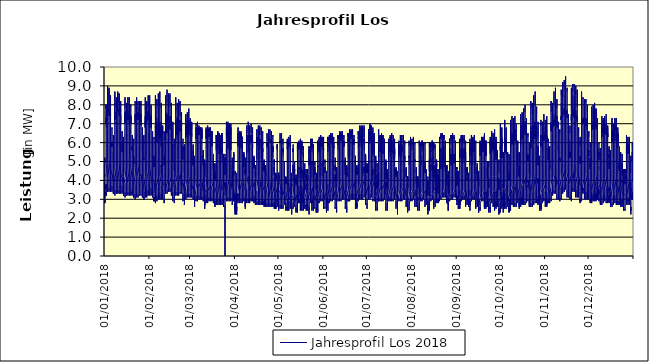
| Category | Jahresprofil Los 2018 |
|---|---|
| 01/01/2018 | 3.4 |
| 01/01/2018 | 3.2 |
| 01/01/2018 | 3.1 |
| 01/01/2018 | 2.9 |
| 01/01/2018 | 3 |
| 01/01/2018 | 2.8 |
| 01/01/2018 | 3 |
| 01/01/2018 | 2.8 |
| 01/01/2018 | 3.2 |
| 01/01/2018 | 3.1 |
| 01/01/2018 | 3.9 |
| 01/01/2018 | 4.3 |
| 01/01/2018 | 4.2 |
| 01/01/2018 | 4.4 |
| 01/01/2018 | 4.5 |
| 01/01/2018 | 4.7 |
| 01/01/2018 | 5.1 |
| 01/01/2018 | 5 |
| 01/01/2018 | 5.2 |
| 01/01/2018 | 4.9 |
| 01/01/2018 | 4.4 |
| 01/01/2018 | 4.3 |
| 01/01/2018 | 3.8 |
| 02/01/2018 | 3.5 |
| 02/01/2018 | 3.8 |
| 02/01/2018 | 3.2 |
| 02/01/2018 | 3.4 |
| 02/01/2018 | 3.2 |
| 02/01/2018 | 3.4 |
| 02/01/2018 | 3.6 |
| 02/01/2018 | 4.9 |
| 02/01/2018 | 5.7 |
| 02/01/2018 | 6.3 |
| 02/01/2018 | 6.7 |
| 02/01/2018 | 6.7 |
| 02/01/2018 | 6.9 |
| 02/01/2018 | 7.1 |
| 02/01/2018 | 7.3 |
| 02/01/2018 | 7 |
| 02/01/2018 | 7 |
| 02/01/2018 | 7.7 |
| 02/01/2018 | 8 |
| 02/01/2018 | 7.8 |
| 02/01/2018 | 8 |
| 02/01/2018 | 6.8 |
| 02/01/2018 | 6 |
| 02/01/2018 | 5.5 |
| 03/01/2018 | 4.9 |
| 03/01/2018 | 4.1 |
| 03/01/2018 | 3.9 |
| 03/01/2018 | 3.6 |
| 03/01/2018 | 3.4 |
| 03/01/2018 | 3.6 |
| 03/01/2018 | 4.1 |
| 03/01/2018 | 4.9 |
| 03/01/2018 | 6 |
| 03/01/2018 | 7 |
| 03/01/2018 | 7.3 |
| 03/01/2018 | 7.2 |
| 03/01/2018 | 7.3 |
| 03/01/2018 | 7.4 |
| 03/01/2018 | 7.7 |
| 03/01/2018 | 7.6 |
| 03/01/2018 | 7.6 |
| 03/01/2018 | 8.5 |
| 03/01/2018 | 9 |
| 03/01/2018 | 7.8 |
| 03/01/2018 | 7.6 |
| 03/01/2018 | 7.4 |
| 03/01/2018 | 6.7 |
| 03/01/2018 | 5.9 |
| 04/01/2018 | 5.1 |
| 04/01/2018 | 4.1 |
| 04/01/2018 | 3.9 |
| 04/01/2018 | 3.6 |
| 04/01/2018 | 3.4 |
| 04/01/2018 | 3.6 |
| 04/01/2018 | 4.1 |
| 04/01/2018 | 4.9 |
| 04/01/2018 | 6 |
| 04/01/2018 | 6.9 |
| 04/01/2018 | 7.1 |
| 04/01/2018 | 7.5 |
| 04/01/2018 | 7.6 |
| 04/01/2018 | 7.8 |
| 04/01/2018 | 7.6 |
| 04/01/2018 | 7.4 |
| 04/01/2018 | 7.4 |
| 04/01/2018 | 8.8 |
| 04/01/2018 | 8.9 |
| 04/01/2018 | 7.8 |
| 04/01/2018 | 7.7 |
| 04/01/2018 | 7.4 |
| 04/01/2018 | 6.7 |
| 04/01/2018 | 5.9 |
| 05/01/2018 | 5.1 |
| 05/01/2018 | 4.2 |
| 05/01/2018 | 3.5 |
| 05/01/2018 | 3.7 |
| 05/01/2018 | 3.4 |
| 05/01/2018 | 3.6 |
| 05/01/2018 | 4 |
| 05/01/2018 | 5.3 |
| 05/01/2018 | 6.3 |
| 05/01/2018 | 6.7 |
| 05/01/2018 | 7 |
| 05/01/2018 | 6.9 |
| 05/01/2018 | 7.5 |
| 05/01/2018 | 7.5 |
| 05/01/2018 | 7.4 |
| 05/01/2018 | 7.6 |
| 05/01/2018 | 7.5 |
| 05/01/2018 | 8.2 |
| 05/01/2018 | 8.5 |
| 05/01/2018 | 7.8 |
| 05/01/2018 | 7.5 |
| 05/01/2018 | 6.9 |
| 05/01/2018 | 6.4 |
| 05/01/2018 | 5.5 |
| 06/01/2018 | 4.6 |
| 06/01/2018 | 4.3 |
| 06/01/2018 | 3.8 |
| 06/01/2018 | 3.5 |
| 06/01/2018 | 3.5 |
| 06/01/2018 | 3.4 |
| 06/01/2018 | 3.4 |
| 06/01/2018 | 3.7 |
| 06/01/2018 | 4.5 |
| 06/01/2018 | 4.9 |
| 06/01/2018 | 5.3 |
| 06/01/2018 | 6 |
| 06/01/2018 | 5.8 |
| 06/01/2018 | 5.9 |
| 06/01/2018 | 5.8 |
| 06/01/2018 | 5.9 |
| 06/01/2018 | 5.9 |
| 06/01/2018 | 6.8 |
| 06/01/2018 | 6.7 |
| 06/01/2018 | 6.3 |
| 06/01/2018 | 6.3 |
| 06/01/2018 | 6.2 |
| 06/01/2018 | 5.6 |
| 06/01/2018 | 4.9 |
| 07/01/2018 | 4.4 |
| 07/01/2018 | 3.9 |
| 07/01/2018 | 3.6 |
| 07/01/2018 | 3.3 |
| 07/01/2018 | 3.4 |
| 07/01/2018 | 3.3 |
| 07/01/2018 | 3.4 |
| 07/01/2018 | 3.6 |
| 07/01/2018 | 3.6 |
| 07/01/2018 | 4.3 |
| 07/01/2018 | 4.7 |
| 07/01/2018 | 5.1 |
| 07/01/2018 | 5.3 |
| 07/01/2018 | 5.3 |
| 07/01/2018 | 5.5 |
| 07/01/2018 | 5.1 |
| 07/01/2018 | 5.2 |
| 07/01/2018 | 6.1 |
| 07/01/2018 | 6.4 |
| 07/01/2018 | 5.9 |
| 07/01/2018 | 5.9 |
| 07/01/2018 | 6 |
| 07/01/2018 | 5.7 |
| 07/01/2018 | 4.9 |
| 08/01/2018 | 4.4 |
| 08/01/2018 | 3.9 |
| 08/01/2018 | 3.5 |
| 08/01/2018 | 3.4 |
| 08/01/2018 | 3.2 |
| 08/01/2018 | 3.5 |
| 08/01/2018 | 4 |
| 08/01/2018 | 4.9 |
| 08/01/2018 | 5.8 |
| 08/01/2018 | 6.8 |
| 08/01/2018 | 7.1 |
| 08/01/2018 | 7 |
| 08/01/2018 | 7.1 |
| 08/01/2018 | 7.4 |
| 08/01/2018 | 7.2 |
| 08/01/2018 | 7.6 |
| 08/01/2018 | 7.5 |
| 08/01/2018 | 8.1 |
| 08/01/2018 | 8.7 |
| 08/01/2018 | 8 |
| 08/01/2018 | 7.9 |
| 08/01/2018 | 7.1 |
| 08/01/2018 | 6.4 |
| 08/01/2018 | 5.6 |
| 09/01/2018 | 4.7 |
| 09/01/2018 | 3.8 |
| 09/01/2018 | 3.7 |
| 09/01/2018 | 3.5 |
| 09/01/2018 | 3.3 |
| 09/01/2018 | 3.5 |
| 09/01/2018 | 3.9 |
| 09/01/2018 | 5.3 |
| 09/01/2018 | 6.2 |
| 09/01/2018 | 6.7 |
| 09/01/2018 | 7 |
| 09/01/2018 | 7.3 |
| 09/01/2018 | 7.4 |
| 09/01/2018 | 7.6 |
| 09/01/2018 | 7.3 |
| 09/01/2018 | 7.7 |
| 09/01/2018 | 7.7 |
| 09/01/2018 | 8.2 |
| 09/01/2018 | 8.4 |
| 09/01/2018 | 7.8 |
| 09/01/2018 | 7.6 |
| 09/01/2018 | 7.3 |
| 09/01/2018 | 6.5 |
| 09/01/2018 | 5.6 |
| 10/01/2018 | 4.8 |
| 10/01/2018 | 3.9 |
| 10/01/2018 | 3.8 |
| 10/01/2018 | 3.5 |
| 10/01/2018 | 3.3 |
| 10/01/2018 | 3.5 |
| 10/01/2018 | 4 |
| 10/01/2018 | 5.3 |
| 10/01/2018 | 6.3 |
| 10/01/2018 | 6.8 |
| 10/01/2018 | 7 |
| 10/01/2018 | 7.4 |
| 10/01/2018 | 7.5 |
| 10/01/2018 | 7.6 |
| 10/01/2018 | 7.8 |
| 10/01/2018 | 7.6 |
| 10/01/2018 | 7.6 |
| 10/01/2018 | 8.6 |
| 10/01/2018 | 8.7 |
| 10/01/2018 | 8.1 |
| 10/01/2018 | 7.9 |
| 10/01/2018 | 7.1 |
| 10/01/2018 | 6.4 |
| 10/01/2018 | 5.6 |
| 11/01/2018 | 4.8 |
| 11/01/2018 | 3.9 |
| 11/01/2018 | 3.8 |
| 11/01/2018 | 3.5 |
| 11/01/2018 | 3.3 |
| 11/01/2018 | 3.5 |
| 11/01/2018 | 4 |
| 11/01/2018 | 5.3 |
| 11/01/2018 | 6.3 |
| 11/01/2018 | 6.7 |
| 11/01/2018 | 6.9 |
| 11/01/2018 | 7.3 |
| 11/01/2018 | 7.3 |
| 11/01/2018 | 7.5 |
| 11/01/2018 | 7.7 |
| 11/01/2018 | 7.5 |
| 11/01/2018 | 7.4 |
| 11/01/2018 | 8.4 |
| 11/01/2018 | 8.6 |
| 11/01/2018 | 8.1 |
| 11/01/2018 | 8 |
| 11/01/2018 | 7.1 |
| 11/01/2018 | 6.4 |
| 11/01/2018 | 5.6 |
| 12/01/2018 | 4.9 |
| 12/01/2018 | 4 |
| 12/01/2018 | 3.8 |
| 12/01/2018 | 3.6 |
| 12/01/2018 | 3.3 |
| 12/01/2018 | 3.5 |
| 12/01/2018 | 3.9 |
| 12/01/2018 | 5.2 |
| 12/01/2018 | 6.1 |
| 12/01/2018 | 6.5 |
| 12/01/2018 | 6.8 |
| 12/01/2018 | 7.2 |
| 12/01/2018 | 7.2 |
| 12/01/2018 | 7.2 |
| 12/01/2018 | 7.5 |
| 12/01/2018 | 7.2 |
| 12/01/2018 | 7 |
| 12/01/2018 | 7.8 |
| 12/01/2018 | 8.2 |
| 12/01/2018 | 7.6 |
| 12/01/2018 | 7.3 |
| 12/01/2018 | 6.6 |
| 12/01/2018 | 6.1 |
| 12/01/2018 | 5.2 |
| 13/01/2018 | 4.4 |
| 13/01/2018 | 4.1 |
| 13/01/2018 | 3.6 |
| 13/01/2018 | 3.4 |
| 13/01/2018 | 3.4 |
| 13/01/2018 | 3.3 |
| 13/01/2018 | 3.3 |
| 13/01/2018 | 3.7 |
| 13/01/2018 | 4.3 |
| 13/01/2018 | 4.8 |
| 13/01/2018 | 5.6 |
| 13/01/2018 | 5.8 |
| 13/01/2018 | 6.1 |
| 13/01/2018 | 6.1 |
| 13/01/2018 | 6 |
| 13/01/2018 | 5.5 |
| 13/01/2018 | 6 |
| 13/01/2018 | 6.1 |
| 13/01/2018 | 6.5 |
| 13/01/2018 | 6.6 |
| 13/01/2018 | 6.1 |
| 13/01/2018 | 6 |
| 13/01/2018 | 5.4 |
| 13/01/2018 | 5.1 |
| 14/01/2018 | 4.2 |
| 14/01/2018 | 3.8 |
| 14/01/2018 | 3.5 |
| 14/01/2018 | 3.2 |
| 14/01/2018 | 3.3 |
| 14/01/2018 | 3.2 |
| 14/01/2018 | 3.3 |
| 14/01/2018 | 3.5 |
| 14/01/2018 | 4 |
| 14/01/2018 | 4.2 |
| 14/01/2018 | 4.6 |
| 14/01/2018 | 4.9 |
| 14/01/2018 | 5.1 |
| 14/01/2018 | 5.1 |
| 14/01/2018 | 5.2 |
| 14/01/2018 | 5.3 |
| 14/01/2018 | 5.3 |
| 14/01/2018 | 5.9 |
| 14/01/2018 | 6.3 |
| 14/01/2018 | 6.3 |
| 14/01/2018 | 5.7 |
| 14/01/2018 | 5.8 |
| 14/01/2018 | 5.4 |
| 14/01/2018 | 4.7 |
| 15/01/2018 | 4.2 |
| 15/01/2018 | 3.8 |
| 15/01/2018 | 3.4 |
| 15/01/2018 | 3.3 |
| 15/01/2018 | 3.1 |
| 15/01/2018 | 3.4 |
| 15/01/2018 | 3.9 |
| 15/01/2018 | 4.8 |
| 15/01/2018 | 6.1 |
| 15/01/2018 | 6.6 |
| 15/01/2018 | 6.9 |
| 15/01/2018 | 7.3 |
| 15/01/2018 | 7.4 |
| 15/01/2018 | 7.6 |
| 15/01/2018 | 7.3 |
| 15/01/2018 | 7.2 |
| 15/01/2018 | 7 |
| 15/01/2018 | 7.7 |
| 15/01/2018 | 8.4 |
| 15/01/2018 | 7.8 |
| 15/01/2018 | 7.7 |
| 15/01/2018 | 6.8 |
| 15/01/2018 | 6.1 |
| 15/01/2018 | 5.3 |
| 16/01/2018 | 4.5 |
| 16/01/2018 | 4.1 |
| 16/01/2018 | 3.6 |
| 16/01/2018 | 3.4 |
| 16/01/2018 | 3.2 |
| 16/01/2018 | 3.4 |
| 16/01/2018 | 3.8 |
| 16/01/2018 | 5.2 |
| 16/01/2018 | 6.1 |
| 16/01/2018 | 6.5 |
| 16/01/2018 | 7.2 |
| 16/01/2018 | 7.1 |
| 16/01/2018 | 7.6 |
| 16/01/2018 | 7.3 |
| 16/01/2018 | 7.5 |
| 16/01/2018 | 7.3 |
| 16/01/2018 | 7.2 |
| 16/01/2018 | 7.8 |
| 16/01/2018 | 8.1 |
| 16/01/2018 | 8.1 |
| 16/01/2018 | 7.9 |
| 16/01/2018 | 7 |
| 16/01/2018 | 6.2 |
| 16/01/2018 | 5.3 |
| 17/01/2018 | 4.5 |
| 17/01/2018 | 3.8 |
| 17/01/2018 | 3.7 |
| 17/01/2018 | 3.4 |
| 17/01/2018 | 3.2 |
| 17/01/2018 | 3.4 |
| 17/01/2018 | 3.9 |
| 17/01/2018 | 5.2 |
| 17/01/2018 | 6.1 |
| 17/01/2018 | 6.5 |
| 17/01/2018 | 7.3 |
| 17/01/2018 | 7.2 |
| 17/01/2018 | 7.7 |
| 17/01/2018 | 7.3 |
| 17/01/2018 | 7.4 |
| 17/01/2018 | 7.2 |
| 17/01/2018 | 7.6 |
| 17/01/2018 | 8.2 |
| 17/01/2018 | 8.4 |
| 17/01/2018 | 8.4 |
| 17/01/2018 | 7.7 |
| 17/01/2018 | 7.3 |
| 17/01/2018 | 6 |
| 17/01/2018 | 5.3 |
| 18/01/2018 | 4.6 |
| 18/01/2018 | 3.8 |
| 18/01/2018 | 3.7 |
| 18/01/2018 | 3.4 |
| 18/01/2018 | 3.2 |
| 18/01/2018 | 3.4 |
| 18/01/2018 | 3.9 |
| 18/01/2018 | 5.2 |
| 18/01/2018 | 6.1 |
| 18/01/2018 | 7 |
| 18/01/2018 | 7.2 |
| 18/01/2018 | 7 |
| 18/01/2018 | 7.5 |
| 18/01/2018 | 7.7 |
| 18/01/2018 | 7.4 |
| 18/01/2018 | 7.6 |
| 18/01/2018 | 7.5 |
| 18/01/2018 | 8 |
| 18/01/2018 | 8.3 |
| 18/01/2018 | 8.4 |
| 18/01/2018 | 7.8 |
| 18/01/2018 | 6.8 |
| 18/01/2018 | 6.1 |
| 18/01/2018 | 5.3 |
| 19/01/2018 | 4.6 |
| 19/01/2018 | 3.9 |
| 19/01/2018 | 3.7 |
| 19/01/2018 | 3.5 |
| 19/01/2018 | 3.2 |
| 19/01/2018 | 3.4 |
| 19/01/2018 | 3.8 |
| 19/01/2018 | 5.1 |
| 19/01/2018 | 5.9 |
| 19/01/2018 | 6.8 |
| 19/01/2018 | 7.1 |
| 19/01/2018 | 7 |
| 19/01/2018 | 7.4 |
| 19/01/2018 | 7.3 |
| 19/01/2018 | 7.2 |
| 19/01/2018 | 7.3 |
| 19/01/2018 | 7 |
| 19/01/2018 | 7.5 |
| 19/01/2018 | 8 |
| 19/01/2018 | 7.9 |
| 19/01/2018 | 7.6 |
| 19/01/2018 | 6.8 |
| 19/01/2018 | 5.8 |
| 19/01/2018 | 4.9 |
| 20/01/2018 | 4.7 |
| 20/01/2018 | 4 |
| 20/01/2018 | 3.5 |
| 20/01/2018 | 3.3 |
| 20/01/2018 | 3.4 |
| 20/01/2018 | 3.3 |
| 20/01/2018 | 3.2 |
| 20/01/2018 | 3.6 |
| 20/01/2018 | 4.2 |
| 20/01/2018 | 5.1 |
| 20/01/2018 | 5.5 |
| 20/01/2018 | 5.6 |
| 20/01/2018 | 5.8 |
| 20/01/2018 | 5.8 |
| 20/01/2018 | 5.6 |
| 20/01/2018 | 5.7 |
| 20/01/2018 | 5.6 |
| 20/01/2018 | 5.8 |
| 20/01/2018 | 6.4 |
| 20/01/2018 | 6.4 |
| 20/01/2018 | 6.4 |
| 20/01/2018 | 5.7 |
| 20/01/2018 | 5.1 |
| 20/01/2018 | 4.8 |
| 21/01/2018 | 4.5 |
| 21/01/2018 | 3.7 |
| 21/01/2018 | 3.3 |
| 21/01/2018 | 3.1 |
| 21/01/2018 | 3.2 |
| 21/01/2018 | 3.1 |
| 21/01/2018 | 3.2 |
| 21/01/2018 | 3.5 |
| 21/01/2018 | 3.8 |
| 21/01/2018 | 4 |
| 21/01/2018 | 4.4 |
| 21/01/2018 | 4.7 |
| 21/01/2018 | 4.9 |
| 21/01/2018 | 5.3 |
| 21/01/2018 | 4.9 |
| 21/01/2018 | 5 |
| 21/01/2018 | 4.9 |
| 21/01/2018 | 5.2 |
| 21/01/2018 | 6.2 |
| 21/01/2018 | 6.1 |
| 21/01/2018 | 6.1 |
| 21/01/2018 | 5.5 |
| 21/01/2018 | 5.1 |
| 21/01/2018 | 4.9 |
| 22/01/2018 | 4.4 |
| 22/01/2018 | 3.7 |
| 22/01/2018 | 3.3 |
| 22/01/2018 | 3.2 |
| 22/01/2018 | 3 |
| 22/01/2018 | 3.3 |
| 22/01/2018 | 3.8 |
| 22/01/2018 | 5.2 |
| 22/01/2018 | 6 |
| 22/01/2018 | 6.4 |
| 22/01/2018 | 6.7 |
| 22/01/2018 | 7.1 |
| 22/01/2018 | 7.1 |
| 22/01/2018 | 7.2 |
| 22/01/2018 | 7.5 |
| 22/01/2018 | 7.3 |
| 22/01/2018 | 7 |
| 22/01/2018 | 7.3 |
| 22/01/2018 | 8.2 |
| 22/01/2018 | 8.1 |
| 22/01/2018 | 8 |
| 22/01/2018 | 7 |
| 22/01/2018 | 5.8 |
| 22/01/2018 | 5.5 |
| 23/01/2018 | 4.7 |
| 23/01/2018 | 4 |
| 23/01/2018 | 3.4 |
| 23/01/2018 | 3.2 |
| 23/01/2018 | 3.1 |
| 23/01/2018 | 3.3 |
| 23/01/2018 | 4.2 |
| 23/01/2018 | 5.1 |
| 23/01/2018 | 5.9 |
| 23/01/2018 | 6.8 |
| 23/01/2018 | 7 |
| 23/01/2018 | 7.3 |
| 23/01/2018 | 7.3 |
| 23/01/2018 | 7.4 |
| 23/01/2018 | 7.6 |
| 23/01/2018 | 7.4 |
| 23/01/2018 | 7.2 |
| 23/01/2018 | 7.5 |
| 23/01/2018 | 8.3 |
| 23/01/2018 | 8.4 |
| 23/01/2018 | 7.7 |
| 23/01/2018 | 6.7 |
| 23/01/2018 | 5.8 |
| 23/01/2018 | 5 |
| 24/01/2018 | 4.8 |
| 24/01/2018 | 4.1 |
| 24/01/2018 | 3.5 |
| 24/01/2018 | 3.3 |
| 24/01/2018 | 3.1 |
| 24/01/2018 | 3.3 |
| 24/01/2018 | 4.3 |
| 24/01/2018 | 5.1 |
| 24/01/2018 | 5.9 |
| 24/01/2018 | 6.8 |
| 24/01/2018 | 7.1 |
| 24/01/2018 | 7.5 |
| 24/01/2018 | 7.4 |
| 24/01/2018 | 7.5 |
| 24/01/2018 | 7.6 |
| 24/01/2018 | 7.3 |
| 24/01/2018 | 7.2 |
| 24/01/2018 | 7.9 |
| 24/01/2018 | 8.2 |
| 24/01/2018 | 8.2 |
| 24/01/2018 | 8 |
| 24/01/2018 | 7 |
| 24/01/2018 | 6.2 |
| 24/01/2018 | 5.5 |
| 25/01/2018 | 4.8 |
| 25/01/2018 | 4.2 |
| 25/01/2018 | 3.6 |
| 25/01/2018 | 3.3 |
| 25/01/2018 | 3.2 |
| 25/01/2018 | 3.3 |
| 25/01/2018 | 4.3 |
| 25/01/2018 | 5.1 |
| 25/01/2018 | 5.9 |
| 25/01/2018 | 6.7 |
| 25/01/2018 | 7 |
| 25/01/2018 | 7.3 |
| 25/01/2018 | 7.3 |
| 25/01/2018 | 7.4 |
| 25/01/2018 | 7.5 |
| 25/01/2018 | 7.2 |
| 25/01/2018 | 7.5 |
| 25/01/2018 | 7.7 |
| 25/01/2018 | 8.1 |
| 25/01/2018 | 8.2 |
| 25/01/2018 | 8.1 |
| 25/01/2018 | 7 |
| 25/01/2018 | 5.7 |
| 25/01/2018 | 5 |
| 26/01/2018 | 4.4 |
| 26/01/2018 | 4.2 |
| 26/01/2018 | 3.6 |
| 26/01/2018 | 3.3 |
| 26/01/2018 | 3.2 |
| 26/01/2018 | 3.3 |
| 26/01/2018 | 4.2 |
| 26/01/2018 | 5 |
| 26/01/2018 | 6.2 |
| 26/01/2018 | 6.6 |
| 26/01/2018 | 6.9 |
| 26/01/2018 | 7.2 |
| 26/01/2018 | 7.1 |
| 26/01/2018 | 7.5 |
| 26/01/2018 | 7.3 |
| 26/01/2018 | 6.9 |
| 26/01/2018 | 7 |
| 26/01/2018 | 7.1 |
| 26/01/2018 | 7.8 |
| 26/01/2018 | 8.2 |
| 26/01/2018 | 7.4 |
| 26/01/2018 | 6.6 |
| 26/01/2018 | 5.5 |
| 26/01/2018 | 5.2 |
| 27/01/2018 | 4.4 |
| 27/01/2018 | 3.8 |
| 27/01/2018 | 3.4 |
| 27/01/2018 | 3.1 |
| 27/01/2018 | 3.3 |
| 27/01/2018 | 3.2 |
| 27/01/2018 | 3.2 |
| 27/01/2018 | 4 |
| 27/01/2018 | 4.5 |
| 27/01/2018 | 4.9 |
| 27/01/2018 | 5.3 |
| 27/01/2018 | 5.9 |
| 27/01/2018 | 6.1 |
| 27/01/2018 | 6 |
| 27/01/2018 | 5.8 |
| 27/01/2018 | 5.8 |
| 27/01/2018 | 5.7 |
| 27/01/2018 | 5.6 |
| 27/01/2018 | 6.2 |
| 27/01/2018 | 6.8 |
| 27/01/2018 | 6.2 |
| 27/01/2018 | 5.4 |
| 27/01/2018 | 5.3 |
| 27/01/2018 | 4.6 |
| 28/01/2018 | 4.3 |
| 28/01/2018 | 3.5 |
| 28/01/2018 | 3.2 |
| 28/01/2018 | 3 |
| 28/01/2018 | 3.1 |
| 28/01/2018 | 3 |
| 28/01/2018 | 3.2 |
| 28/01/2018 | 3.4 |
| 28/01/2018 | 3.7 |
| 28/01/2018 | 4.4 |
| 28/01/2018 | 4.8 |
| 28/01/2018 | 5 |
| 28/01/2018 | 5.2 |
| 28/01/2018 | 5.1 |
| 28/01/2018 | 5.1 |
| 28/01/2018 | 5.1 |
| 28/01/2018 | 5.1 |
| 28/01/2018 | 5.1 |
| 28/01/2018 | 6.1 |
| 28/01/2018 | 6.4 |
| 28/01/2018 | 5.9 |
| 28/01/2018 | 5.2 |
| 28/01/2018 | 4.8 |
| 28/01/2018 | 4.6 |
| 29/01/2018 | 4.2 |
| 29/01/2018 | 3.5 |
| 29/01/2018 | 3.1 |
| 29/01/2018 | 3.1 |
| 29/01/2018 | 3.4 |
| 29/01/2018 | 3.2 |
| 29/01/2018 | 3.7 |
| 29/01/2018 | 5.1 |
| 29/01/2018 | 5.8 |
| 29/01/2018 | 6.6 |
| 29/01/2018 | 7 |
| 29/01/2018 | 6.8 |
| 29/01/2018 | 7.3 |
| 29/01/2018 | 7.4 |
| 29/01/2018 | 7.1 |
| 29/01/2018 | 6.8 |
| 29/01/2018 | 7.1 |
| 29/01/2018 | 7 |
| 29/01/2018 | 7.9 |
| 29/01/2018 | 8.4 |
| 29/01/2018 | 7.8 |
| 29/01/2018 | 6.8 |
| 29/01/2018 | 5.9 |
| 29/01/2018 | 5.2 |
| 30/01/2018 | 4.5 |
| 30/01/2018 | 3.8 |
| 30/01/2018 | 3.3 |
| 30/01/2018 | 3.1 |
| 30/01/2018 | 3.5 |
| 30/01/2018 | 3.7 |
| 30/01/2018 | 4.1 |
| 30/01/2018 | 5 |
| 30/01/2018 | 6.2 |
| 30/01/2018 | 6.6 |
| 30/01/2018 | 6.8 |
| 30/01/2018 | 7.1 |
| 30/01/2018 | 7.6 |
| 30/01/2018 | 7.6 |
| 30/01/2018 | 7.2 |
| 30/01/2018 | 7.5 |
| 30/01/2018 | 7.2 |
| 30/01/2018 | 7.1 |
| 30/01/2018 | 8.1 |
| 30/01/2018 | 8.2 |
| 30/01/2018 | 8 |
| 30/01/2018 | 6.9 |
| 30/01/2018 | 6 |
| 30/01/2018 | 5.2 |
| 31/01/2018 | 4.5 |
| 31/01/2018 | 4 |
| 31/01/2018 | 3.4 |
| 31/01/2018 | 3.2 |
| 31/01/2018 | 3.5 |
| 31/01/2018 | 3.7 |
| 31/01/2018 | 4.2 |
| 31/01/2018 | 5 |
| 31/01/2018 | 6.2 |
| 31/01/2018 | 6.6 |
| 31/01/2018 | 6.9 |
| 31/01/2018 | 7.2 |
| 31/01/2018 | 7.6 |
| 31/01/2018 | 7.7 |
| 31/01/2018 | 7.2 |
| 31/01/2018 | 7.4 |
| 31/01/2018 | 7.2 |
| 31/01/2018 | 7.5 |
| 31/01/2018 | 7.9 |
| 31/01/2018 | 8.5 |
| 31/01/2018 | 7.8 |
| 31/01/2018 | 6.7 |
| 31/01/2018 | 5.9 |
| 31/01/2018 | 5.2 |
| 01/02/2018 | 4.6 |
| 01/02/2018 | 4 |
| 01/02/2018 | 3.4 |
| 01/02/2018 | 3.2 |
| 01/02/2018 | 3.6 |
| 01/02/2018 | 3.7 |
| 01/02/2018 | 4.2 |
| 01/02/2018 | 5 |
| 01/02/2018 | 6.2 |
| 01/02/2018 | 6.5 |
| 01/02/2018 | 6.8 |
| 01/02/2018 | 7.1 |
| 01/02/2018 | 7.5 |
| 01/02/2018 | 7.5 |
| 01/02/2018 | 7.1 |
| 01/02/2018 | 7.3 |
| 01/02/2018 | 7 |
| 01/02/2018 | 7.3 |
| 01/02/2018 | 7.8 |
| 01/02/2018 | 8.5 |
| 01/02/2018 | 7.9 |
| 01/02/2018 | 6.7 |
| 01/02/2018 | 5.9 |
| 01/02/2018 | 5.2 |
| 02/02/2018 | 4.7 |
| 02/02/2018 | 4.1 |
| 02/02/2018 | 3.5 |
| 02/02/2018 | 3.2 |
| 02/02/2018 | 3.6 |
| 02/02/2018 | 3.7 |
| 02/02/2018 | 4.1 |
| 02/02/2018 | 4.9 |
| 02/02/2018 | 6 |
| 02/02/2018 | 6.4 |
| 02/02/2018 | 6.7 |
| 02/02/2018 | 7 |
| 02/02/2018 | 7.4 |
| 02/02/2018 | 7.2 |
| 02/02/2018 | 7 |
| 02/02/2018 | 7 |
| 02/02/2018 | 7.1 |
| 02/02/2018 | 6.8 |
| 02/02/2018 | 7.5 |
| 02/02/2018 | 8 |
| 02/02/2018 | 7.2 |
| 02/02/2018 | 6.3 |
| 02/02/2018 | 5.7 |
| 02/02/2018 | 4.9 |
| 03/02/2018 | 4.2 |
| 03/02/2018 | 3.7 |
| 03/02/2018 | 3.3 |
| 03/02/2018 | 3.5 |
| 03/02/2018 | 3.2 |
| 03/02/2018 | 3.1 |
| 03/02/2018 | 3.6 |
| 03/02/2018 | 3.9 |
| 03/02/2018 | 4.4 |
| 03/02/2018 | 4.8 |
| 03/02/2018 | 5.6 |
| 03/02/2018 | 5.7 |
| 03/02/2018 | 5.9 |
| 03/02/2018 | 5.7 |
| 03/02/2018 | 5.5 |
| 03/02/2018 | 5.5 |
| 03/02/2018 | 5.3 |
| 03/02/2018 | 5.4 |
| 03/02/2018 | 6.1 |
| 03/02/2018 | 6.6 |
| 03/02/2018 | 6.6 |
| 03/02/2018 | 5.7 |
| 03/02/2018 | 5 |
| 03/02/2018 | 4.3 |
| 04/02/2018 | 4 |
| 04/02/2018 | 3.9 |
| 04/02/2018 | 3.1 |
| 04/02/2018 | 2.9 |
| 04/02/2018 | 3.1 |
| 04/02/2018 | 2.9 |
| 04/02/2018 | 3.1 |
| 04/02/2018 | 3.3 |
| 04/02/2018 | 3.6 |
| 04/02/2018 | 4.2 |
| 04/02/2018 | 4.6 |
| 04/02/2018 | 4.9 |
| 04/02/2018 | 4.9 |
| 04/02/2018 | 5.3 |
| 04/02/2018 | 4.8 |
| 04/02/2018 | 4.8 |
| 04/02/2018 | 4.7 |
| 04/02/2018 | 4.9 |
| 04/02/2018 | 6 |
| 04/02/2018 | 6.3 |
| 04/02/2018 | 6.2 |
| 04/02/2018 | 5.5 |
| 04/02/2018 | 5 |
| 04/02/2018 | 4.4 |
| 05/02/2018 | 4 |
| 05/02/2018 | 3.3 |
| 05/02/2018 | 2.9 |
| 05/02/2018 | 2.8 |
| 05/02/2018 | 3.2 |
| 05/02/2018 | 2.9 |
| 05/02/2018 | 3.6 |
| 05/02/2018 | 4.5 |
| 05/02/2018 | 5.4 |
| 05/02/2018 | 6.4 |
| 05/02/2018 | 6.4 |
| 05/02/2018 | 6.9 |
| 05/02/2018 | 6.8 |
| 05/02/2018 | 6.9 |
| 05/02/2018 | 6.4 |
| 05/02/2018 | 6.4 |
| 05/02/2018 | 6 |
| 05/02/2018 | 5.9 |
| 05/02/2018 | 7.1 |
| 05/02/2018 | 8.5 |
| 05/02/2018 | 7.8 |
| 05/02/2018 | 6.2 |
| 05/02/2018 | 4.9 |
| 05/02/2018 | 4.5 |
| 06/02/2018 | 4.1 |
| 06/02/2018 | 3.6 |
| 06/02/2018 | 3.1 |
| 06/02/2018 | 2.9 |
| 06/02/2018 | 3.2 |
| 06/02/2018 | 3.4 |
| 06/02/2018 | 3.6 |
| 06/02/2018 | 4.4 |
| 06/02/2018 | 5.8 |
| 06/02/2018 | 6.3 |
| 06/02/2018 | 6.7 |
| 06/02/2018 | 6.6 |
| 06/02/2018 | 7 |
| 06/02/2018 | 7 |
| 06/02/2018 | 6.5 |
| 06/02/2018 | 6.5 |
| 06/02/2018 | 6.2 |
| 06/02/2018 | 6 |
| 06/02/2018 | 7.3 |
| 06/02/2018 | 8.3 |
| 06/02/2018 | 8 |
| 06/02/2018 | 5.8 |
| 06/02/2018 | 5 |
| 06/02/2018 | 4.6 |
| 07/02/2018 | 4.2 |
| 07/02/2018 | 3.7 |
| 07/02/2018 | 3.2 |
| 07/02/2018 | 3 |
| 07/02/2018 | 3.3 |
| 07/02/2018 | 3.4 |
| 07/02/2018 | 3.7 |
| 07/02/2018 | 4.9 |
| 07/02/2018 | 5.9 |
| 07/02/2018 | 6.3 |
| 07/02/2018 | 6.8 |
| 07/02/2018 | 6.7 |
| 07/02/2018 | 7.1 |
| 07/02/2018 | 7.1 |
| 07/02/2018 | 6.5 |
| 07/02/2018 | 6.5 |
| 07/02/2018 | 6.6 |
| 07/02/2018 | 6.4 |
| 07/02/2018 | 7.2 |
| 07/02/2018 | 8.6 |
| 07/02/2018 | 7.8 |
| 07/02/2018 | 6.2 |
| 07/02/2018 | 5.3 |
| 07/02/2018 | 4.6 |
| 08/02/2018 | 4.2 |
| 08/02/2018 | 3.7 |
| 08/02/2018 | 3.2 |
| 08/02/2018 | 3 |
| 08/02/2018 | 3.3 |
| 08/02/2018 | 3.4 |
| 08/02/2018 | 3.6 |
| 08/02/2018 | 4.9 |
| 08/02/2018 | 5.8 |
| 08/02/2018 | 6.2 |
| 08/02/2018 | 6.6 |
| 08/02/2018 | 7.1 |
| 08/02/2018 | 7 |
| 08/02/2018 | 7 |
| 08/02/2018 | 6.9 |
| 08/02/2018 | 6.4 |
| 08/02/2018 | 6.5 |
| 08/02/2018 | 6.2 |
| 08/02/2018 | 7.1 |
| 08/02/2018 | 8.7 |
| 08/02/2018 | 7.9 |
| 08/02/2018 | 5.7 |
| 08/02/2018 | 4.9 |
| 08/02/2018 | 4.6 |
| 09/02/2018 | 4.3 |
| 09/02/2018 | 3.8 |
| 09/02/2018 | 3.2 |
| 09/02/2018 | 3 |
| 09/02/2018 | 3.3 |
| 09/02/2018 | 3.4 |
| 09/02/2018 | 3.6 |
| 09/02/2018 | 4.8 |
| 09/02/2018 | 5.6 |
| 09/02/2018 | 6.1 |
| 09/02/2018 | 6.6 |
| 09/02/2018 | 6.5 |
| 09/02/2018 | 6.9 |
| 09/02/2018 | 6.6 |
| 09/02/2018 | 6.2 |
| 09/02/2018 | 6.1 |
| 09/02/2018 | 6.1 |
| 09/02/2018 | 5.8 |
| 09/02/2018 | 6.8 |
| 09/02/2018 | 8.1 |
| 09/02/2018 | 7.8 |
| 09/02/2018 | 5.8 |
| 09/02/2018 | 4.7 |
| 09/02/2018 | 4.8 |
| 10/02/2018 | 4.3 |
| 10/02/2018 | 4 |
| 10/02/2018 | 3.7 |
| 10/02/2018 | 3.4 |
| 10/02/2018 | 3.1 |
| 10/02/2018 | 3 |
| 10/02/2018 | 3.5 |
| 10/02/2018 | 3.8 |
| 10/02/2018 | 4.2 |
| 10/02/2018 | 4.6 |
| 10/02/2018 | 5.4 |
| 10/02/2018 | 5.5 |
| 10/02/2018 | 5.6 |
| 10/02/2018 | 6 |
| 10/02/2018 | 5.7 |
| 10/02/2018 | 5.7 |
| 10/02/2018 | 5.4 |
| 10/02/2018 | 5.2 |
| 10/02/2018 | 6 |
| 10/02/2018 | 6.9 |
| 10/02/2018 | 6.4 |
| 10/02/2018 | 5.4 |
| 10/02/2018 | 4.7 |
| 10/02/2018 | 4.6 |
| 11/02/2018 | 3.8 |
| 11/02/2018 | 3.8 |
| 11/02/2018 | 3.5 |
| 11/02/2018 | 3.3 |
| 11/02/2018 | 3 |
| 11/02/2018 | 2.8 |
| 11/02/2018 | 3 |
| 11/02/2018 | 3.2 |
| 11/02/2018 | 4 |
| 11/02/2018 | 4.1 |
| 11/02/2018 | 4.4 |
| 11/02/2018 | 4.7 |
| 11/02/2018 | 5.2 |
| 11/02/2018 | 5.1 |
| 11/02/2018 | 5 |
| 11/02/2018 | 5 |
| 11/02/2018 | 4.8 |
| 11/02/2018 | 4.8 |
| 11/02/2018 | 5.4 |
| 11/02/2018 | 6.6 |
| 11/02/2018 | 6.1 |
| 11/02/2018 | 5.3 |
| 11/02/2018 | 4.7 |
| 11/02/2018 | 4.6 |
| 12/02/2018 | 3.8 |
| 12/02/2018 | 3.8 |
| 12/02/2018 | 3.4 |
| 12/02/2018 | 3.4 |
| 12/02/2018 | 3.3 |
| 12/02/2018 | 3.5 |
| 12/02/2018 | 4 |
| 12/02/2018 | 4.9 |
| 12/02/2018 | 5.9 |
| 12/02/2018 | 6.2 |
| 12/02/2018 | 6.6 |
| 12/02/2018 | 6.9 |
| 12/02/2018 | 7.3 |
| 12/02/2018 | 7.3 |
| 12/02/2018 | 6.9 |
| 12/02/2018 | 7 |
| 12/02/2018 | 6.6 |
| 12/02/2018 | 6.4 |
| 12/02/2018 | 7.5 |
| 12/02/2018 | 8.5 |
| 12/02/2018 | 7.9 |
| 12/02/2018 | 6.7 |
| 12/02/2018 | 5.3 |
| 12/02/2018 | 4.6 |
| 13/02/2018 | 4 |
| 13/02/2018 | 3.6 |
| 13/02/2018 | 3.6 |
| 13/02/2018 | 3.4 |
| 13/02/2018 | 3.3 |
| 13/02/2018 | 3.5 |
| 13/02/2018 | 3.9 |
| 13/02/2018 | 5.3 |
| 13/02/2018 | 5.8 |
| 13/02/2018 | 6.7 |
| 13/02/2018 | 6.9 |
| 13/02/2018 | 7.2 |
| 13/02/2018 | 7.5 |
| 13/02/2018 | 7.5 |
| 13/02/2018 | 7 |
| 13/02/2018 | 7.1 |
| 13/02/2018 | 6.8 |
| 13/02/2018 | 6.5 |
| 13/02/2018 | 7.6 |
| 13/02/2018 | 8.8 |
| 13/02/2018 | 8.1 |
| 13/02/2018 | 6.3 |
| 13/02/2018 | 5.4 |
| 13/02/2018 | 4.7 |
| 14/02/2018 | 4.1 |
| 14/02/2018 | 3.7 |
| 14/02/2018 | 3.7 |
| 14/02/2018 | 3.5 |
| 14/02/2018 | 3.4 |
| 14/02/2018 | 3.6 |
| 14/02/2018 | 4 |
| 14/02/2018 | 5.3 |
| 14/02/2018 | 5.9 |
| 14/02/2018 | 6.7 |
| 14/02/2018 | 7 |
| 14/02/2018 | 7.3 |
| 14/02/2018 | 7.1 |
| 14/02/2018 | 7.5 |
| 14/02/2018 | 7 |
| 14/02/2018 | 7.1 |
| 14/02/2018 | 6.8 |
| 14/02/2018 | 6.9 |
| 14/02/2018 | 7.5 |
| 14/02/2018 | 8.6 |
| 14/02/2018 | 7.9 |
| 14/02/2018 | 6.6 |
| 14/02/2018 | 5.3 |
| 14/02/2018 | 4.7 |
| 15/02/2018 | 4.1 |
| 15/02/2018 | 3.7 |
| 15/02/2018 | 3.7 |
| 15/02/2018 | 3.5 |
| 15/02/2018 | 3.4 |
| 15/02/2018 | 3.6 |
| 15/02/2018 | 4 |
| 15/02/2018 | 5.3 |
| 15/02/2018 | 5.8 |
| 15/02/2018 | 6.6 |
| 15/02/2018 | 6.8 |
| 15/02/2018 | 7.1 |
| 15/02/2018 | 7.4 |
| 15/02/2018 | 7.4 |
| 15/02/2018 | 6.9 |
| 15/02/2018 | 7 |
| 15/02/2018 | 7.1 |
| 15/02/2018 | 6.7 |
| 15/02/2018 | 7.4 |
| 15/02/2018 | 8.6 |
| 15/02/2018 | 7.9 |
| 15/02/2018 | 6.7 |
| 15/02/2018 | 5.3 |
| 15/02/2018 | 4.7 |
| 16/02/2018 | 4.2 |
| 16/02/2018 | 3.8 |
| 16/02/2018 | 3.2 |
| 16/02/2018 | 3.5 |
| 16/02/2018 | 3.4 |
| 16/02/2018 | 3.6 |
| 16/02/2018 | 3.9 |
| 16/02/2018 | 5.2 |
| 16/02/2018 | 6.1 |
| 16/02/2018 | 6.5 |
| 16/02/2018 | 6.8 |
| 16/02/2018 | 7.1 |
| 16/02/2018 | 7.3 |
| 16/02/2018 | 7.1 |
| 16/02/2018 | 6.7 |
| 16/02/2018 | 6.7 |
| 16/02/2018 | 6.7 |
| 16/02/2018 | 6.3 |
| 16/02/2018 | 7.1 |
| 16/02/2018 | 8.1 |
| 16/02/2018 | 7.3 |
| 16/02/2018 | 6.2 |
| 16/02/2018 | 5.1 |
| 16/02/2018 | 4.8 |
| 17/02/2018 | 4.2 |
| 17/02/2018 | 3.9 |
| 17/02/2018 | 3.5 |
| 17/02/2018 | 3.3 |
| 17/02/2018 | 3 |
| 17/02/2018 | 2.9 |
| 17/02/2018 | 3.4 |
| 17/02/2018 | 3.7 |
| 17/02/2018 | 4.1 |
| 17/02/2018 | 4.9 |
| 17/02/2018 | 5.2 |
| 17/02/2018 | 5.8 |
| 17/02/2018 | 5.9 |
| 17/02/2018 | 5.7 |
| 17/02/2018 | 5.4 |
| 17/02/2018 | 5.3 |
| 17/02/2018 | 5 |
| 17/02/2018 | 5.1 |
| 17/02/2018 | 5.8 |
| 17/02/2018 | 7.1 |
| 17/02/2018 | 6.1 |
| 17/02/2018 | 5.2 |
| 17/02/2018 | 4.5 |
| 17/02/2018 | 4.3 |
| 18/02/2018 | 4.1 |
| 18/02/2018 | 3.6 |
| 18/02/2018 | 3.4 |
| 18/02/2018 | 3.2 |
| 18/02/2018 | 2.9 |
| 18/02/2018 | 2.8 |
| 18/02/2018 | 2.9 |
| 18/02/2018 | 3.1 |
| 18/02/2018 | 3.8 |
| 18/02/2018 | 3.9 |
| 18/02/2018 | 4.8 |
| 18/02/2018 | 5 |
| 18/02/2018 | 5 |
| 18/02/2018 | 4.8 |
| 18/02/2018 | 4.7 |
| 18/02/2018 | 4.7 |
| 18/02/2018 | 4.5 |
| 18/02/2018 | 4.7 |
| 18/02/2018 | 5.3 |
| 18/02/2018 | 6.2 |
| 18/02/2018 | 5.8 |
| 18/02/2018 | 5 |
| 18/02/2018 | 4.5 |
| 18/02/2018 | 4.4 |
| 19/02/2018 | 4.1 |
| 19/02/2018 | 3.6 |
| 19/02/2018 | 3.3 |
| 19/02/2018 | 3.3 |
| 19/02/2018 | 3.2 |
| 19/02/2018 | 3.4 |
| 19/02/2018 | 3.9 |
| 19/02/2018 | 4.7 |
| 19/02/2018 | 5.6 |
| 19/02/2018 | 6.5 |
| 19/02/2018 | 6.8 |
| 19/02/2018 | 7.1 |
| 19/02/2018 | 6.9 |
| 19/02/2018 | 6.9 |
| 19/02/2018 | 7 |
| 19/02/2018 | 6.6 |
| 19/02/2018 | 6.7 |
| 19/02/2018 | 6.2 |
| 19/02/2018 | 7.2 |
| 19/02/2018 | 8.4 |
| 19/02/2018 | 7.5 |
| 19/02/2018 | 6.4 |
| 19/02/2018 | 5.6 |
| 19/02/2018 | 4.9 |
| 20/02/2018 | 4.3 |
| 20/02/2018 | 3.9 |
| 20/02/2018 | 3.4 |
| 20/02/2018 | 3.3 |
| 20/02/2018 | 3.2 |
| 20/02/2018 | 3.4 |
| 20/02/2018 | 3.8 |
| 20/02/2018 | 5.1 |
| 20/02/2018 | 6 |
| 20/02/2018 | 6.4 |
| 20/02/2018 | 6.6 |
| 20/02/2018 | 7.3 |
| 20/02/2018 | 7.1 |
| 20/02/2018 | 7.1 |
| 20/02/2018 | 7.1 |
| 20/02/2018 | 6.7 |
| 20/02/2018 | 6.8 |
| 20/02/2018 | 6.4 |
| 20/02/2018 | 7.4 |
| 20/02/2018 | 8.1 |
| 20/02/2018 | 7.7 |
| 20/02/2018 | 6.6 |
| 20/02/2018 | 5.2 |
| 20/02/2018 | 4.9 |
| 21/02/2018 | 4.3 |
| 21/02/2018 | 4 |
| 21/02/2018 | 3.5 |
| 21/02/2018 | 3.4 |
| 21/02/2018 | 3.2 |
| 21/02/2018 | 3.4 |
| 21/02/2018 | 3.9 |
| 21/02/2018 | 5.1 |
| 21/02/2018 | 6 |
| 21/02/2018 | 6.4 |
| 21/02/2018 | 6.6 |
| 21/02/2018 | 6.9 |
| 21/02/2018 | 7.2 |
| 21/02/2018 | 7.1 |
| 21/02/2018 | 7.1 |
| 21/02/2018 | 7.2 |
| 21/02/2018 | 6.8 |
| 21/02/2018 | 6.4 |
| 21/02/2018 | 7.2 |
| 21/02/2018 | 8.3 |
| 21/02/2018 | 7.4 |
| 21/02/2018 | 6.4 |
| 21/02/2018 | 5.6 |
| 21/02/2018 | 4.9 |
| 22/02/2018 | 4.4 |
| 22/02/2018 | 4 |
| 22/02/2018 | 3.5 |
| 22/02/2018 | 3.4 |
| 22/02/2018 | 3.3 |
| 22/02/2018 | 3.4 |
| 22/02/2018 | 3.9 |
| 22/02/2018 | 5.1 |
| 22/02/2018 | 6 |
| 22/02/2018 | 6.3 |
| 22/02/2018 | 7 |
| 22/02/2018 | 7.2 |
| 22/02/2018 | 7 |
| 22/02/2018 | 7 |
| 22/02/2018 | 7 |
| 22/02/2018 | 7.1 |
| 22/02/2018 | 6.6 |
| 22/02/2018 | 6.7 |
| 22/02/2018 | 7.1 |
| 22/02/2018 | 8.2 |
| 22/02/2018 | 7.4 |
| 22/02/2018 | 6.5 |
| 22/02/2018 | 5.1 |
| 22/02/2018 | 5 |
| 23/02/2018 | 4.5 |
| 23/02/2018 | 3.6 |
| 23/02/2018 | 3.6 |
| 23/02/2018 | 3.4 |
| 23/02/2018 | 3.3 |
| 23/02/2018 | 3.4 |
| 23/02/2018 | 3.8 |
| 23/02/2018 | 4.9 |
| 23/02/2018 | 5.8 |
| 23/02/2018 | 6.2 |
| 23/02/2018 | 6.9 |
| 23/02/2018 | 7.1 |
| 23/02/2018 | 6.9 |
| 23/02/2018 | 7.1 |
| 23/02/2018 | 6.8 |
| 23/02/2018 | 6.8 |
| 23/02/2018 | 6.7 |
| 23/02/2018 | 6.3 |
| 23/02/2018 | 6.8 |
| 23/02/2018 | 7.6 |
| 23/02/2018 | 7.2 |
| 23/02/2018 | 6 |
| 23/02/2018 | 5 |
| 23/02/2018 | 4.6 |
| 24/02/2018 | 4 |
| 24/02/2018 | 3.7 |
| 24/02/2018 | 3.4 |
| 24/02/2018 | 3.2 |
| 24/02/2018 | 2.9 |
| 24/02/2018 | 3.3 |
| 24/02/2018 | 3.3 |
| 24/02/2018 | 3.6 |
| 24/02/2018 | 4.3 |
| 24/02/2018 | 4.7 |
| 24/02/2018 | 4.9 |
| 24/02/2018 | 5.4 |
| 24/02/2018 | 5.5 |
| 24/02/2018 | 5.8 |
| 24/02/2018 | 5.5 |
| 24/02/2018 | 5.4 |
| 24/02/2018 | 5.1 |
| 24/02/2018 | 5.2 |
| 24/02/2018 | 5.6 |
| 24/02/2018 | 6.2 |
| 24/02/2018 | 6.1 |
| 24/02/2018 | 5.5 |
| 24/02/2018 | 4.3 |
| 24/02/2018 | 4.1 |
| 25/02/2018 | 3.9 |
| 25/02/2018 | 3.4 |
| 25/02/2018 | 3.2 |
| 25/02/2018 | 3.1 |
| 25/02/2018 | 2.8 |
| 25/02/2018 | 2.7 |
| 25/02/2018 | 2.8 |
| 25/02/2018 | 3 |
| 25/02/2018 | 3.6 |
| 25/02/2018 | 3.7 |
| 25/02/2018 | 4.5 |
| 25/02/2018 | 4.7 |
| 25/02/2018 | 4.6 |
| 25/02/2018 | 5 |
| 25/02/2018 | 4.9 |
| 25/02/2018 | 4.9 |
| 25/02/2018 | 4.6 |
| 25/02/2018 | 4.4 |
| 25/02/2018 | 5.1 |
| 25/02/2018 | 5.9 |
| 25/02/2018 | 5.8 |
| 25/02/2018 | 4.9 |
| 25/02/2018 | 4.4 |
| 25/02/2018 | 4.2 |
| 26/02/2018 | 3.8 |
| 26/02/2018 | 3.4 |
| 26/02/2018 | 3.1 |
| 26/02/2018 | 3.1 |
| 26/02/2018 | 3 |
| 26/02/2018 | 3.3 |
| 26/02/2018 | 3.8 |
| 26/02/2018 | 4.5 |
| 26/02/2018 | 5.8 |
| 26/02/2018 | 6.2 |
| 26/02/2018 | 6.4 |
| 26/02/2018 | 6.7 |
| 26/02/2018 | 7 |
| 26/02/2018 | 7 |
| 26/02/2018 | 6.6 |
| 26/02/2018 | 6.7 |
| 26/02/2018 | 6.7 |
| 26/02/2018 | 6.3 |
| 26/02/2018 | 6.9 |
| 26/02/2018 | 7.4 |
| 26/02/2018 | 7.5 |
| 26/02/2018 | 6.2 |
| 26/02/2018 | 5.4 |
| 26/02/2018 | 4.7 |
| 27/02/2018 | 4.1 |
| 27/02/2018 | 3.7 |
| 27/02/2018 | 3.3 |
| 27/02/2018 | 3.2 |
| 27/02/2018 | 3.1 |
| 27/02/2018 | 3.3 |
| 27/02/2018 | 3.7 |
| 27/02/2018 | 4.8 |
| 27/02/2018 | 5.6 |
| 27/02/2018 | 6.1 |
| 27/02/2018 | 6.7 |
| 27/02/2018 | 6.9 |
| 27/02/2018 | 7.2 |
| 27/02/2018 | 7.2 |
| 27/02/2018 | 6.7 |
| 27/02/2018 | 6.8 |
| 27/02/2018 | 6.8 |
| 27/02/2018 | 6.4 |
| 27/02/2018 | 7.1 |
| 27/02/2018 | 7.6 |
| 27/02/2018 | 7.1 |
| 27/02/2018 | 6.4 |
| 27/02/2018 | 5.5 |
| 27/02/2018 | 4.7 |
| 28/02/2018 | 4.1 |
| 28/02/2018 | 3.8 |
| 28/02/2018 | 3.3 |
| 28/02/2018 | 3.2 |
| 28/02/2018 | 3.1 |
| 28/02/2018 | 3.3 |
| 28/02/2018 | 3.8 |
| 28/02/2018 | 4.9 |
| 28/02/2018 | 5.7 |
| 28/02/2018 | 6.1 |
| 28/02/2018 | 6.8 |
| 28/02/2018 | 7 |
| 28/02/2018 | 6.8 |
| 28/02/2018 | 7.2 |
| 28/02/2018 | 6.6 |
| 28/02/2018 | 6.7 |
| 28/02/2018 | 6.8 |
| 28/02/2018 | 6.4 |
| 28/02/2018 | 6.9 |
| 28/02/2018 | 7.8 |
| 28/02/2018 | 7.3 |
| 28/02/2018 | 6.2 |
| 28/02/2018 | 5.4 |
| 28/02/2018 | 4.7 |
| 01/03/2018 | 4.2 |
| 01/03/2018 | 3.8 |
| 01/03/2018 | 3.4 |
| 01/03/2018 | 3.2 |
| 01/03/2018 | 3.1 |
| 01/03/2018 | 3.3 |
| 01/03/2018 | 3.8 |
| 01/03/2018 | 4.8 |
| 01/03/2018 | 5.6 |
| 01/03/2018 | 6 |
| 01/03/2018 | 6.6 |
| 01/03/2018 | 6.8 |
| 01/03/2018 | 7.1 |
| 01/03/2018 | 7.1 |
| 01/03/2018 | 7.1 |
| 01/03/2018 | 6.6 |
| 01/03/2018 | 6.6 |
| 01/03/2018 | 6.7 |
| 01/03/2018 | 6.8 |
| 01/03/2018 | 7.2 |
| 01/03/2018 | 7.3 |
| 01/03/2018 | 6.3 |
| 01/03/2018 | 5.5 |
| 01/03/2018 | 4.8 |
| 02/03/2018 | 4.2 |
| 02/03/2018 | 3.9 |
| 02/03/2018 | 3.4 |
| 02/03/2018 | 3.2 |
| 02/03/2018 | 3.1 |
| 02/03/2018 | 3.3 |
| 02/03/2018 | 3.7 |
| 02/03/2018 | 4.7 |
| 02/03/2018 | 5.4 |
| 02/03/2018 | 6.3 |
| 02/03/2018 | 6.5 |
| 02/03/2018 | 6.7 |
| 02/03/2018 | 7 |
| 02/03/2018 | 6.7 |
| 02/03/2018 | 6.4 |
| 02/03/2018 | 6.3 |
| 02/03/2018 | 6.3 |
| 02/03/2018 | 6.3 |
| 02/03/2018 | 6.5 |
| 02/03/2018 | 7.1 |
| 02/03/2018 | 6.7 |
| 02/03/2018 | 5.9 |
| 02/03/2018 | 5.3 |
| 02/03/2018 | 4.4 |
| 03/03/2018 | 3.8 |
| 03/03/2018 | 3.5 |
| 03/03/2018 | 3.2 |
| 03/03/2018 | 3 |
| 03/03/2018 | 3.2 |
| 03/03/2018 | 3.2 |
| 03/03/2018 | 3.2 |
| 03/03/2018 | 3.4 |
| 03/03/2018 | 4 |
| 03/03/2018 | 4.4 |
| 03/03/2018 | 5.1 |
| 03/03/2018 | 5.6 |
| 03/03/2018 | 5.6 |
| 03/03/2018 | 5.4 |
| 03/03/2018 | 5.2 |
| 03/03/2018 | 5.1 |
| 03/03/2018 | 5.2 |
| 03/03/2018 | 4.8 |
| 03/03/2018 | 5.5 |
| 03/03/2018 | 5.9 |
| 03/03/2018 | 5.6 |
| 03/03/2018 | 5.4 |
| 03/03/2018 | 4.7 |
| 03/03/2018 | 3.9 |
| 04/03/2018 | 3.7 |
| 04/03/2018 | 3.2 |
| 04/03/2018 | 3.1 |
| 04/03/2018 | 2.9 |
| 04/03/2018 | 2.6 |
| 04/03/2018 | 2.6 |
| 04/03/2018 | 2.8 |
| 04/03/2018 | 3.3 |
| 04/03/2018 | 3.3 |
| 04/03/2018 | 4 |
| 04/03/2018 | 4.2 |
| 04/03/2018 | 4.4 |
| 04/03/2018 | 4.8 |
| 04/03/2018 | 4.6 |
| 04/03/2018 | 4.6 |
| 04/03/2018 | 4.5 |
| 04/03/2018 | 4.3 |
| 04/03/2018 | 4.5 |
| 04/03/2018 | 5 |
| 04/03/2018 | 5.1 |
| 04/03/2018 | 5.3 |
| 04/03/2018 | 5.2 |
| 04/03/2018 | 4.3 |
| 04/03/2018 | 4 |
| 05/03/2018 | 3.6 |
| 05/03/2018 | 3.2 |
| 05/03/2018 | 3 |
| 05/03/2018 | 3 |
| 05/03/2018 | 2.9 |
| 05/03/2018 | 3.2 |
| 05/03/2018 | 3.7 |
| 05/03/2018 | 4.8 |
| 05/03/2018 | 5.4 |
| 05/03/2018 | 5.8 |
| 05/03/2018 | 6.6 |
| 05/03/2018 | 6.8 |
| 05/03/2018 | 6.6 |
| 05/03/2018 | 6.6 |
| 05/03/2018 | 6.6 |
| 05/03/2018 | 6.2 |
| 05/03/2018 | 6.2 |
| 05/03/2018 | 6.3 |
| 05/03/2018 | 6.6 |
| 05/03/2018 | 7 |
| 05/03/2018 | 6.9 |
| 05/03/2018 | 6.6 |
| 05/03/2018 | 5.3 |
| 05/03/2018 | 4.5 |
| 06/03/2018 | 3.9 |
| 06/03/2018 | 3.5 |
| 06/03/2018 | 3.1 |
| 06/03/2018 | 3 |
| 06/03/2018 | 2.9 |
| 06/03/2018 | 3.2 |
| 06/03/2018 | 3.6 |
| 06/03/2018 | 4.6 |
| 06/03/2018 | 5.3 |
| 06/03/2018 | 6.2 |
| 06/03/2018 | 6.4 |
| 06/03/2018 | 6.5 |
| 06/03/2018 | 6.8 |
| 06/03/2018 | 6.7 |
| 06/03/2018 | 6.7 |
| 06/03/2018 | 6.8 |
| 06/03/2018 | 6.4 |
| 06/03/2018 | 6.5 |
| 06/03/2018 | 6.8 |
| 06/03/2018 | 7.1 |
| 06/03/2018 | 7 |
| 06/03/2018 | 6.2 |
| 06/03/2018 | 5.4 |
| 06/03/2018 | 4.5 |
| 07/03/2018 | 3.9 |
| 07/03/2018 | 3.6 |
| 07/03/2018 | 3.2 |
| 07/03/2018 | 3.1 |
| 07/03/2018 | 3 |
| 07/03/2018 | 3.2 |
| 07/03/2018 | 3.7 |
| 07/03/2018 | 4.6 |
| 07/03/2018 | 5.3 |
| 07/03/2018 | 6.3 |
| 07/03/2018 | 6.4 |
| 07/03/2018 | 6.6 |
| 07/03/2018 | 6.9 |
| 07/03/2018 | 6.8 |
| 07/03/2018 | 6.7 |
| 07/03/2018 | 6.8 |
| 07/03/2018 | 6.4 |
| 07/03/2018 | 6.4 |
| 07/03/2018 | 6.6 |
| 07/03/2018 | 6.8 |
| 07/03/2018 | 6.8 |
| 07/03/2018 | 6.6 |
| 07/03/2018 | 5.3 |
| 07/03/2018 | 4.5 |
| 08/03/2018 | 3.9 |
| 08/03/2018 | 3.6 |
| 08/03/2018 | 3.2 |
| 08/03/2018 | 3.1 |
| 08/03/2018 | 3 |
| 08/03/2018 | 3.2 |
| 08/03/2018 | 3.7 |
| 08/03/2018 | 4.6 |
| 08/03/2018 | 5.3 |
| 08/03/2018 | 6.2 |
| 08/03/2018 | 6.3 |
| 08/03/2018 | 6.4 |
| 08/03/2018 | 6.7 |
| 08/03/2018 | 6.6 |
| 08/03/2018 | 6.6 |
| 08/03/2018 | 6.7 |
| 08/03/2018 | 6.7 |
| 08/03/2018 | 6.8 |
| 08/03/2018 | 6.5 |
| 08/03/2018 | 6.7 |
| 08/03/2018 | 6.8 |
| 08/03/2018 | 6.6 |
| 08/03/2018 | 5.3 |
| 08/03/2018 | 4.6 |
| 09/03/2018 | 4 |
| 09/03/2018 | 3.7 |
| 09/03/2018 | 3.2 |
| 09/03/2018 | 3.1 |
| 09/03/2018 | 3 |
| 09/03/2018 | 3.2 |
| 09/03/2018 | 3.6 |
| 09/03/2018 | 4.5 |
| 09/03/2018 | 5.5 |
| 09/03/2018 | 6 |
| 09/03/2018 | 6.2 |
| 09/03/2018 | 6.3 |
| 09/03/2018 | 6.5 |
| 09/03/2018 | 6.8 |
| 09/03/2018 | 6.5 |
| 09/03/2018 | 6.4 |
| 09/03/2018 | 6.3 |
| 09/03/2018 | 6.4 |
| 09/03/2018 | 6.3 |
| 09/03/2018 | 6.2 |
| 09/03/2018 | 6.7 |
| 09/03/2018 | 6.2 |
| 09/03/2018 | 5.2 |
| 09/03/2018 | 4.3 |
| 10/03/2018 | 4.1 |
| 10/03/2018 | 3.3 |
| 10/03/2018 | 3 |
| 10/03/2018 | 2.9 |
| 10/03/2018 | 3.1 |
| 10/03/2018 | 3.1 |
| 10/03/2018 | 3.1 |
| 10/03/2018 | 3.2 |
| 10/03/2018 | 3.8 |
| 10/03/2018 | 4.2 |
| 10/03/2018 | 4.8 |
| 10/03/2018 | 5.2 |
| 10/03/2018 | 5.3 |
| 10/03/2018 | 5.1 |
| 10/03/2018 | 5.3 |
| 10/03/2018 | 5.2 |
| 10/03/2018 | 4.8 |
| 10/03/2018 | 4.9 |
| 10/03/2018 | 5.3 |
| 10/03/2018 | 5 |
| 10/03/2018 | 5.6 |
| 10/03/2018 | 5.2 |
| 10/03/2018 | 4.6 |
| 10/03/2018 | 4.3 |
| 11/03/2018 | 3.5 |
| 11/03/2018 | 3.5 |
| 11/03/2018 | 2.9 |
| 11/03/2018 | 2.8 |
| 11/03/2018 | 2.5 |
| 11/03/2018 | 3 |
| 11/03/2018 | 2.7 |
| 11/03/2018 | 3.2 |
| 11/03/2018 | 3.1 |
| 11/03/2018 | 3.8 |
| 11/03/2018 | 4 |
| 11/03/2018 | 4.6 |
| 11/03/2018 | 4.5 |
| 11/03/2018 | 4.8 |
| 11/03/2018 | 4.7 |
| 11/03/2018 | 4.2 |
| 11/03/2018 | 4.4 |
| 11/03/2018 | 4.7 |
| 11/03/2018 | 4.9 |
| 11/03/2018 | 4.8 |
| 11/03/2018 | 4.9 |
| 11/03/2018 | 5.1 |
| 11/03/2018 | 4.6 |
| 11/03/2018 | 4.3 |
| 12/03/2018 | 3.4 |
| 12/03/2018 | 3.5 |
| 12/03/2018 | 2.8 |
| 12/03/2018 | 2.8 |
| 12/03/2018 | 2.8 |
| 12/03/2018 | 3.1 |
| 12/03/2018 | 3.6 |
| 12/03/2018 | 4.5 |
| 12/03/2018 | 5.1 |
| 12/03/2018 | 6 |
| 12/03/2018 | 6.2 |
| 12/03/2018 | 6.4 |
| 12/03/2018 | 6.7 |
| 12/03/2018 | 6.7 |
| 12/03/2018 | 6.2 |
| 12/03/2018 | 6.3 |
| 12/03/2018 | 6.3 |
| 12/03/2018 | 6.3 |
| 12/03/2018 | 6.3 |
| 12/03/2018 | 6.5 |
| 12/03/2018 | 6.8 |
| 12/03/2018 | 6.4 |
| 12/03/2018 | 5.2 |
| 12/03/2018 | 4.8 |
| 13/03/2018 | 4.1 |
| 13/03/2018 | 3.3 |
| 13/03/2018 | 3 |
| 13/03/2018 | 2.9 |
| 13/03/2018 | 2.8 |
| 13/03/2018 | 3.1 |
| 13/03/2018 | 3.5 |
| 13/03/2018 | 4.4 |
| 13/03/2018 | 5.4 |
| 13/03/2018 | 5.9 |
| 13/03/2018 | 6 |
| 13/03/2018 | 6.6 |
| 13/03/2018 | 6.9 |
| 13/03/2018 | 6.8 |
| 13/03/2018 | 6.3 |
| 13/03/2018 | 6.4 |
| 13/03/2018 | 6.4 |
| 13/03/2018 | 6.5 |
| 13/03/2018 | 6.5 |
| 13/03/2018 | 6.2 |
| 13/03/2018 | 6.5 |
| 13/03/2018 | 6.5 |
| 13/03/2018 | 5.3 |
| 13/03/2018 | 4.3 |
| 14/03/2018 | 3.7 |
| 14/03/2018 | 3.4 |
| 14/03/2018 | 3 |
| 14/03/2018 | 2.9 |
| 14/03/2018 | 2.9 |
| 14/03/2018 | 3.1 |
| 14/03/2018 | 3.6 |
| 14/03/2018 | 4.4 |
| 14/03/2018 | 5.5 |
| 14/03/2018 | 6 |
| 14/03/2018 | 6.1 |
| 14/03/2018 | 6.7 |
| 14/03/2018 | 6.4 |
| 14/03/2018 | 6.8 |
| 14/03/2018 | 6.8 |
| 14/03/2018 | 6.4 |
| 14/03/2018 | 6.4 |
| 14/03/2018 | 6.5 |
| 14/03/2018 | 6.3 |
| 14/03/2018 | 6.3 |
| 14/03/2018 | 6.7 |
| 14/03/2018 | 6.4 |
| 14/03/2018 | 5.2 |
| 14/03/2018 | 4.3 |
| 15/03/2018 | 3.7 |
| 15/03/2018 | 3.4 |
| 15/03/2018 | 3 |
| 15/03/2018 | 2.9 |
| 15/03/2018 | 2.9 |
| 15/03/2018 | 3.1 |
| 15/03/2018 | 3.6 |
| 15/03/2018 | 4.4 |
| 15/03/2018 | 5.4 |
| 15/03/2018 | 5.9 |
| 15/03/2018 | 6.4 |
| 15/03/2018 | 6.5 |
| 15/03/2018 | 6.8 |
| 15/03/2018 | 6.7 |
| 15/03/2018 | 6.7 |
| 15/03/2018 | 6.2 |
| 15/03/2018 | 6.2 |
| 15/03/2018 | 6.3 |
| 15/03/2018 | 6.2 |
| 15/03/2018 | 6.3 |
| 15/03/2018 | 6.7 |
| 15/03/2018 | 6.4 |
| 15/03/2018 | 5.2 |
| 15/03/2018 | 4.4 |
| 16/03/2018 | 3.8 |
| 16/03/2018 | 3.5 |
| 16/03/2018 | 3.1 |
| 16/03/2018 | 3 |
| 16/03/2018 | 2.9 |
| 16/03/2018 | 3.1 |
| 16/03/2018 | 3.5 |
| 16/03/2018 | 4.2 |
| 16/03/2018 | 5.2 |
| 16/03/2018 | 5.7 |
| 16/03/2018 | 6.3 |
| 16/03/2018 | 6.4 |
| 16/03/2018 | 6.6 |
| 16/03/2018 | 6.4 |
| 16/03/2018 | 6.6 |
| 16/03/2018 | 6.5 |
| 16/03/2018 | 5.9 |
| 16/03/2018 | 6.4 |
| 16/03/2018 | 6 |
| 16/03/2018 | 5.8 |
| 16/03/2018 | 6.1 |
| 16/03/2018 | 6 |
| 16/03/2018 | 5 |
| 16/03/2018 | 4.6 |
| 17/03/2018 | 3.9 |
| 17/03/2018 | 3.6 |
| 17/03/2018 | 2.9 |
| 17/03/2018 | 2.8 |
| 17/03/2018 | 3 |
| 17/03/2018 | 3 |
| 17/03/2018 | 3.1 |
| 17/03/2018 | 3.5 |
| 17/03/2018 | 3.5 |
| 17/03/2018 | 4.4 |
| 17/03/2018 | 4.6 |
| 17/03/2018 | 4.9 |
| 17/03/2018 | 5.4 |
| 17/03/2018 | 5.2 |
| 17/03/2018 | 4.9 |
| 17/03/2018 | 4.8 |
| 17/03/2018 | 4.9 |
| 17/03/2018 | 5 |
| 17/03/2018 | 4.6 |
| 17/03/2018 | 4.7 |
| 17/03/2018 | 5.2 |
| 17/03/2018 | 5 |
| 17/03/2018 | 4.4 |
| 17/03/2018 | 4.1 |
| 18/03/2018 | 3.8 |
| 18/03/2018 | 3.3 |
| 18/03/2018 | 2.8 |
| 18/03/2018 | 2.7 |
| 18/03/2018 | 2.9 |
| 18/03/2018 | 2.9 |
| 18/03/2018 | 2.6 |
| 18/03/2018 | 3 |
| 18/03/2018 | 3.4 |
| 18/03/2018 | 3.6 |
| 18/03/2018 | 4.2 |
| 18/03/2018 | 4.3 |
| 18/03/2018 | 4.2 |
| 18/03/2018 | 4.5 |
| 18/03/2018 | 4.4 |
| 18/03/2018 | 4.4 |
| 18/03/2018 | 4.1 |
| 18/03/2018 | 4.3 |
| 18/03/2018 | 4.3 |
| 18/03/2018 | 4 |
| 18/03/2018 | 4.9 |
| 18/03/2018 | 4.9 |
| 18/03/2018 | 4.5 |
| 18/03/2018 | 4.1 |
| 19/03/2018 | 3.7 |
| 19/03/2018 | 3.3 |
| 19/03/2018 | 2.7 |
| 19/03/2018 | 2.7 |
| 19/03/2018 | 2.7 |
| 19/03/2018 | 3 |
| 19/03/2018 | 3.5 |
| 19/03/2018 | 4.3 |
| 19/03/2018 | 5.2 |
| 19/03/2018 | 5.7 |
| 19/03/2018 | 5.9 |
| 19/03/2018 | 6 |
| 19/03/2018 | 6.2 |
| 19/03/2018 | 6.3 |
| 19/03/2018 | 6.3 |
| 19/03/2018 | 6.4 |
| 19/03/2018 | 6.3 |
| 19/03/2018 | 6.4 |
| 19/03/2018 | 6.1 |
| 19/03/2018 | 5.6 |
| 19/03/2018 | 6.3 |
| 19/03/2018 | 6.2 |
| 19/03/2018 | 5.5 |
| 19/03/2018 | 4.6 |
| 20/03/2018 | 3.9 |
| 20/03/2018 | 3.1 |
| 20/03/2018 | 2.8 |
| 20/03/2018 | 2.7 |
| 20/03/2018 | 2.7 |
| 20/03/2018 | 3 |
| 20/03/2018 | 3.4 |
| 20/03/2018 | 4.1 |
| 20/03/2018 | 5.1 |
| 20/03/2018 | 5.6 |
| 20/03/2018 | 6.2 |
| 20/03/2018 | 6.2 |
| 20/03/2018 | 6.5 |
| 20/03/2018 | 6.4 |
| 20/03/2018 | 6.4 |
| 20/03/2018 | 6.5 |
| 20/03/2018 | 6 |
| 20/03/2018 | 6.6 |
| 20/03/2018 | 6.2 |
| 20/03/2018 | 5.7 |
| 20/03/2018 | 6.4 |
| 20/03/2018 | 6.3 |
| 20/03/2018 | 5.1 |
| 20/03/2018 | 4.6 |
| 21/03/2018 | 4 |
| 21/03/2018 | 3.2 |
| 21/03/2018 | 2.9 |
| 21/03/2018 | 2.8 |
| 21/03/2018 | 2.7 |
| 21/03/2018 | 3 |
| 21/03/2018 | 3.5 |
| 21/03/2018 | 4.2 |
| 21/03/2018 | 5.1 |
| 21/03/2018 | 5.6 |
| 21/03/2018 | 6.2 |
| 21/03/2018 | 6.3 |
| 21/03/2018 | 6.5 |
| 21/03/2018 | 6.4 |
| 21/03/2018 | 6.4 |
| 21/03/2018 | 6.4 |
| 21/03/2018 | 6.5 |
| 21/03/2018 | 6.5 |
| 21/03/2018 | 6.1 |
| 21/03/2018 | 5.4 |
| 21/03/2018 | 6.2 |
| 21/03/2018 | 6.2 |
| 21/03/2018 | 5.5 |
| 21/03/2018 | 4.7 |
| 22/03/2018 | 4 |
| 22/03/2018 | 3.2 |
| 22/03/2018 | 2.9 |
| 22/03/2018 | 2.8 |
| 22/03/2018 | 2.7 |
| 22/03/2018 | 3 |
| 22/03/2018 | 3.5 |
| 22/03/2018 | 4.1 |
| 22/03/2018 | 5.1 |
| 22/03/2018 | 5.5 |
| 22/03/2018 | 6.1 |
| 22/03/2018 | 6.1 |
| 22/03/2018 | 6.3 |
| 22/03/2018 | 6.3 |
| 22/03/2018 | 6.3 |
| 22/03/2018 | 6.3 |
| 22/03/2018 | 6.3 |
| 22/03/2018 | 6.4 |
| 22/03/2018 | 6 |
| 22/03/2018 | 5.4 |
| 22/03/2018 | 6.2 |
| 22/03/2018 | 6.2 |
| 22/03/2018 | 5.6 |
| 22/03/2018 | 4.7 |
| 23/03/2018 | 4.1 |
| 23/03/2018 | 3.3 |
| 23/03/2018 | 2.9 |
| 23/03/2018 | 2.8 |
| 23/03/2018 | 2.7 |
| 23/03/2018 | 3 |
| 23/03/2018 | 3.4 |
| 23/03/2018 | 4.5 |
| 23/03/2018 | 4.8 |
| 23/03/2018 | 5.9 |
| 23/03/2018 | 6 |
| 23/03/2018 | 6 |
| 23/03/2018 | 6.2 |
| 23/03/2018 | 6.5 |
| 23/03/2018 | 6.2 |
| 23/03/2018 | 6 |
| 23/03/2018 | 5.9 |
| 23/03/2018 | 6.5 |
| 23/03/2018 | 5.8 |
| 23/03/2018 | 5.4 |
| 23/03/2018 | 5.6 |
| 23/03/2018 | 5.8 |
| 23/03/2018 | 4.9 |
| 23/03/2018 | 4.4 |
| 24/03/2018 | 3.6 |
| 24/03/2018 | 3.4 |
| 24/03/2018 | 3.2 |
| 24/03/2018 | 2.6 |
| 24/03/2018 | 2.9 |
| 24/03/2018 | 2.9 |
| 24/03/2018 | 3 |
| 24/03/2018 | 3.4 |
| 24/03/2018 | 3.7 |
| 24/03/2018 | 4.2 |
| 24/03/2018 | 4.8 |
| 24/03/2018 | 5.1 |
| 24/03/2018 | 5.1 |
| 24/03/2018 | 4.9 |
| 24/03/2018 | 5.1 |
| 24/03/2018 | 5 |
| 24/03/2018 | 4.6 |
| 24/03/2018 | 5.2 |
| 24/03/2018 | 4.5 |
| 24/03/2018 | 3.9 |
| 24/03/2018 | 4.7 |
| 24/03/2018 | 5.4 |
| 24/03/2018 | 4.3 |
| 24/03/2018 | 3.9 |
| 25/03/2018 | 3.6 |
| 25/03/2018 | 3.9 |
| 25/03/2018 | 3.2 |
| 25/03/2018 | 0 |
| 25/03/2018 | 2.7 |
| 25/03/2018 | 2.7 |
| 25/03/2018 | 2.9 |
| 25/03/2018 | 3.2 |
| 25/03/2018 | 3.7 |
| 25/03/2018 | 3.9 |
| 25/03/2018 | 4.2 |
| 25/03/2018 | 4.9 |
| 25/03/2018 | 4.8 |
| 25/03/2018 | 5.2 |
| 25/03/2018 | 5.1 |
| 25/03/2018 | 4.9 |
| 25/03/2018 | 4.6 |
| 25/03/2018 | 4.3 |
| 25/03/2018 | 4.7 |
| 25/03/2018 | 5.4 |
| 25/03/2018 | 5.3 |
| 25/03/2018 | 5.3 |
| 25/03/2018 | 4.7 |
| 25/03/2018 | 4.1 |
| 26/03/2018 | 3.9 |
| 26/03/2018 | 3.2 |
| 26/03/2018 | 3 |
| 26/03/2018 | 3 |
| 26/03/2018 | 2.9 |
| 26/03/2018 | 3.1 |
| 26/03/2018 | 3.3 |
| 26/03/2018 | 4.4 |
| 26/03/2018 | 5.4 |
| 26/03/2018 | 5.9 |
| 26/03/2018 | 6.5 |
| 26/03/2018 | 6.4 |
| 26/03/2018 | 6.7 |
| 26/03/2018 | 6.8 |
| 26/03/2018 | 6.2 |
| 26/03/2018 | 6 |
| 26/03/2018 | 5.8 |
| 26/03/2018 | 5.5 |
| 26/03/2018 | 5.7 |
| 26/03/2018 | 6.9 |
| 26/03/2018 | 7.1 |
| 26/03/2018 | 6.4 |
| 26/03/2018 | 5 |
| 26/03/2018 | 4.6 |
| 27/03/2018 | 4 |
| 27/03/2018 | 3.5 |
| 27/03/2018 | 3.1 |
| 27/03/2018 | 3 |
| 27/03/2018 | 2.9 |
| 27/03/2018 | 3.1 |
| 27/03/2018 | 3.7 |
| 27/03/2018 | 4.3 |
| 27/03/2018 | 5.2 |
| 27/03/2018 | 5.8 |
| 27/03/2018 | 6.3 |
| 27/03/2018 | 6.6 |
| 27/03/2018 | 6.9 |
| 27/03/2018 | 6.9 |
| 27/03/2018 | 6.3 |
| 27/03/2018 | 6.6 |
| 27/03/2018 | 6 |
| 27/03/2018 | 5.7 |
| 27/03/2018 | 5.9 |
| 27/03/2018 | 7.1 |
| 27/03/2018 | 6.8 |
| 27/03/2018 | 6 |
| 27/03/2018 | 5.1 |
| 27/03/2018 | 4.7 |
| 28/03/2018 | 4.1 |
| 28/03/2018 | 3.6 |
| 28/03/2018 | 3.2 |
| 28/03/2018 | 3 |
| 28/03/2018 | 2.9 |
| 28/03/2018 | 3.1 |
| 28/03/2018 | 3.8 |
| 28/03/2018 | 4.3 |
| 28/03/2018 | 5.2 |
| 28/03/2018 | 5.8 |
| 28/03/2018 | 6.3 |
| 28/03/2018 | 6.7 |
| 28/03/2018 | 6.9 |
| 28/03/2018 | 6.9 |
| 28/03/2018 | 6.8 |
| 28/03/2018 | 6.5 |
| 28/03/2018 | 5.9 |
| 28/03/2018 | 5.6 |
| 28/03/2018 | 5.7 |
| 28/03/2018 | 6.8 |
| 28/03/2018 | 7 |
| 28/03/2018 | 6.4 |
| 28/03/2018 | 5.1 |
| 28/03/2018 | 4.7 |
| 29/03/2018 | 4.1 |
| 29/03/2018 | 3.6 |
| 29/03/2018 | 3.2 |
| 29/03/2018 | 3 |
| 29/03/2018 | 2.9 |
| 29/03/2018 | 3.1 |
| 29/03/2018 | 3.2 |
| 29/03/2018 | 4.3 |
| 29/03/2018 | 5.2 |
| 29/03/2018 | 5.7 |
| 29/03/2018 | 6.2 |
| 29/03/2018 | 6.5 |
| 29/03/2018 | 6.8 |
| 29/03/2018 | 6.8 |
| 29/03/2018 | 6.7 |
| 29/03/2018 | 6.4 |
| 29/03/2018 | 6.3 |
| 29/03/2018 | 6 |
| 29/03/2018 | 5.6 |
| 29/03/2018 | 6.7 |
| 29/03/2018 | 7 |
| 29/03/2018 | 6.4 |
| 29/03/2018 | 5.1 |
| 29/03/2018 | 4.7 |
| 30/03/2018 | 4.1 |
| 30/03/2018 | 3.4 |
| 30/03/2018 | 2.8 |
| 30/03/2018 | 2.7 |
| 30/03/2018 | 2.8 |
| 30/03/2018 | 2.8 |
| 30/03/2018 | 2.8 |
| 30/03/2018 | 2.8 |
| 30/03/2018 | 2.9 |
| 30/03/2018 | 3.9 |
| 30/03/2018 | 4.3 |
| 30/03/2018 | 4.5 |
| 30/03/2018 | 4.7 |
| 30/03/2018 | 4.8 |
| 30/03/2018 | 4.5 |
| 30/03/2018 | 4.1 |
| 30/03/2018 | 4.1 |
| 30/03/2018 | 4.1 |
| 30/03/2018 | 3.7 |
| 30/03/2018 | 4.6 |
| 30/03/2018 | 5.2 |
| 30/03/2018 | 4.8 |
| 30/03/2018 | 4.5 |
| 30/03/2018 | 4.1 |
| 31/03/2018 | 3.9 |
| 31/03/2018 | 3.3 |
| 31/03/2018 | 3 |
| 31/03/2018 | 2.9 |
| 31/03/2018 | 3.1 |
| 31/03/2018 | 3 |
| 31/03/2018 | 2.9 |
| 31/03/2018 | 3.3 |
| 31/03/2018 | 3.8 |
| 31/03/2018 | 4.2 |
| 31/03/2018 | 5 |
| 31/03/2018 | 5.1 |
| 31/03/2018 | 5 |
| 31/03/2018 | 5.5 |
| 31/03/2018 | 5.1 |
| 31/03/2018 | 4.7 |
| 31/03/2018 | 4.7 |
| 31/03/2018 | 4.6 |
| 31/03/2018 | 4.2 |
| 31/03/2018 | 5.2 |
| 31/03/2018 | 5.4 |
| 31/03/2018 | 5.2 |
| 31/03/2018 | 4.4 |
| 31/03/2018 | 4 |
| 01/04/2018 | 3.6 |
| 01/04/2018 | 2.5 |
| 01/04/2018 | 2.7 |
| 01/04/2018 | 2.6 |
| 01/04/2018 | 2.5 |
| 01/04/2018 | 2.4 |
| 01/04/2018 | 2.6 |
| 01/04/2018 | 2.8 |
| 01/04/2018 | 2.2 |
| 01/04/2018 | 2.7 |
| 01/04/2018 | 3.2 |
| 01/04/2018 | 3.3 |
| 01/04/2018 | 3.3 |
| 01/04/2018 | 3.3 |
| 01/04/2018 | 3.1 |
| 01/04/2018 | 3 |
| 01/04/2018 | 3.3 |
| 01/04/2018 | 3.6 |
| 01/04/2018 | 3.7 |
| 01/04/2018 | 4.4 |
| 01/04/2018 | 4.5 |
| 01/04/2018 | 4.3 |
| 01/04/2018 | 3.9 |
| 01/04/2018 | 3.1 |
| 02/04/2018 | 2.8 |
| 02/04/2018 | 2.5 |
| 02/04/2018 | 2.6 |
| 02/04/2018 | 2.6 |
| 02/04/2018 | 2.5 |
| 02/04/2018 | 2.4 |
| 02/04/2018 | 2.6 |
| 02/04/2018 | 2.8 |
| 02/04/2018 | 2.2 |
| 02/04/2018 | 2.6 |
| 02/04/2018 | 3.2 |
| 02/04/2018 | 3.2 |
| 02/04/2018 | 3.3 |
| 02/04/2018 | 3.3 |
| 02/04/2018 | 3.1 |
| 02/04/2018 | 2.9 |
| 02/04/2018 | 3.3 |
| 02/04/2018 | 3.5 |
| 02/04/2018 | 3.6 |
| 02/04/2018 | 4.3 |
| 02/04/2018 | 4.4 |
| 02/04/2018 | 4.3 |
| 02/04/2018 | 3.9 |
| 02/04/2018 | 3.1 |
| 03/04/2018 | 2.8 |
| 03/04/2018 | 3.3 |
| 03/04/2018 | 2.9 |
| 03/04/2018 | 2.8 |
| 03/04/2018 | 2.8 |
| 03/04/2018 | 2.9 |
| 03/04/2018 | 3.6 |
| 03/04/2018 | 4.1 |
| 03/04/2018 | 4.9 |
| 03/04/2018 | 6 |
| 03/04/2018 | 5.9 |
| 03/04/2018 | 6.3 |
| 03/04/2018 | 6.5 |
| 03/04/2018 | 6.5 |
| 03/04/2018 | 6.4 |
| 03/04/2018 | 6.2 |
| 03/04/2018 | 6.1 |
| 03/04/2018 | 5.8 |
| 03/04/2018 | 5.8 |
| 03/04/2018 | 6.3 |
| 03/04/2018 | 6.8 |
| 03/04/2018 | 6.3 |
| 03/04/2018 | 5 |
| 03/04/2018 | 4.5 |
| 04/04/2018 | 3.8 |
| 04/04/2018 | 3.4 |
| 04/04/2018 | 3 |
| 04/04/2018 | 2.9 |
| 04/04/2018 | 2.8 |
| 04/04/2018 | 3 |
| 04/04/2018 | 3.6 |
| 04/04/2018 | 4.1 |
| 04/04/2018 | 4.9 |
| 04/04/2018 | 6.1 |
| 04/04/2018 | 6 |
| 04/04/2018 | 6.4 |
| 04/04/2018 | 6.6 |
| 04/04/2018 | 6.6 |
| 04/04/2018 | 6.4 |
| 04/04/2018 | 6.2 |
| 04/04/2018 | 6.1 |
| 04/04/2018 | 5.8 |
| 04/04/2018 | 5.7 |
| 04/04/2018 | 6.1 |
| 04/04/2018 | 6.6 |
| 04/04/2018 | 6.1 |
| 04/04/2018 | 5.4 |
| 04/04/2018 | 4.5 |
| 05/04/2018 | 3.9 |
| 05/04/2018 | 3.5 |
| 05/04/2018 | 3 |
| 05/04/2018 | 2.9 |
| 05/04/2018 | 2.8 |
| 05/04/2018 | 3 |
| 05/04/2018 | 3.6 |
| 05/04/2018 | 4 |
| 05/04/2018 | 4.9 |
| 05/04/2018 | 6 |
| 05/04/2018 | 6.4 |
| 05/04/2018 | 6.2 |
| 05/04/2018 | 6.4 |
| 05/04/2018 | 6.5 |
| 05/04/2018 | 6.4 |
| 05/04/2018 | 6.1 |
| 05/04/2018 | 6 |
| 05/04/2018 | 5.7 |
| 05/04/2018 | 5.7 |
| 05/04/2018 | 6.1 |
| 05/04/2018 | 6.6 |
| 05/04/2018 | 6.1 |
| 05/04/2018 | 4.9 |
| 05/04/2018 | 4.5 |
| 06/04/2018 | 4 |
| 06/04/2018 | 3.5 |
| 06/04/2018 | 3.1 |
| 06/04/2018 | 2.9 |
| 06/04/2018 | 2.8 |
| 06/04/2018 | 3 |
| 06/04/2018 | 3.6 |
| 06/04/2018 | 3.9 |
| 06/04/2018 | 5.2 |
| 06/04/2018 | 5.9 |
| 06/04/2018 | 6.3 |
| 06/04/2018 | 6.2 |
| 06/04/2018 | 6.3 |
| 06/04/2018 | 6.2 |
| 06/04/2018 | 6.3 |
| 06/04/2018 | 5.9 |
| 06/04/2018 | 5.7 |
| 06/04/2018 | 5.4 |
| 06/04/2018 | 5.2 |
| 06/04/2018 | 5.8 |
| 06/04/2018 | 6.1 |
| 06/04/2018 | 5.7 |
| 06/04/2018 | 4.8 |
| 06/04/2018 | 4.3 |
| 07/04/2018 | 4 |
| 07/04/2018 | 3.8 |
| 07/04/2018 | 3 |
| 07/04/2018 | 2.9 |
| 07/04/2018 | 3.1 |
| 07/04/2018 | 3.1 |
| 07/04/2018 | 3.1 |
| 07/04/2018 | 3.3 |
| 07/04/2018 | 3.9 |
| 07/04/2018 | 4.3 |
| 07/04/2018 | 5 |
| 07/04/2018 | 5.5 |
| 07/04/2018 | 5.4 |
| 07/04/2018 | 5.3 |
| 07/04/2018 | 5.1 |
| 07/04/2018 | 5.3 |
| 07/04/2018 | 4.9 |
| 07/04/2018 | 4.9 |
| 07/04/2018 | 4.7 |
| 07/04/2018 | 4.9 |
| 07/04/2018 | 5.2 |
| 07/04/2018 | 5.4 |
| 07/04/2018 | 4.8 |
| 07/04/2018 | 4.2 |
| 08/04/2018 | 3.6 |
| 08/04/2018 | 3.5 |
| 08/04/2018 | 2.9 |
| 08/04/2018 | 2.8 |
| 08/04/2018 | 2.5 |
| 08/04/2018 | 3 |
| 08/04/2018 | 2.6 |
| 08/04/2018 | 2.9 |
| 08/04/2018 | 3.3 |
| 08/04/2018 | 3.5 |
| 08/04/2018 | 4.3 |
| 08/04/2018 | 4.4 |
| 08/04/2018 | 4.8 |
| 08/04/2018 | 4.7 |
| 08/04/2018 | 4.6 |
| 08/04/2018 | 4.4 |
| 08/04/2018 | 4.6 |
| 08/04/2018 | 4.3 |
| 08/04/2018 | 4.6 |
| 08/04/2018 | 4.4 |
| 08/04/2018 | 4.6 |
| 08/04/2018 | 5.2 |
| 08/04/2018 | 4.9 |
| 08/04/2018 | 4.2 |
| 09/04/2018 | 3.6 |
| 09/04/2018 | 3.5 |
| 09/04/2018 | 2.8 |
| 09/04/2018 | 2.8 |
| 09/04/2018 | 2.8 |
| 09/04/2018 | 3 |
| 09/04/2018 | 3.4 |
| 09/04/2018 | 4.4 |
| 09/04/2018 | 5.4 |
| 09/04/2018 | 5.9 |
| 09/04/2018 | 6.3 |
| 09/04/2018 | 6.5 |
| 09/04/2018 | 6.7 |
| 09/04/2018 | 6.9 |
| 09/04/2018 | 6.5 |
| 09/04/2018 | 6.3 |
| 09/04/2018 | 6.2 |
| 09/04/2018 | 6.1 |
| 09/04/2018 | 5.9 |
| 09/04/2018 | 5.9 |
| 09/04/2018 | 6.4 |
| 09/04/2018 | 6.4 |
| 09/04/2018 | 5.4 |
| 09/04/2018 | 4.7 |
| 10/04/2018 | 4.3 |
| 10/04/2018 | 3.8 |
| 10/04/2018 | 2.9 |
| 10/04/2018 | 2.9 |
| 10/04/2018 | 2.8 |
| 10/04/2018 | 3 |
| 10/04/2018 | 3.8 |
| 10/04/2018 | 4.3 |
| 10/04/2018 | 5.3 |
| 10/04/2018 | 5.8 |
| 10/04/2018 | 6.6 |
| 10/04/2018 | 6.8 |
| 10/04/2018 | 7 |
| 10/04/2018 | 7.1 |
| 10/04/2018 | 6.6 |
| 10/04/2018 | 6.5 |
| 10/04/2018 | 6.4 |
| 10/04/2018 | 6.3 |
| 10/04/2018 | 6.1 |
| 10/04/2018 | 6.1 |
| 10/04/2018 | 6.1 |
| 10/04/2018 | 6.4 |
| 10/04/2018 | 5.5 |
| 10/04/2018 | 4.7 |
| 10/04/2018 | 4.3 |
| 11/04/2018 | 3.4 |
| 11/04/2018 | 3 |
| 11/04/2018 | 2.9 |
| 11/04/2018 | 2.8 |
| 11/04/2018 | 3.1 |
| 11/04/2018 | 3.8 |
| 11/04/2018 | 4.3 |
| 11/04/2018 | 5.3 |
| 11/04/2018 | 5.9 |
| 11/04/2018 | 6.1 |
| 11/04/2018 | 6.9 |
| 11/04/2018 | 6.6 |
| 11/04/2018 | 6.6 |
| 11/04/2018 | 6.6 |
| 11/04/2018 | 6.5 |
| 11/04/2018 | 6.4 |
| 11/04/2018 | 6.3 |
| 11/04/2018 | 6.1 |
| 11/04/2018 | 5.9 |
| 11/04/2018 | 6.4 |
| 11/04/2018 | 6.2 |
| 11/04/2018 | 5.3 |
| 11/04/2018 | 4.7 |
| 11/04/2018 | 3.9 |
| 12/04/2018 | 3.4 |
| 12/04/2018 | 3 |
| 12/04/2018 | 2.9 |
| 12/04/2018 | 2.9 |
| 12/04/2018 | 3.1 |
| 12/04/2018 | 3.8 |
| 12/04/2018 | 4.2 |
| 12/04/2018 | 5.3 |
| 12/04/2018 | 5.8 |
| 12/04/2018 | 6.5 |
| 12/04/2018 | 6.7 |
| 12/04/2018 | 6.9 |
| 12/04/2018 | 7 |
| 12/04/2018 | 6.5 |
| 12/04/2018 | 6.4 |
| 12/04/2018 | 6.3 |
| 12/04/2018 | 6.3 |
| 12/04/2018 | 6.1 |
| 12/04/2018 | 6 |
| 12/04/2018 | 6.4 |
| 12/04/2018 | 6.2 |
| 12/04/2018 | 5.4 |
| 12/04/2018 | 4.8 |
| 12/04/2018 | 3.9 |
| 13/04/2018 | 3.5 |
| 13/04/2018 | 3.1 |
| 13/04/2018 | 2.9 |
| 13/04/2018 | 2.9 |
| 13/04/2018 | 3 |
| 13/04/2018 | 3.8 |
| 13/04/2018 | 4.6 |
| 13/04/2018 | 5.1 |
| 13/04/2018 | 5.7 |
| 13/04/2018 | 6.4 |
| 13/04/2018 | 6.7 |
| 13/04/2018 | 6.8 |
| 13/04/2018 | 6.7 |
| 13/04/2018 | 6.4 |
| 13/04/2018 | 6.2 |
| 13/04/2018 | 6 |
| 13/04/2018 | 6 |
| 13/04/2018 | 6.1 |
| 13/04/2018 | 5.7 |
| 13/04/2018 | 5.9 |
| 13/04/2018 | 5.8 |
| 13/04/2018 | 5.2 |
| 13/04/2018 | 4.5 |
| 13/04/2018 | 4 |
| 14/04/2018 | 3.6 |
| 14/04/2018 | 2.9 |
| 14/04/2018 | 2.8 |
| 14/04/2018 | 3 |
| 14/04/2018 | 3 |
| 14/04/2018 | 2.9 |
| 14/04/2018 | 3.2 |
| 14/04/2018 | 3.7 |
| 14/04/2018 | 4.1 |
| 14/04/2018 | 4.8 |
| 14/04/2018 | 5.3 |
| 14/04/2018 | 5.2 |
| 14/04/2018 | 5.2 |
| 14/04/2018 | 4.9 |
| 14/04/2018 | 5.2 |
| 14/04/2018 | 4.7 |
| 14/04/2018 | 4.8 |
| 14/04/2018 | 4.7 |
| 14/04/2018 | 4.7 |
| 14/04/2018 | 4.8 |
| 14/04/2018 | 4.9 |
| 14/04/2018 | 4.6 |
| 14/04/2018 | 4.1 |
| 14/04/2018 | 4 |
| 15/04/2018 | 3.4 |
| 15/04/2018 | 2.8 |
| 15/04/2018 | 2.7 |
| 15/04/2018 | 2.9 |
| 15/04/2018 | 2.9 |
| 15/04/2018 | 3 |
| 15/04/2018 | 2.7 |
| 15/04/2018 | 3.2 |
| 15/04/2018 | 3.9 |
| 15/04/2018 | 4.1 |
| 15/04/2018 | 4.3 |
| 15/04/2018 | 4.6 |
| 15/04/2018 | 4.5 |
| 15/04/2018 | 4.5 |
| 15/04/2018 | 4.3 |
| 15/04/2018 | 4.5 |
| 15/04/2018 | 4.2 |
| 15/04/2018 | 4.5 |
| 15/04/2018 | 4.2 |
| 15/04/2018 | 4.8 |
| 15/04/2018 | 4.8 |
| 15/04/2018 | 4.7 |
| 15/04/2018 | 4.1 |
| 15/04/2018 | 3.4 |
| 16/04/2018 | 3.4 |
| 16/04/2018 | 2.7 |
| 16/04/2018 | 2.7 |
| 16/04/2018 | 2.7 |
| 16/04/2018 | 2.9 |
| 16/04/2018 | 3.7 |
| 16/04/2018 | 4.2 |
| 16/04/2018 | 5.2 |
| 16/04/2018 | 5.7 |
| 16/04/2018 | 6 |
| 16/04/2018 | 6.3 |
| 16/04/2018 | 6.5 |
| 16/04/2018 | 6.7 |
| 16/04/2018 | 6.3 |
| 16/04/2018 | 6.2 |
| 16/04/2018 | 6.1 |
| 16/04/2018 | 6 |
| 16/04/2018 | 5.9 |
| 16/04/2018 | 6.2 |
| 16/04/2018 | 6 |
| 16/04/2018 | 6.3 |
| 16/04/2018 | 5.1 |
| 16/04/2018 | 4.5 |
| 16/04/2018 | 4.1 |
| 17/04/2018 | 3.6 |
| 17/04/2018 | 2.8 |
| 17/04/2018 | 2.7 |
| 17/04/2018 | 2.7 |
| 17/04/2018 | 2.9 |
| 17/04/2018 | 3.6 |
| 17/04/2018 | 4.5 |
| 17/04/2018 | 5.1 |
| 17/04/2018 | 5.6 |
| 17/04/2018 | 6.3 |
| 17/04/2018 | 6.6 |
| 17/04/2018 | 6.8 |
| 17/04/2018 | 6.9 |
| 17/04/2018 | 6.4 |
| 17/04/2018 | 6.3 |
| 17/04/2018 | 6.3 |
| 17/04/2018 | 6.3 |
| 17/04/2018 | 6.1 |
| 17/04/2018 | 5.9 |
| 17/04/2018 | 6.2 |
| 17/04/2018 | 5.8 |
| 17/04/2018 | 5.2 |
| 17/04/2018 | 4.6 |
| 17/04/2018 | 4.2 |
| 18/04/2018 | 3.2 |
| 18/04/2018 | 2.9 |
| 18/04/2018 | 2.8 |
| 18/04/2018 | 2.7 |
| 18/04/2018 | 2.9 |
| 18/04/2018 | 3.6 |
| 18/04/2018 | 4.6 |
| 18/04/2018 | 5.1 |
| 18/04/2018 | 5.6 |
| 18/04/2018 | 6.4 |
| 18/04/2018 | 6.7 |
| 18/04/2018 | 6.9 |
| 18/04/2018 | 6.9 |
| 18/04/2018 | 6.4 |
| 18/04/2018 | 6.3 |
| 18/04/2018 | 6.3 |
| 18/04/2018 | 6.3 |
| 18/04/2018 | 6.1 |
| 18/04/2018 | 6.2 |
| 18/04/2018 | 6 |
| 18/04/2018 | 6.1 |
| 18/04/2018 | 5.6 |
| 18/04/2018 | 4.6 |
| 18/04/2018 | 4.2 |
| 19/04/2018 | 3.3 |
| 19/04/2018 | 2.9 |
| 19/04/2018 | 2.8 |
| 19/04/2018 | 2.7 |
| 19/04/2018 | 2.9 |
| 19/04/2018 | 3.6 |
| 19/04/2018 | 4.5 |
| 19/04/2018 | 5.1 |
| 19/04/2018 | 6.1 |
| 19/04/2018 | 6.3 |
| 19/04/2018 | 6.5 |
| 19/04/2018 | 6.7 |
| 19/04/2018 | 6.8 |
| 19/04/2018 | 6.4 |
| 19/04/2018 | 6.2 |
| 19/04/2018 | 6.2 |
| 19/04/2018 | 6.2 |
| 19/04/2018 | 6 |
| 19/04/2018 | 5.8 |
| 19/04/2018 | 6 |
| 19/04/2018 | 6.1 |
| 19/04/2018 | 5.1 |
| 19/04/2018 | 4.6 |
| 19/04/2018 | 3.8 |
| 20/04/2018 | 3.3 |
| 20/04/2018 | 2.9 |
| 20/04/2018 | 2.8 |
| 20/04/2018 | 2.7 |
| 20/04/2018 | 2.9 |
| 20/04/2018 | 3.6 |
| 20/04/2018 | 4.4 |
| 20/04/2018 | 4.9 |
| 20/04/2018 | 5.9 |
| 20/04/2018 | 6.2 |
| 20/04/2018 | 6.5 |
| 20/04/2018 | 6.6 |
| 20/04/2018 | 6.5 |
| 20/04/2018 | 6.3 |
| 20/04/2018 | 6 |
| 20/04/2018 | 5.9 |
| 20/04/2018 | 5.9 |
| 20/04/2018 | 6 |
| 20/04/2018 | 5.5 |
| 20/04/2018 | 5.6 |
| 20/04/2018 | 5.7 |
| 20/04/2018 | 5 |
| 20/04/2018 | 4.4 |
| 20/04/2018 | 3.8 |
| 21/04/2018 | 3.4 |
| 21/04/2018 | 3.3 |
| 21/04/2018 | 2.6 |
| 21/04/2018 | 2.9 |
| 21/04/2018 | 2.9 |
| 21/04/2018 | 2.7 |
| 21/04/2018 | 3 |
| 21/04/2018 | 3.6 |
| 21/04/2018 | 4.4 |
| 21/04/2018 | 4.6 |
| 21/04/2018 | 5.1 |
| 21/04/2018 | 5.1 |
| 21/04/2018 | 5 |
| 21/04/2018 | 4.8 |
| 21/04/2018 | 5 |
| 21/04/2018 | 4.6 |
| 21/04/2018 | 4.7 |
| 21/04/2018 | 4.7 |
| 21/04/2018 | 4.5 |
| 21/04/2018 | 4.5 |
| 21/04/2018 | 4.9 |
| 21/04/2018 | 4.4 |
| 21/04/2018 | 3.9 |
| 21/04/2018 | 3.8 |
| 22/04/2018 | 3.2 |
| 22/04/2018 | 2.7 |
| 22/04/2018 | 2.6 |
| 22/04/2018 | 2.8 |
| 22/04/2018 | 2.8 |
| 22/04/2018 | 2.8 |
| 22/04/2018 | 2.6 |
| 22/04/2018 | 3.1 |
| 22/04/2018 | 3.7 |
| 22/04/2018 | 4 |
| 22/04/2018 | 4.1 |
| 22/04/2018 | 4.4 |
| 22/04/2018 | 4.4 |
| 22/04/2018 | 4.3 |
| 22/04/2018 | 4.2 |
| 22/04/2018 | 4.4 |
| 22/04/2018 | 4.2 |
| 22/04/2018 | 4 |
| 22/04/2018 | 4.5 |
| 22/04/2018 | 4.4 |
| 22/04/2018 | 4.8 |
| 22/04/2018 | 4.4 |
| 22/04/2018 | 4 |
| 22/04/2018 | 3.8 |
| 23/04/2018 | 3.2 |
| 23/04/2018 | 3.1 |
| 23/04/2018 | 2.6 |
| 23/04/2018 | 2.6 |
| 23/04/2018 | 2.8 |
| 23/04/2018 | 3.5 |
| 23/04/2018 | 4 |
| 23/04/2018 | 5 |
| 23/04/2018 | 5.5 |
| 23/04/2018 | 5.8 |
| 23/04/2018 | 6.1 |
| 23/04/2018 | 6.3 |
| 23/04/2018 | 6.5 |
| 23/04/2018 | 6.1 |
| 23/04/2018 | 6 |
| 23/04/2018 | 5.9 |
| 23/04/2018 | 5.9 |
| 23/04/2018 | 5.8 |
| 23/04/2018 | 6 |
| 23/04/2018 | 5.7 |
| 23/04/2018 | 5.7 |
| 23/04/2018 | 5.3 |
| 23/04/2018 | 4.4 |
| 23/04/2018 | 3.9 |
| 24/04/2018 | 3.5 |
| 24/04/2018 | 3.2 |
| 24/04/2018 | 2.6 |
| 24/04/2018 | 2.6 |
| 24/04/2018 | 2.8 |
| 24/04/2018 | 3.4 |
| 24/04/2018 | 4.3 |
| 24/04/2018 | 4.9 |
| 24/04/2018 | 5.9 |
| 24/04/2018 | 6.1 |
| 24/04/2018 | 6.3 |
| 24/04/2018 | 6.6 |
| 24/04/2018 | 6.7 |
| 24/04/2018 | 6.2 |
| 24/04/2018 | 6.1 |
| 24/04/2018 | 6.1 |
| 24/04/2018 | 6.2 |
| 24/04/2018 | 6.1 |
| 24/04/2018 | 5.7 |
| 24/04/2018 | 5.8 |
| 24/04/2018 | 5.8 |
| 24/04/2018 | 5.4 |
| 24/04/2018 | 4.5 |
| 24/04/2018 | 4 |
| 25/04/2018 | 3.1 |
| 25/04/2018 | 2.8 |
| 25/04/2018 | 2.7 |
| 25/04/2018 | 2.6 |
| 25/04/2018 | 2.8 |
| 25/04/2018 | 3.4 |
| 25/04/2018 | 4.3 |
| 25/04/2018 | 4.9 |
| 25/04/2018 | 5.9 |
| 25/04/2018 | 6.2 |
| 25/04/2018 | 6.5 |
| 25/04/2018 | 6.7 |
| 25/04/2018 | 6.7 |
| 25/04/2018 | 6.2 |
| 25/04/2018 | 6.1 |
| 25/04/2018 | 6.1 |
| 25/04/2018 | 6.2 |
| 25/04/2018 | 6 |
| 25/04/2018 | 6 |
| 25/04/2018 | 5.6 |
| 25/04/2018 | 5.6 |
| 25/04/2018 | 5.3 |
| 25/04/2018 | 4.5 |
| 25/04/2018 | 4 |
| 26/04/2018 | 3.1 |
| 26/04/2018 | 2.8 |
| 26/04/2018 | 2.7 |
| 26/04/2018 | 2.6 |
| 26/04/2018 | 2.8 |
| 26/04/2018 | 3.4 |
| 26/04/2018 | 4.3 |
| 26/04/2018 | 4.9 |
| 26/04/2018 | 5.8 |
| 26/04/2018 | 6.1 |
| 26/04/2018 | 6.3 |
| 26/04/2018 | 6.5 |
| 26/04/2018 | 6.6 |
| 26/04/2018 | 6.2 |
| 26/04/2018 | 6.1 |
| 26/04/2018 | 6 |
| 26/04/2018 | 6.1 |
| 26/04/2018 | 6 |
| 26/04/2018 | 6.1 |
| 26/04/2018 | 5.6 |
| 26/04/2018 | 5.5 |
| 26/04/2018 | 5.3 |
| 26/04/2018 | 4.5 |
| 26/04/2018 | 3.6 |
| 27/04/2018 | 3.2 |
| 27/04/2018 | 2.8 |
| 27/04/2018 | 2.7 |
| 27/04/2018 | 2.6 |
| 27/04/2018 | 2.8 |
| 27/04/2018 | 3.4 |
| 27/04/2018 | 4.2 |
| 27/04/2018 | 5.2 |
| 27/04/2018 | 5.7 |
| 27/04/2018 | 6 |
| 27/04/2018 | 6.3 |
| 27/04/2018 | 6.4 |
| 27/04/2018 | 6.3 |
| 27/04/2018 | 6.1 |
| 27/04/2018 | 5.8 |
| 27/04/2018 | 5.7 |
| 27/04/2018 | 5.8 |
| 27/04/2018 | 5.5 |
| 27/04/2018 | 5.8 |
| 27/04/2018 | 5.2 |
| 27/04/2018 | 5.2 |
| 27/04/2018 | 4.7 |
| 27/04/2018 | 4.2 |
| 27/04/2018 | 3.7 |
| 28/04/2018 | 3.3 |
| 28/04/2018 | 3.1 |
| 28/04/2018 | 2.5 |
| 28/04/2018 | 2.8 |
| 28/04/2018 | 2.8 |
| 28/04/2018 | 2.6 |
| 28/04/2018 | 2.9 |
| 28/04/2018 | 3.4 |
| 28/04/2018 | 4.3 |
| 28/04/2018 | 4.5 |
| 28/04/2018 | 4.9 |
| 28/04/2018 | 4.9 |
| 28/04/2018 | 4.8 |
| 28/04/2018 | 5.1 |
| 28/04/2018 | 4.9 |
| 28/04/2018 | 4.5 |
| 28/04/2018 | 4.7 |
| 28/04/2018 | 4.6 |
| 28/04/2018 | 4.3 |
| 28/04/2018 | 4.7 |
| 28/04/2018 | 4.4 |
| 28/04/2018 | 4.2 |
| 28/04/2018 | 3.8 |
| 28/04/2018 | 3.7 |
| 29/04/2018 | 3.1 |
| 29/04/2018 | 3 |
| 29/04/2018 | 2.5 |
| 29/04/2018 | 2.7 |
| 29/04/2018 | 2.7 |
| 29/04/2018 | 2.7 |
| 29/04/2018 | 2.5 |
| 29/04/2018 | 2.9 |
| 29/04/2018 | 3.6 |
| 29/04/2018 | 3.8 |
| 29/04/2018 | 3.9 |
| 29/04/2018 | 4.3 |
| 29/04/2018 | 4.2 |
| 29/04/2018 | 4.2 |
| 29/04/2018 | 4.1 |
| 29/04/2018 | 4.2 |
| 29/04/2018 | 4.1 |
| 29/04/2018 | 4 |
| 29/04/2018 | 4.4 |
| 29/04/2018 | 4.1 |
| 29/04/2018 | 4.3 |
| 29/04/2018 | 4.2 |
| 29/04/2018 | 3.9 |
| 29/04/2018 | 3.6 |
| 30/04/2018 | 3.3 |
| 30/04/2018 | 3.1 |
| 30/04/2018 | 2.6 |
| 30/04/2018 | 3 |
| 30/04/2018 | 3 |
| 30/04/2018 | 2.9 |
| 30/04/2018 | 3.6 |
| 30/04/2018 | 4.7 |
| 30/04/2018 | 5.4 |
| 30/04/2018 | 5.7 |
| 30/04/2018 | 5.7 |
| 30/04/2018 | 5.9 |
| 30/04/2018 | 5.9 |
| 30/04/2018 | 5.9 |
| 30/04/2018 | 5.8 |
| 30/04/2018 | 5.7 |
| 30/04/2018 | 5.9 |
| 30/04/2018 | 5.9 |
| 30/04/2018 | 5.6 |
| 30/04/2018 | 5 |
| 30/04/2018 | 4.7 |
| 30/04/2018 | 4.6 |
| 30/04/2018 | 4.2 |
| 30/04/2018 | 3.9 |
| 01/05/2018 | 2.8 |
| 01/05/2018 | 2.8 |
| 01/05/2018 | 2.8 |
| 01/05/2018 | 2.5 |
| 01/05/2018 | 2.5 |
| 01/05/2018 | 2.4 |
| 01/05/2018 | 2.8 |
| 01/05/2018 | 3 |
| 01/05/2018 | 3.4 |
| 01/05/2018 | 4.2 |
| 01/05/2018 | 4.3 |
| 01/05/2018 | 4.4 |
| 01/05/2018 | 4.1 |
| 01/05/2018 | 4.4 |
| 01/05/2018 | 4.1 |
| 01/05/2018 | 4.2 |
| 01/05/2018 | 4.1 |
| 01/05/2018 | 4 |
| 01/05/2018 | 4.1 |
| 01/05/2018 | 3.8 |
| 01/05/2018 | 4.3 |
| 01/05/2018 | 4.1 |
| 01/05/2018 | 3.8 |
| 01/05/2018 | 3.4 |
| 02/05/2018 | 3.4 |
| 02/05/2018 | 2.6 |
| 02/05/2018 | 2.6 |
| 02/05/2018 | 2.5 |
| 02/05/2018 | 2.7 |
| 02/05/2018 | 3.2 |
| 02/05/2018 | 4.1 |
| 02/05/2018 | 5.2 |
| 02/05/2018 | 5.7 |
| 02/05/2018 | 6 |
| 02/05/2018 | 6.3 |
| 02/05/2018 | 6.5 |
| 02/05/2018 | 6.5 |
| 02/05/2018 | 6.1 |
| 02/05/2018 | 6 |
| 02/05/2018 | 6 |
| 02/05/2018 | 6.1 |
| 02/05/2018 | 6 |
| 02/05/2018 | 5.8 |
| 02/05/2018 | 5.7 |
| 02/05/2018 | 5.5 |
| 02/05/2018 | 5.1 |
| 02/05/2018 | 4.3 |
| 02/05/2018 | 3.9 |
| 03/05/2018 | 2.9 |
| 03/05/2018 | 2.6 |
| 03/05/2018 | 2.6 |
| 03/05/2018 | 2.5 |
| 03/05/2018 | 2.7 |
| 03/05/2018 | 3.2 |
| 03/05/2018 | 4.1 |
| 03/05/2018 | 4.7 |
| 03/05/2018 | 5.6 |
| 03/05/2018 | 5.8 |
| 03/05/2018 | 6.1 |
| 03/05/2018 | 6.3 |
| 03/05/2018 | 6.5 |
| 03/05/2018 | 6.5 |
| 03/05/2018 | 5.9 |
| 03/05/2018 | 5.9 |
| 03/05/2018 | 6 |
| 03/05/2018 | 6 |
| 03/05/2018 | 5.8 |
| 03/05/2018 | 5.7 |
| 03/05/2018 | 5 |
| 03/05/2018 | 5.1 |
| 03/05/2018 | 4.4 |
| 03/05/2018 | 3.9 |
| 04/05/2018 | 3 |
| 04/05/2018 | 2.7 |
| 04/05/2018 | 2.6 |
| 04/05/2018 | 2.5 |
| 04/05/2018 | 2.7 |
| 04/05/2018 | 3.2 |
| 04/05/2018 | 4 |
| 04/05/2018 | 5 |
| 04/05/2018 | 5.5 |
| 04/05/2018 | 5.8 |
| 04/05/2018 | 6 |
| 04/05/2018 | 6.2 |
| 04/05/2018 | 6.2 |
| 04/05/2018 | 5.9 |
| 04/05/2018 | 5.7 |
| 04/05/2018 | 5.6 |
| 04/05/2018 | 5.7 |
| 04/05/2018 | 5.5 |
| 04/05/2018 | 5.6 |
| 04/05/2018 | 5.3 |
| 04/05/2018 | 5.1 |
| 04/05/2018 | 5 |
| 04/05/2018 | 4.1 |
| 04/05/2018 | 3.5 |
| 05/05/2018 | 3.1 |
| 05/05/2018 | 3 |
| 05/05/2018 | 2.9 |
| 05/05/2018 | 2.7 |
| 05/05/2018 | 2.7 |
| 05/05/2018 | 2.9 |
| 05/05/2018 | 3.2 |
| 05/05/2018 | 3.3 |
| 05/05/2018 | 4.1 |
| 05/05/2018 | 4.3 |
| 05/05/2018 | 4.7 |
| 05/05/2018 | 4.7 |
| 05/05/2018 | 4.7 |
| 05/05/2018 | 5 |
| 05/05/2018 | 4.8 |
| 05/05/2018 | 4.4 |
| 05/05/2018 | 4.6 |
| 05/05/2018 | 4.6 |
| 05/05/2018 | 4.6 |
| 05/05/2018 | 4.3 |
| 05/05/2018 | 4.4 |
| 05/05/2018 | 4.4 |
| 05/05/2018 | 3.7 |
| 05/05/2018 | 3.5 |
| 06/05/2018 | 2.9 |
| 06/05/2018 | 2.9 |
| 06/05/2018 | 2.4 |
| 06/05/2018 | 2.6 |
| 06/05/2018 | 2.6 |
| 06/05/2018 | 2.5 |
| 06/05/2018 | 2.8 |
| 06/05/2018 | 2.8 |
| 06/05/2018 | 3.4 |
| 06/05/2018 | 3.6 |
| 06/05/2018 | 3.8 |
| 06/05/2018 | 4.1 |
| 06/05/2018 | 4.1 |
| 06/05/2018 | 4.1 |
| 06/05/2018 | 3.9 |
| 06/05/2018 | 4.1 |
| 06/05/2018 | 4 |
| 06/05/2018 | 4 |
| 06/05/2018 | 4.2 |
| 06/05/2018 | 3.8 |
| 06/05/2018 | 3.8 |
| 06/05/2018 | 4 |
| 06/05/2018 | 3.8 |
| 06/05/2018 | 3.5 |
| 07/05/2018 | 2.9 |
| 07/05/2018 | 2.8 |
| 07/05/2018 | 2.4 |
| 07/05/2018 | 2.4 |
| 07/05/2018 | 2.6 |
| 07/05/2018 | 3.1 |
| 07/05/2018 | 4.1 |
| 07/05/2018 | 4.6 |
| 07/05/2018 | 5.6 |
| 07/05/2018 | 5.9 |
| 07/05/2018 | 6.2 |
| 07/05/2018 | 5.9 |
| 07/05/2018 | 6.1 |
| 07/05/2018 | 5.7 |
| 07/05/2018 | 5.7 |
| 07/05/2018 | 5.7 |
| 07/05/2018 | 5.7 |
| 07/05/2018 | 5.8 |
| 07/05/2018 | 5.6 |
| 07/05/2018 | 5.4 |
| 07/05/2018 | 5.1 |
| 07/05/2018 | 4.8 |
| 07/05/2018 | 4.1 |
| 07/05/2018 | 3.6 |
| 08/05/2018 | 3.2 |
| 08/05/2018 | 2.9 |
| 08/05/2018 | 2.4 |
| 08/05/2018 | 2.9 |
| 08/05/2018 | 3.1 |
| 08/05/2018 | 3 |
| 08/05/2018 | 3.9 |
| 08/05/2018 | 4.9 |
| 08/05/2018 | 5.4 |
| 08/05/2018 | 5.7 |
| 08/05/2018 | 5.9 |
| 08/05/2018 | 6.2 |
| 08/05/2018 | 6.3 |
| 08/05/2018 | 5.9 |
| 08/05/2018 | 5.8 |
| 08/05/2018 | 5.8 |
| 08/05/2018 | 6 |
| 08/05/2018 | 6 |
| 08/05/2018 | 5.8 |
| 08/05/2018 | 5.5 |
| 08/05/2018 | 5.1 |
| 08/05/2018 | 4.9 |
| 08/05/2018 | 4.2 |
| 08/05/2018 | 3.7 |
| 09/05/2018 | 3.3 |
| 09/05/2018 | 3 |
| 09/05/2018 | 2.5 |
| 09/05/2018 | 2.9 |
| 09/05/2018 | 3.1 |
| 09/05/2018 | 3.1 |
| 09/05/2018 | 3.9 |
| 09/05/2018 | 5 |
| 09/05/2018 | 5.5 |
| 09/05/2018 | 5.7 |
| 09/05/2018 | 6 |
| 09/05/2018 | 6.3 |
| 09/05/2018 | 6.4 |
| 09/05/2018 | 5.9 |
| 09/05/2018 | 5.8 |
| 09/05/2018 | 5.9 |
| 09/05/2018 | 6 |
| 09/05/2018 | 6 |
| 09/05/2018 | 5.6 |
| 09/05/2018 | 5.3 |
| 09/05/2018 | 4.9 |
| 09/05/2018 | 4.8 |
| 09/05/2018 | 4.2 |
| 09/05/2018 | 3.7 |
| 10/05/2018 | 2.7 |
| 10/05/2018 | 2.7 |
| 10/05/2018 | 2.6 |
| 10/05/2018 | 2.4 |
| 10/05/2018 | 2.3 |
| 10/05/2018 | 2.2 |
| 10/05/2018 | 2.6 |
| 10/05/2018 | 2.8 |
| 10/05/2018 | 3.2 |
| 10/05/2018 | 4 |
| 10/05/2018 | 4.1 |
| 10/05/2018 | 4.2 |
| 10/05/2018 | 4.4 |
| 10/05/2018 | 4.2 |
| 10/05/2018 | 4 |
| 10/05/2018 | 4.1 |
| 10/05/2018 | 4 |
| 10/05/2018 | 4 |
| 10/05/2018 | 3.9 |
| 10/05/2018 | 3.9 |
| 10/05/2018 | 3.7 |
| 10/05/2018 | 3.8 |
| 10/05/2018 | 3.7 |
| 10/05/2018 | 3.2 |
| 11/05/2018 | 3.1 |
| 11/05/2018 | 2.9 |
| 11/05/2018 | 2.5 |
| 11/05/2018 | 2.8 |
| 11/05/2018 | 2.8 |
| 11/05/2018 | 3.2 |
| 11/05/2018 | 3.8 |
| 11/05/2018 | 4.4 |
| 11/05/2018 | 5.1 |
| 11/05/2018 | 5.4 |
| 11/05/2018 | 5.4 |
| 11/05/2018 | 5.7 |
| 11/05/2018 | 5.7 |
| 11/05/2018 | 5.7 |
| 11/05/2018 | 5.5 |
| 11/05/2018 | 5.5 |
| 11/05/2018 | 5.7 |
| 11/05/2018 | 5.9 |
| 11/05/2018 | 5.8 |
| 11/05/2018 | 5 |
| 11/05/2018 | 4.4 |
| 11/05/2018 | 4.8 |
| 11/05/2018 | 4 |
| 11/05/2018 | 3.7 |
| 12/05/2018 | 3 |
| 12/05/2018 | 2.9 |
| 12/05/2018 | 2.8 |
| 12/05/2018 | 2.6 |
| 12/05/2018 | 2.6 |
| 12/05/2018 | 2.7 |
| 12/05/2018 | 3 |
| 12/05/2018 | 3.6 |
| 12/05/2018 | 3.9 |
| 12/05/2018 | 4.6 |
| 12/05/2018 | 4.6 |
| 12/05/2018 | 4.5 |
| 12/05/2018 | 5 |
| 12/05/2018 | 4.8 |
| 12/05/2018 | 4.6 |
| 12/05/2018 | 4.3 |
| 12/05/2018 | 4.5 |
| 12/05/2018 | 4.6 |
| 12/05/2018 | 4.5 |
| 12/05/2018 | 4 |
| 12/05/2018 | 3.9 |
| 12/05/2018 | 4.2 |
| 12/05/2018 | 3.6 |
| 12/05/2018 | 3.4 |
| 13/05/2018 | 2.8 |
| 13/05/2018 | 2.8 |
| 13/05/2018 | 2.3 |
| 13/05/2018 | 2.5 |
| 13/05/2018 | 2.5 |
| 13/05/2018 | 2.4 |
| 13/05/2018 | 2.7 |
| 13/05/2018 | 2.7 |
| 13/05/2018 | 3.3 |
| 13/05/2018 | 3.5 |
| 13/05/2018 | 4.1 |
| 13/05/2018 | 4 |
| 13/05/2018 | 3.9 |
| 13/05/2018 | 3.9 |
| 13/05/2018 | 3.8 |
| 13/05/2018 | 4 |
| 13/05/2018 | 4 |
| 13/05/2018 | 4 |
| 13/05/2018 | 4 |
| 13/05/2018 | 4 |
| 13/05/2018 | 3.9 |
| 13/05/2018 | 4.3 |
| 13/05/2018 | 3.7 |
| 13/05/2018 | 3.3 |
| 14/05/2018 | 2.8 |
| 14/05/2018 | 2.7 |
| 14/05/2018 | 2.3 |
| 14/05/2018 | 2.3 |
| 14/05/2018 | 2.5 |
| 14/05/2018 | 2.9 |
| 14/05/2018 | 3.9 |
| 14/05/2018 | 4.9 |
| 14/05/2018 | 5.3 |
| 14/05/2018 | 5.7 |
| 14/05/2018 | 6 |
| 14/05/2018 | 5.7 |
| 14/05/2018 | 5.9 |
| 14/05/2018 | 5.6 |
| 14/05/2018 | 5.5 |
| 14/05/2018 | 5.5 |
| 14/05/2018 | 5.7 |
| 14/05/2018 | 5.8 |
| 14/05/2018 | 5.3 |
| 14/05/2018 | 5 |
| 14/05/2018 | 4.5 |
| 14/05/2018 | 4.6 |
| 14/05/2018 | 4 |
| 14/05/2018 | 3.5 |
| 15/05/2018 | 3 |
| 15/05/2018 | 2.8 |
| 15/05/2018 | 2.8 |
| 15/05/2018 | 2.8 |
| 15/05/2018 | 3 |
| 15/05/2018 | 2.8 |
| 15/05/2018 | 3.7 |
| 15/05/2018 | 4.7 |
| 15/05/2018 | 5.2 |
| 15/05/2018 | 5.5 |
| 15/05/2018 | 5.7 |
| 15/05/2018 | 6 |
| 15/05/2018 | 6.1 |
| 15/05/2018 | 5.7 |
| 15/05/2018 | 5.7 |
| 15/05/2018 | 5.7 |
| 15/05/2018 | 5.9 |
| 15/05/2018 | 6 |
| 15/05/2018 | 5.6 |
| 15/05/2018 | 5.1 |
| 15/05/2018 | 4.6 |
| 15/05/2018 | 4.7 |
| 15/05/2018 | 4.1 |
| 15/05/2018 | 3.5 |
| 16/05/2018 | 3.1 |
| 16/05/2018 | 2.9 |
| 16/05/2018 | 2.4 |
| 16/05/2018 | 2.8 |
| 16/05/2018 | 3 |
| 16/05/2018 | 2.9 |
| 16/05/2018 | 3.7 |
| 16/05/2018 | 4.8 |
| 16/05/2018 | 5.3 |
| 16/05/2018 | 5.5 |
| 16/05/2018 | 5.8 |
| 16/05/2018 | 6.1 |
| 16/05/2018 | 6.2 |
| 16/05/2018 | 5.7 |
| 16/05/2018 | 5.6 |
| 16/05/2018 | 5.7 |
| 16/05/2018 | 5.9 |
| 16/05/2018 | 6 |
| 16/05/2018 | 5.4 |
| 16/05/2018 | 4.9 |
| 16/05/2018 | 4.4 |
| 16/05/2018 | 4.6 |
| 16/05/2018 | 4.1 |
| 16/05/2018 | 3.6 |
| 17/05/2018 | 3.1 |
| 17/05/2018 | 2.9 |
| 17/05/2018 | 2.4 |
| 17/05/2018 | 2.8 |
| 17/05/2018 | 3 |
| 17/05/2018 | 2.8 |
| 17/05/2018 | 3.7 |
| 17/05/2018 | 4.8 |
| 17/05/2018 | 5.2 |
| 17/05/2018 | 5.9 |
| 17/05/2018 | 5.7 |
| 17/05/2018 | 5.9 |
| 17/05/2018 | 6.1 |
| 17/05/2018 | 6.1 |
| 17/05/2018 | 5.6 |
| 17/05/2018 | 5.6 |
| 17/05/2018 | 5.8 |
| 17/05/2018 | 6 |
| 17/05/2018 | 5.4 |
| 17/05/2018 | 5 |
| 17/05/2018 | 4.4 |
| 17/05/2018 | 4.6 |
| 17/05/2018 | 4.1 |
| 17/05/2018 | 3.6 |
| 18/05/2018 | 2.7 |
| 18/05/2018 | 2.4 |
| 18/05/2018 | 2.4 |
| 18/05/2018 | 2.8 |
| 18/05/2018 | 3 |
| 18/05/2018 | 2.8 |
| 18/05/2018 | 3.6 |
| 18/05/2018 | 4.6 |
| 18/05/2018 | 5.1 |
| 18/05/2018 | 5.8 |
| 18/05/2018 | 5.6 |
| 18/05/2018 | 5.8 |
| 18/05/2018 | 5.8 |
| 18/05/2018 | 5.6 |
| 18/05/2018 | 5.4 |
| 18/05/2018 | 5.3 |
| 18/05/2018 | 5.5 |
| 18/05/2018 | 5.5 |
| 18/05/2018 | 5.2 |
| 18/05/2018 | 4.6 |
| 18/05/2018 | 4.1 |
| 18/05/2018 | 4.5 |
| 18/05/2018 | 3.9 |
| 18/05/2018 | 3.2 |
| 19/05/2018 | 2.9 |
| 19/05/2018 | 2.8 |
| 19/05/2018 | 2.7 |
| 19/05/2018 | 2.5 |
| 19/05/2018 | 2.5 |
| 19/05/2018 | 2.6 |
| 19/05/2018 | 2.9 |
| 19/05/2018 | 3.5 |
| 19/05/2018 | 3.8 |
| 19/05/2018 | 4.4 |
| 19/05/2018 | 4.4 |
| 19/05/2018 | 4.9 |
| 19/05/2018 | 4.9 |
| 19/05/2018 | 4.7 |
| 19/05/2018 | 4.5 |
| 19/05/2018 | 4.2 |
| 19/05/2018 | 4.4 |
| 19/05/2018 | 4.6 |
| 19/05/2018 | 4.3 |
| 19/05/2018 | 3.8 |
| 19/05/2018 | 3.5 |
| 19/05/2018 | 4 |
| 19/05/2018 | 3.5 |
| 19/05/2018 | 3.3 |
| 20/05/2018 | 3.1 |
| 20/05/2018 | 2.7 |
| 20/05/2018 | 2.6 |
| 20/05/2018 | 2.4 |
| 20/05/2018 | 2.4 |
| 20/05/2018 | 2.7 |
| 20/05/2018 | 2.6 |
| 20/05/2018 | 2.7 |
| 20/05/2018 | 3.3 |
| 20/05/2018 | 3.4 |
| 20/05/2018 | 4.1 |
| 20/05/2018 | 4.3 |
| 20/05/2018 | 4.6 |
| 20/05/2018 | 4.4 |
| 20/05/2018 | 4.3 |
| 20/05/2018 | 4 |
| 20/05/2018 | 4.3 |
| 20/05/2018 | 4.1 |
| 20/05/2018 | 4.1 |
| 20/05/2018 | 4.1 |
| 20/05/2018 | 3.7 |
| 20/05/2018 | 3.8 |
| 20/05/2018 | 3.5 |
| 20/05/2018 | 3.5 |
| 21/05/2018 | 3.1 |
| 21/05/2018 | 2.7 |
| 21/05/2018 | 2.6 |
| 21/05/2018 | 2.4 |
| 21/05/2018 | 2.4 |
| 21/05/2018 | 2.7 |
| 21/05/2018 | 2.6 |
| 21/05/2018 | 2.7 |
| 21/05/2018 | 3.3 |
| 21/05/2018 | 3.4 |
| 21/05/2018 | 4.1 |
| 21/05/2018 | 4.3 |
| 21/05/2018 | 4.6 |
| 21/05/2018 | 4.4 |
| 21/05/2018 | 4.3 |
| 21/05/2018 | 4 |
| 21/05/2018 | 4.3 |
| 21/05/2018 | 4.1 |
| 21/05/2018 | 4.2 |
| 21/05/2018 | 4.1 |
| 21/05/2018 | 3.7 |
| 21/05/2018 | 3.8 |
| 21/05/2018 | 3.5 |
| 21/05/2018 | 3.5 |
| 22/05/2018 | 2.9 |
| 22/05/2018 | 2.7 |
| 22/05/2018 | 2.2 |
| 22/05/2018 | 2.6 |
| 22/05/2018 | 2.7 |
| 22/05/2018 | 2.9 |
| 22/05/2018 | 3.2 |
| 22/05/2018 | 4.6 |
| 22/05/2018 | 5.2 |
| 22/05/2018 | 5.6 |
| 22/05/2018 | 5.5 |
| 22/05/2018 | 5.8 |
| 22/05/2018 | 5.4 |
| 22/05/2018 | 5.4 |
| 22/05/2018 | 5.2 |
| 22/05/2018 | 5.2 |
| 22/05/2018 | 4.8 |
| 22/05/2018 | 5.2 |
| 22/05/2018 | 5.5 |
| 22/05/2018 | 5.4 |
| 22/05/2018 | 4.3 |
| 22/05/2018 | 4.3 |
| 22/05/2018 | 3.7 |
| 22/05/2018 | 3.4 |
| 23/05/2018 | 3.1 |
| 23/05/2018 | 2.9 |
| 23/05/2018 | 2.9 |
| 23/05/2018 | 2.8 |
| 23/05/2018 | 3 |
| 23/05/2018 | 3.3 |
| 23/05/2018 | 3.7 |
| 23/05/2018 | 4.7 |
| 23/05/2018 | 5.2 |
| 23/05/2018 | 6 |
| 23/05/2018 | 5.8 |
| 23/05/2018 | 6.1 |
| 23/05/2018 | 6.2 |
| 23/05/2018 | 6.2 |
| 23/05/2018 | 5.7 |
| 23/05/2018 | 5.8 |
| 23/05/2018 | 5.9 |
| 23/05/2018 | 6 |
| 23/05/2018 | 5.4 |
| 23/05/2018 | 5.4 |
| 23/05/2018 | 4.8 |
| 23/05/2018 | 4.9 |
| 23/05/2018 | 4.1 |
| 23/05/2018 | 3.6 |
| 24/05/2018 | 3.2 |
| 24/05/2018 | 2.9 |
| 24/05/2018 | 2.4 |
| 24/05/2018 | 2.9 |
| 24/05/2018 | 3 |
| 24/05/2018 | 2.8 |
| 24/05/2018 | 3.6 |
| 24/05/2018 | 4.7 |
| 24/05/2018 | 5.7 |
| 24/05/2018 | 5.9 |
| 24/05/2018 | 6.2 |
| 24/05/2018 | 6 |
| 24/05/2018 | 6.1 |
| 24/05/2018 | 6.2 |
| 24/05/2018 | 5.7 |
| 24/05/2018 | 5.7 |
| 24/05/2018 | 5.9 |
| 24/05/2018 | 6 |
| 24/05/2018 | 5.5 |
| 24/05/2018 | 5.5 |
| 24/05/2018 | 4.8 |
| 24/05/2018 | 5 |
| 24/05/2018 | 4.1 |
| 24/05/2018 | 3.7 |
| 25/05/2018 | 3.3 |
| 25/05/2018 | 3 |
| 25/05/2018 | 2.4 |
| 25/05/2018 | 2.9 |
| 25/05/2018 | 3 |
| 25/05/2018 | 3.3 |
| 25/05/2018 | 4.1 |
| 25/05/2018 | 4.6 |
| 25/05/2018 | 5.6 |
| 25/05/2018 | 5.9 |
| 25/05/2018 | 5.7 |
| 25/05/2018 | 5.9 |
| 25/05/2018 | 5.9 |
| 25/05/2018 | 5.7 |
| 25/05/2018 | 5.5 |
| 25/05/2018 | 5.4 |
| 25/05/2018 | 5.6 |
| 25/05/2018 | 5.5 |
| 25/05/2018 | 5.3 |
| 25/05/2018 | 5.2 |
| 25/05/2018 | 4.6 |
| 25/05/2018 | 4.4 |
| 25/05/2018 | 3.9 |
| 25/05/2018 | 3.3 |
| 26/05/2018 | 3 |
| 26/05/2018 | 2.8 |
| 26/05/2018 | 2.8 |
| 26/05/2018 | 2.6 |
| 26/05/2018 | 2.5 |
| 26/05/2018 | 2.6 |
| 26/05/2018 | 2.9 |
| 26/05/2018 | 3.5 |
| 26/05/2018 | 3.8 |
| 26/05/2018 | 4.5 |
| 26/05/2018 | 4.5 |
| 26/05/2018 | 5 |
| 26/05/2018 | 5 |
| 26/05/2018 | 4.8 |
| 26/05/2018 | 4.7 |
| 26/05/2018 | 4.3 |
| 26/05/2018 | 4.5 |
| 26/05/2018 | 4.7 |
| 26/05/2018 | 4.4 |
| 26/05/2018 | 4.3 |
| 26/05/2018 | 4 |
| 26/05/2018 | 3.9 |
| 26/05/2018 | 3.5 |
| 26/05/2018 | 3.3 |
| 27/05/2018 | 2.8 |
| 27/05/2018 | 2.8 |
| 27/05/2018 | 2.3 |
| 27/05/2018 | 2.5 |
| 27/05/2018 | 2.4 |
| 27/05/2018 | 2.3 |
| 27/05/2018 | 2.6 |
| 27/05/2018 | 3.1 |
| 27/05/2018 | 3.2 |
| 27/05/2018 | 3.9 |
| 27/05/2018 | 4.1 |
| 27/05/2018 | 4 |
| 27/05/2018 | 4.4 |
| 27/05/2018 | 3.9 |
| 27/05/2018 | 3.9 |
| 27/05/2018 | 4.1 |
| 27/05/2018 | 4 |
| 27/05/2018 | 4 |
| 27/05/2018 | 4 |
| 27/05/2018 | 3.9 |
| 27/05/2018 | 3.5 |
| 27/05/2018 | 4 |
| 27/05/2018 | 3.6 |
| 27/05/2018 | 3.3 |
| 28/05/2018 | 2.8 |
| 28/05/2018 | 2.8 |
| 28/05/2018 | 2.3 |
| 28/05/2018 | 2.8 |
| 28/05/2018 | 3 |
| 28/05/2018 | 2.8 |
| 28/05/2018 | 3.8 |
| 28/05/2018 | 4.8 |
| 28/05/2018 | 5.2 |
| 28/05/2018 | 5.6 |
| 28/05/2018 | 6 |
| 28/05/2018 | 5.8 |
| 28/05/2018 | 6 |
| 28/05/2018 | 6.1 |
| 28/05/2018 | 5.6 |
| 28/05/2018 | 5.6 |
| 28/05/2018 | 5.8 |
| 28/05/2018 | 5.9 |
| 28/05/2018 | 5.9 |
| 28/05/2018 | 5.4 |
| 28/05/2018 | 4.7 |
| 28/05/2018 | 4.8 |
| 28/05/2018 | 4 |
| 28/05/2018 | 3.5 |
| 29/05/2018 | 3.1 |
| 29/05/2018 | 2.9 |
| 29/05/2018 | 2.8 |
| 29/05/2018 | 2.8 |
| 29/05/2018 | 2.9 |
| 29/05/2018 | 3.3 |
| 29/05/2018 | 4.1 |
| 29/05/2018 | 4.7 |
| 29/05/2018 | 5.6 |
| 29/05/2018 | 5.9 |
| 29/05/2018 | 6.2 |
| 29/05/2018 | 6 |
| 29/05/2018 | 6.2 |
| 29/05/2018 | 6.3 |
| 29/05/2018 | 5.8 |
| 29/05/2018 | 5.8 |
| 29/05/2018 | 5.5 |
| 29/05/2018 | 6.1 |
| 29/05/2018 | 5.6 |
| 29/05/2018 | 5.6 |
| 29/05/2018 | 4.9 |
| 29/05/2018 | 4.9 |
| 29/05/2018 | 4.1 |
| 29/05/2018 | 3.6 |
| 30/05/2018 | 3.2 |
| 30/05/2018 | 3 |
| 30/05/2018 | 2.9 |
| 30/05/2018 | 2.9 |
| 30/05/2018 | 3 |
| 30/05/2018 | 3.3 |
| 30/05/2018 | 4.2 |
| 30/05/2018 | 4.7 |
| 30/05/2018 | 5.7 |
| 30/05/2018 | 6 |
| 30/05/2018 | 5.9 |
| 30/05/2018 | 6.2 |
| 30/05/2018 | 6.3 |
| 30/05/2018 | 6.4 |
| 30/05/2018 | 5.8 |
| 30/05/2018 | 5.9 |
| 30/05/2018 | 6 |
| 30/05/2018 | 6.1 |
| 30/05/2018 | 6 |
| 30/05/2018 | 5.5 |
| 30/05/2018 | 4.8 |
| 30/05/2018 | 4.8 |
| 30/05/2018 | 4.1 |
| 30/05/2018 | 3.6 |
| 31/05/2018 | 3.3 |
| 31/05/2018 | 3 |
| 31/05/2018 | 2.9 |
| 31/05/2018 | 2.9 |
| 31/05/2018 | 3 |
| 31/05/2018 | 3.3 |
| 31/05/2018 | 4.1 |
| 31/05/2018 | 4.7 |
| 31/05/2018 | 5.7 |
| 31/05/2018 | 5.9 |
| 31/05/2018 | 6.3 |
| 31/05/2018 | 6.1 |
| 31/05/2018 | 6.2 |
| 31/05/2018 | 6.3 |
| 31/05/2018 | 5.8 |
| 31/05/2018 | 5.8 |
| 31/05/2018 | 6 |
| 31/05/2018 | 6.1 |
| 31/05/2018 | 5.6 |
| 31/05/2018 | 5.6 |
| 31/05/2018 | 4.8 |
| 31/05/2018 | 4.9 |
| 31/05/2018 | 4.2 |
| 31/05/2018 | 3.8 |
| 01/06/2018 | 3.4 |
| 01/06/2018 | 3.1 |
| 01/06/2018 | 2.5 |
| 01/06/2018 | 2.9 |
| 01/06/2018 | 3 |
| 01/06/2018 | 3.3 |
| 01/06/2018 | 4.1 |
| 01/06/2018 | 5.1 |
| 01/06/2018 | 5.6 |
| 01/06/2018 | 5.9 |
| 01/06/2018 | 6.3 |
| 01/06/2018 | 6 |
| 01/06/2018 | 6 |
| 01/06/2018 | 5.8 |
| 01/06/2018 | 5.6 |
| 01/06/2018 | 5.6 |
| 01/06/2018 | 5.7 |
| 01/06/2018 | 5.6 |
| 01/06/2018 | 5.4 |
| 01/06/2018 | 5.3 |
| 01/06/2018 | 4.6 |
| 01/06/2018 | 4.3 |
| 01/06/2018 | 4 |
| 01/06/2018 | 3.4 |
| 02/06/2018 | 3 |
| 02/06/2018 | 2.9 |
| 02/06/2018 | 2.8 |
| 02/06/2018 | 2.6 |
| 02/06/2018 | 2.5 |
| 02/06/2018 | 2.6 |
| 02/06/2018 | 2.9 |
| 02/06/2018 | 3.5 |
| 02/06/2018 | 3.8 |
| 02/06/2018 | 4.5 |
| 02/06/2018 | 5 |
| 02/06/2018 | 5.1 |
| 02/06/2018 | 5.1 |
| 02/06/2018 | 4.9 |
| 02/06/2018 | 4.8 |
| 02/06/2018 | 4.4 |
| 02/06/2018 | 4.6 |
| 02/06/2018 | 4.7 |
| 02/06/2018 | 4.5 |
| 02/06/2018 | 4.4 |
| 02/06/2018 | 4 |
| 02/06/2018 | 3.8 |
| 02/06/2018 | 3.6 |
| 02/06/2018 | 3.4 |
| 03/06/2018 | 2.9 |
| 03/06/2018 | 2.9 |
| 03/06/2018 | 2.8 |
| 03/06/2018 | 2.6 |
| 03/06/2018 | 2.5 |
| 03/06/2018 | 2.3 |
| 03/06/2018 | 2.6 |
| 03/06/2018 | 3.1 |
| 03/06/2018 | 3.2 |
| 03/06/2018 | 3.9 |
| 03/06/2018 | 4.1 |
| 03/06/2018 | 4 |
| 03/06/2018 | 4.5 |
| 03/06/2018 | 4 |
| 03/06/2018 | 4 |
| 03/06/2018 | 4.2 |
| 03/06/2018 | 4.1 |
| 03/06/2018 | 4.1 |
| 03/06/2018 | 4.1 |
| 03/06/2018 | 4 |
| 03/06/2018 | 4 |
| 03/06/2018 | 3.9 |
| 03/06/2018 | 3.7 |
| 03/06/2018 | 3.4 |
| 04/06/2018 | 2.9 |
| 04/06/2018 | 2.8 |
| 04/06/2018 | 2.4 |
| 04/06/2018 | 2.8 |
| 04/06/2018 | 3 |
| 04/06/2018 | 2.8 |
| 04/06/2018 | 3.8 |
| 04/06/2018 | 4.8 |
| 04/06/2018 | 5.2 |
| 04/06/2018 | 5.6 |
| 04/06/2018 | 6 |
| 04/06/2018 | 6.3 |
| 04/06/2018 | 6.1 |
| 04/06/2018 | 6.3 |
| 04/06/2018 | 5.8 |
| 04/06/2018 | 5.8 |
| 04/06/2018 | 5.9 |
| 04/06/2018 | 6 |
| 04/06/2018 | 6 |
| 04/06/2018 | 5.5 |
| 04/06/2018 | 5.2 |
| 04/06/2018 | 4.7 |
| 04/06/2018 | 4.1 |
| 04/06/2018 | 3.6 |
| 05/06/2018 | 3.1 |
| 05/06/2018 | 2.9 |
| 05/06/2018 | 2.9 |
| 05/06/2018 | 2.8 |
| 05/06/2018 | 2.9 |
| 05/06/2018 | 3.3 |
| 05/06/2018 | 4.1 |
| 05/06/2018 | 4.6 |
| 05/06/2018 | 5.7 |
| 05/06/2018 | 5.9 |
| 05/06/2018 | 6.3 |
| 05/06/2018 | 6.1 |
| 05/06/2018 | 6.3 |
| 05/06/2018 | 6.4 |
| 05/06/2018 | 5.9 |
| 05/06/2018 | 6 |
| 05/06/2018 | 5.6 |
| 05/06/2018 | 6.2 |
| 05/06/2018 | 5.7 |
| 05/06/2018 | 5.7 |
| 05/06/2018 | 4.8 |
| 05/06/2018 | 4.8 |
| 05/06/2018 | 4.1 |
| 05/06/2018 | 3.7 |
| 06/06/2018 | 3.3 |
| 06/06/2018 | 3 |
| 06/06/2018 | 3 |
| 06/06/2018 | 2.9 |
| 06/06/2018 | 3 |
| 06/06/2018 | 3.3 |
| 06/06/2018 | 4.2 |
| 06/06/2018 | 4.7 |
| 06/06/2018 | 5.7 |
| 06/06/2018 | 6 |
| 06/06/2018 | 6.4 |
| 06/06/2018 | 6.3 |
| 06/06/2018 | 6.4 |
| 06/06/2018 | 6.5 |
| 06/06/2018 | 6 |
| 06/06/2018 | 6 |
| 06/06/2018 | 6.2 |
| 06/06/2018 | 6.2 |
| 06/06/2018 | 6.1 |
| 06/06/2018 | 5.6 |
| 06/06/2018 | 5.2 |
| 06/06/2018 | 4.7 |
| 06/06/2018 | 4.2 |
| 06/06/2018 | 3.7 |
| 07/06/2018 | 3.3 |
| 07/06/2018 | 3.1 |
| 07/06/2018 | 3 |
| 07/06/2018 | 2.9 |
| 07/06/2018 | 3 |
| 07/06/2018 | 3.3 |
| 07/06/2018 | 4.1 |
| 07/06/2018 | 4.7 |
| 07/06/2018 | 5.7 |
| 07/06/2018 | 5.9 |
| 07/06/2018 | 6.3 |
| 07/06/2018 | 6.2 |
| 07/06/2018 | 6.3 |
| 07/06/2018 | 6.5 |
| 07/06/2018 | 5.9 |
| 07/06/2018 | 6 |
| 07/06/2018 | 6.1 |
| 07/06/2018 | 6.2 |
| 07/06/2018 | 6.2 |
| 07/06/2018 | 5.7 |
| 07/06/2018 | 5.3 |
| 07/06/2018 | 4.8 |
| 07/06/2018 | 4.2 |
| 07/06/2018 | 3.8 |
| 08/06/2018 | 3.4 |
| 08/06/2018 | 3.1 |
| 08/06/2018 | 3 |
| 08/06/2018 | 3 |
| 08/06/2018 | 3 |
| 08/06/2018 | 3.3 |
| 08/06/2018 | 4.1 |
| 08/06/2018 | 5.1 |
| 08/06/2018 | 5.6 |
| 08/06/2018 | 5.9 |
| 08/06/2018 | 6.3 |
| 08/06/2018 | 6.1 |
| 08/06/2018 | 6.1 |
| 08/06/2018 | 5.9 |
| 08/06/2018 | 5.8 |
| 08/06/2018 | 5.7 |
| 08/06/2018 | 5.8 |
| 08/06/2018 | 5.7 |
| 08/06/2018 | 6 |
| 08/06/2018 | 5.4 |
| 08/06/2018 | 5.1 |
| 08/06/2018 | 4.7 |
| 08/06/2018 | 4 |
| 08/06/2018 | 3.5 |
| 09/06/2018 | 3.1 |
| 09/06/2018 | 3 |
| 09/06/2018 | 2.9 |
| 09/06/2018 | 2.6 |
| 09/06/2018 | 2.5 |
| 09/06/2018 | 2.6 |
| 09/06/2018 | 2.9 |
| 09/06/2018 | 3.5 |
| 09/06/2018 | 4.3 |
| 09/06/2018 | 4.5 |
| 09/06/2018 | 5.1 |
| 09/06/2018 | 5.1 |
| 09/06/2018 | 5.2 |
| 09/06/2018 | 5 |
| 09/06/2018 | 4.9 |
| 09/06/2018 | 4.5 |
| 09/06/2018 | 4.7 |
| 09/06/2018 | 4.8 |
| 09/06/2018 | 4.6 |
| 09/06/2018 | 4.5 |
| 09/06/2018 | 4 |
| 09/06/2018 | 4.3 |
| 09/06/2018 | 3.6 |
| 09/06/2018 | 3.5 |
| 10/06/2018 | 3 |
| 10/06/2018 | 2.9 |
| 10/06/2018 | 2.9 |
| 10/06/2018 | 2.6 |
| 10/06/2018 | 2.5 |
| 10/06/2018 | 2.3 |
| 10/06/2018 | 2.6 |
| 10/06/2018 | 3.1 |
| 10/06/2018 | 3.7 |
| 10/06/2018 | 3.9 |
| 10/06/2018 | 4.2 |
| 10/06/2018 | 4.1 |
| 10/06/2018 | 4.6 |
| 10/06/2018 | 4.1 |
| 10/06/2018 | 4 |
| 10/06/2018 | 4.3 |
| 10/06/2018 | 4.2 |
| 10/06/2018 | 4.2 |
| 10/06/2018 | 4.7 |
| 10/06/2018 | 4.6 |
| 10/06/2018 | 4 |
| 10/06/2018 | 3.9 |
| 10/06/2018 | 3.7 |
| 10/06/2018 | 3.5 |
| 11/06/2018 | 3 |
| 11/06/2018 | 2.9 |
| 11/06/2018 | 2.9 |
| 11/06/2018 | 2.9 |
| 11/06/2018 | 3 |
| 11/06/2018 | 3.3 |
| 11/06/2018 | 3.8 |
| 11/06/2018 | 4.8 |
| 11/06/2018 | 5.7 |
| 11/06/2018 | 6.1 |
| 11/06/2018 | 6.1 |
| 11/06/2018 | 6.4 |
| 11/06/2018 | 6.2 |
| 11/06/2018 | 6.4 |
| 11/06/2018 | 5.9 |
| 11/06/2018 | 5.9 |
| 11/06/2018 | 6 |
| 11/06/2018 | 6.1 |
| 11/06/2018 | 6.1 |
| 11/06/2018 | 5.6 |
| 11/06/2018 | 5.2 |
| 11/06/2018 | 4.6 |
| 11/06/2018 | 4.1 |
| 11/06/2018 | 3.7 |
| 12/06/2018 | 3.2 |
| 12/06/2018 | 3 |
| 12/06/2018 | 2.9 |
| 12/06/2018 | 2.9 |
| 12/06/2018 | 3 |
| 12/06/2018 | 3.3 |
| 12/06/2018 | 4.1 |
| 12/06/2018 | 5.1 |
| 12/06/2018 | 5.7 |
| 12/06/2018 | 6 |
| 12/06/2018 | 6.4 |
| 12/06/2018 | 6.2 |
| 12/06/2018 | 6.4 |
| 12/06/2018 | 6.6 |
| 12/06/2018 | 6.1 |
| 12/06/2018 | 6.1 |
| 12/06/2018 | 5.7 |
| 12/06/2018 | 6.3 |
| 12/06/2018 | 6.3 |
| 12/06/2018 | 5.8 |
| 12/06/2018 | 5.3 |
| 12/06/2018 | 4.7 |
| 12/06/2018 | 4.2 |
| 12/06/2018 | 3.7 |
| 13/06/2018 | 3.4 |
| 13/06/2018 | 3.1 |
| 13/06/2018 | 3 |
| 13/06/2018 | 2.9 |
| 13/06/2018 | 3 |
| 13/06/2018 | 3.3 |
| 13/06/2018 | 4.2 |
| 13/06/2018 | 5.2 |
| 13/06/2018 | 5.7 |
| 13/06/2018 | 6.1 |
| 13/06/2018 | 6.5 |
| 13/06/2018 | 6.3 |
| 13/06/2018 | 6.5 |
| 13/06/2018 | 6.6 |
| 13/06/2018 | 6.1 |
| 13/06/2018 | 6.2 |
| 13/06/2018 | 6.3 |
| 13/06/2018 | 6.3 |
| 13/06/2018 | 6.2 |
| 13/06/2018 | 6.2 |
| 13/06/2018 | 5.2 |
| 13/06/2018 | 4.6 |
| 13/06/2018 | 4.2 |
| 13/06/2018 | 3.8 |
| 14/06/2018 | 3.4 |
| 14/06/2018 | 3.1 |
| 14/06/2018 | 3 |
| 14/06/2018 | 3 |
| 14/06/2018 | 3 |
| 14/06/2018 | 3.3 |
| 14/06/2018 | 4.2 |
| 14/06/2018 | 5.2 |
| 14/06/2018 | 5.7 |
| 14/06/2018 | 6 |
| 14/06/2018 | 6.4 |
| 14/06/2018 | 6.2 |
| 14/06/2018 | 6.4 |
| 14/06/2018 | 6.6 |
| 14/06/2018 | 6.1 |
| 14/06/2018 | 6.1 |
| 14/06/2018 | 6.2 |
| 14/06/2018 | 6.3 |
| 14/06/2018 | 6.3 |
| 14/06/2018 | 6.3 |
| 14/06/2018 | 5.3 |
| 14/06/2018 | 4.7 |
| 14/06/2018 | 4.3 |
| 14/06/2018 | 3.9 |
| 15/06/2018 | 3.5 |
| 15/06/2018 | 3.2 |
| 15/06/2018 | 3.1 |
| 15/06/2018 | 3 |
| 15/06/2018 | 3 |
| 15/06/2018 | 3.3 |
| 15/06/2018 | 4.1 |
| 15/06/2018 | 5.1 |
| 15/06/2018 | 5.6 |
| 15/06/2018 | 5.9 |
| 15/06/2018 | 6.4 |
| 15/06/2018 | 6.2 |
| 15/06/2018 | 6.2 |
| 15/06/2018 | 6 |
| 15/06/2018 | 5.9 |
| 15/06/2018 | 5.8 |
| 15/06/2018 | 6 |
| 15/06/2018 | 5.8 |
| 15/06/2018 | 6.1 |
| 15/06/2018 | 6 |
| 15/06/2018 | 5.1 |
| 15/06/2018 | 4.6 |
| 15/06/2018 | 4.1 |
| 15/06/2018 | 3.5 |
| 16/06/2018 | 3.2 |
| 16/06/2018 | 3 |
| 16/06/2018 | 2.9 |
| 16/06/2018 | 2.7 |
| 16/06/2018 | 2.5 |
| 16/06/2018 | 2.6 |
| 16/06/2018 | 2.9 |
| 16/06/2018 | 3.5 |
| 16/06/2018 | 4.3 |
| 16/06/2018 | 4.5 |
| 16/06/2018 | 5.1 |
| 16/06/2018 | 5.2 |
| 16/06/2018 | 5.2 |
| 16/06/2018 | 5.1 |
| 16/06/2018 | 5 |
| 16/06/2018 | 4.6 |
| 16/06/2018 | 4.3 |
| 16/06/2018 | 4.9 |
| 16/06/2018 | 4.7 |
| 16/06/2018 | 5.1 |
| 16/06/2018 | 4.5 |
| 16/06/2018 | 4.2 |
| 16/06/2018 | 4.2 |
| 16/06/2018 | 3.5 |
| 17/06/2018 | 3 |
| 17/06/2018 | 3 |
| 17/06/2018 | 2.9 |
| 17/06/2018 | 2.6 |
| 17/06/2018 | 2.5 |
| 17/06/2018 | 2.3 |
| 17/06/2018 | 2.6 |
| 17/06/2018 | 3.1 |
| 17/06/2018 | 3.7 |
| 17/06/2018 | 4 |
| 17/06/2018 | 4.2 |
| 17/06/2018 | 4.2 |
| 17/06/2018 | 4.7 |
| 17/06/2018 | 4.2 |
| 17/06/2018 | 4.2 |
| 17/06/2018 | 4.4 |
| 17/06/2018 | 4.3 |
| 17/06/2018 | 4.2 |
| 17/06/2018 | 4.8 |
| 17/06/2018 | 4.6 |
| 17/06/2018 | 4 |
| 17/06/2018 | 3.8 |
| 17/06/2018 | 3.8 |
| 17/06/2018 | 3.5 |
| 18/06/2018 | 3.1 |
| 18/06/2018 | 2.9 |
| 18/06/2018 | 3 |
| 18/06/2018 | 2.9 |
| 18/06/2018 | 3 |
| 18/06/2018 | 3.3 |
| 18/06/2018 | 4.3 |
| 18/06/2018 | 4.8 |
| 18/06/2018 | 5.7 |
| 18/06/2018 | 6.2 |
| 18/06/2018 | 6.1 |
| 18/06/2018 | 6.5 |
| 18/06/2018 | 6.3 |
| 18/06/2018 | 6.5 |
| 18/06/2018 | 6 |
| 18/06/2018 | 6 |
| 18/06/2018 | 6.1 |
| 18/06/2018 | 6.1 |
| 18/06/2018 | 6.2 |
| 18/06/2018 | 6.2 |
| 18/06/2018 | 5.2 |
| 18/06/2018 | 4.5 |
| 18/06/2018 | 4.2 |
| 18/06/2018 | 3.7 |
| 19/06/2018 | 3.3 |
| 19/06/2018 | 3 |
| 19/06/2018 | 3 |
| 19/06/2018 | 2.9 |
| 19/06/2018 | 3 |
| 19/06/2018 | 3.3 |
| 19/06/2018 | 4.1 |
| 19/06/2018 | 5.1 |
| 19/06/2018 | 5.7 |
| 19/06/2018 | 6 |
| 19/06/2018 | 6.4 |
| 19/06/2018 | 6.3 |
| 19/06/2018 | 6.5 |
| 19/06/2018 | 6.7 |
| 19/06/2018 | 6.2 |
| 19/06/2018 | 6.2 |
| 19/06/2018 | 5.9 |
| 19/06/2018 | 5.9 |
| 19/06/2018 | 6.4 |
| 19/06/2018 | 6.4 |
| 19/06/2018 | 5.3 |
| 19/06/2018 | 4.6 |
| 19/06/2018 | 4.3 |
| 19/06/2018 | 3.8 |
| 20/06/2018 | 3.5 |
| 20/06/2018 | 3.1 |
| 20/06/2018 | 3.1 |
| 20/06/2018 | 3 |
| 20/06/2018 | 3 |
| 20/06/2018 | 3.3 |
| 20/06/2018 | 4.2 |
| 20/06/2018 | 5.2 |
| 20/06/2018 | 5.7 |
| 20/06/2018 | 6.1 |
| 20/06/2018 | 6.6 |
| 20/06/2018 | 6.4 |
| 20/06/2018 | 6.6 |
| 20/06/2018 | 6.7 |
| 20/06/2018 | 6.2 |
| 20/06/2018 | 6.3 |
| 20/06/2018 | 6.4 |
| 20/06/2018 | 6.4 |
| 20/06/2018 | 6.3 |
| 20/06/2018 | 6.3 |
| 20/06/2018 | 5.7 |
| 20/06/2018 | 5 |
| 20/06/2018 | 4.3 |
| 20/06/2018 | 3.9 |
| 21/06/2018 | 3.5 |
| 21/06/2018 | 3.2 |
| 21/06/2018 | 3.1 |
| 21/06/2018 | 3 |
| 21/06/2018 | 3 |
| 21/06/2018 | 3.3 |
| 21/06/2018 | 4.2 |
| 21/06/2018 | 5.2 |
| 21/06/2018 | 5.7 |
| 21/06/2018 | 6 |
| 21/06/2018 | 6.4 |
| 21/06/2018 | 6.3 |
| 21/06/2018 | 6.5 |
| 21/06/2018 | 6.7 |
| 21/06/2018 | 6.2 |
| 21/06/2018 | 6.2 |
| 21/06/2018 | 6.3 |
| 21/06/2018 | 6.4 |
| 21/06/2018 | 6.4 |
| 21/06/2018 | 6.4 |
| 21/06/2018 | 5.3 |
| 21/06/2018 | 4.6 |
| 21/06/2018 | 4.3 |
| 21/06/2018 | 4 |
| 22/06/2018 | 3.6 |
| 22/06/2018 | 3.2 |
| 22/06/2018 | 3.1 |
| 22/06/2018 | 3 |
| 22/06/2018 | 3 |
| 22/06/2018 | 3.3 |
| 22/06/2018 | 4.1 |
| 22/06/2018 | 5.1 |
| 22/06/2018 | 5.6 |
| 22/06/2018 | 6 |
| 22/06/2018 | 6.4 |
| 22/06/2018 | 6.3 |
| 22/06/2018 | 6.3 |
| 22/06/2018 | 6.2 |
| 22/06/2018 | 6 |
| 22/06/2018 | 6 |
| 22/06/2018 | 6.1 |
| 22/06/2018 | 5.9 |
| 22/06/2018 | 6.2 |
| 22/06/2018 | 6.1 |
| 22/06/2018 | 5.1 |
| 22/06/2018 | 4.5 |
| 22/06/2018 | 4.1 |
| 22/06/2018 | 4.1 |
| 23/06/2018 | 3.3 |
| 23/06/2018 | 3.1 |
| 23/06/2018 | 3 |
| 23/06/2018 | 2.7 |
| 23/06/2018 | 2.5 |
| 23/06/2018 | 2.6 |
| 23/06/2018 | 2.9 |
| 23/06/2018 | 3.5 |
| 23/06/2018 | 4.3 |
| 23/06/2018 | 4.6 |
| 23/06/2018 | 5.2 |
| 23/06/2018 | 5.3 |
| 23/06/2018 | 5.3 |
| 23/06/2018 | 5.2 |
| 23/06/2018 | 5.1 |
| 23/06/2018 | 4.7 |
| 23/06/2018 | 4.4 |
| 23/06/2018 | 5 |
| 23/06/2018 | 5.2 |
| 23/06/2018 | 5.2 |
| 23/06/2018 | 4.5 |
| 23/06/2018 | 4.1 |
| 23/06/2018 | 4.2 |
| 23/06/2018 | 3.6 |
| 24/06/2018 | 3.1 |
| 24/06/2018 | 3 |
| 24/06/2018 | 3 |
| 24/06/2018 | 2.7 |
| 24/06/2018 | 2.5 |
| 24/06/2018 | 2.8 |
| 24/06/2018 | 2.6 |
| 24/06/2018 | 3.1 |
| 24/06/2018 | 3.7 |
| 24/06/2018 | 4 |
| 24/06/2018 | 4.3 |
| 24/06/2018 | 4.3 |
| 24/06/2018 | 4.7 |
| 24/06/2018 | 4.3 |
| 24/06/2018 | 4.3 |
| 24/06/2018 | 4.5 |
| 24/06/2018 | 4.4 |
| 24/06/2018 | 4.3 |
| 24/06/2018 | 4.8 |
| 24/06/2018 | 4.7 |
| 24/06/2018 | 4.5 |
| 24/06/2018 | 4.2 |
| 24/06/2018 | 3.8 |
| 24/06/2018 | 3.6 |
| 25/06/2018 | 3.1 |
| 25/06/2018 | 3 |
| 25/06/2018 | 3 |
| 25/06/2018 | 2.9 |
| 25/06/2018 | 3 |
| 25/06/2018 | 3.3 |
| 25/06/2018 | 4.3 |
| 25/06/2018 | 5.2 |
| 25/06/2018 | 5.8 |
| 25/06/2018 | 6.2 |
| 25/06/2018 | 6.2 |
| 25/06/2018 | 6.6 |
| 25/06/2018 | 6.4 |
| 25/06/2018 | 6.6 |
| 25/06/2018 | 6.2 |
| 25/06/2018 | 6.2 |
| 25/06/2018 | 6.2 |
| 25/06/2018 | 6.2 |
| 25/06/2018 | 6.3 |
| 25/06/2018 | 6.3 |
| 25/06/2018 | 5.7 |
| 25/06/2018 | 4.9 |
| 25/06/2018 | 4.7 |
| 25/06/2018 | 3.8 |
| 26/06/2018 | 3.4 |
| 26/06/2018 | 3.1 |
| 26/06/2018 | 3 |
| 26/06/2018 | 3 |
| 26/06/2018 | 3 |
| 26/06/2018 | 3.3 |
| 26/06/2018 | 4.1 |
| 26/06/2018 | 5.1 |
| 26/06/2018 | 5.7 |
| 26/06/2018 | 6.5 |
| 26/06/2018 | 6.5 |
| 26/06/2018 | 6.9 |
| 26/06/2018 | 6.6 |
| 26/06/2018 | 6.8 |
| 26/06/2018 | 6.3 |
| 26/06/2018 | 6.4 |
| 26/06/2018 | 6 |
| 26/06/2018 | 6 |
| 26/06/2018 | 6.5 |
| 26/06/2018 | 6.5 |
| 26/06/2018 | 5.8 |
| 26/06/2018 | 5 |
| 26/06/2018 | 4.3 |
| 26/06/2018 | 3.9 |
| 27/06/2018 | 3.5 |
| 27/06/2018 | 3.2 |
| 27/06/2018 | 3.1 |
| 27/06/2018 | 3 |
| 27/06/2018 | 3 |
| 27/06/2018 | 3.3 |
| 27/06/2018 | 4.2 |
| 27/06/2018 | 5.2 |
| 27/06/2018 | 5.7 |
| 27/06/2018 | 6.1 |
| 27/06/2018 | 6.6 |
| 27/06/2018 | 6.5 |
| 27/06/2018 | 6.7 |
| 27/06/2018 | 6.9 |
| 27/06/2018 | 6.4 |
| 27/06/2018 | 6.4 |
| 27/06/2018 | 6 |
| 27/06/2018 | 6.4 |
| 27/06/2018 | 6.4 |
| 27/06/2018 | 6.4 |
| 27/06/2018 | 5.7 |
| 27/06/2018 | 5 |
| 27/06/2018 | 4.3 |
| 27/06/2018 | 4 |
| 28/06/2018 | 3.6 |
| 28/06/2018 | 3.3 |
| 28/06/2018 | 3.2 |
| 28/06/2018 | 3 |
| 28/06/2018 | 3.1 |
| 28/06/2018 | 3.3 |
| 28/06/2018 | 4.2 |
| 28/06/2018 | 5.2 |
| 28/06/2018 | 5.7 |
| 28/06/2018 | 6.5 |
| 28/06/2018 | 6.5 |
| 28/06/2018 | 6.9 |
| 28/06/2018 | 6.6 |
| 28/06/2018 | 6.8 |
| 28/06/2018 | 6.3 |
| 28/06/2018 | 6.3 |
| 28/06/2018 | 6.4 |
| 28/06/2018 | 6.5 |
| 28/06/2018 | 6.5 |
| 28/06/2018 | 6.5 |
| 28/06/2018 | 5.8 |
| 28/06/2018 | 5 |
| 28/06/2018 | 4.4 |
| 28/06/2018 | 4.1 |
| 29/06/2018 | 3.7 |
| 29/06/2018 | 3.3 |
| 29/06/2018 | 3.2 |
| 29/06/2018 | 3.1 |
| 29/06/2018 | 3.1 |
| 29/06/2018 | 3.3 |
| 29/06/2018 | 4.6 |
| 29/06/2018 | 5.1 |
| 29/06/2018 | 6.1 |
| 29/06/2018 | 6.5 |
| 29/06/2018 | 6.5 |
| 29/06/2018 | 6.9 |
| 29/06/2018 | 6.9 |
| 29/06/2018 | 6.3 |
| 29/06/2018 | 6.1 |
| 29/06/2018 | 6.1 |
| 29/06/2018 | 6.2 |
| 29/06/2018 | 6 |
| 29/06/2018 | 6.2 |
| 29/06/2018 | 6.2 |
| 29/06/2018 | 5.6 |
| 29/06/2018 | 4.4 |
| 29/06/2018 | 4.7 |
| 29/06/2018 | 4.2 |
| 30/06/2018 | 3.4 |
| 30/06/2018 | 3.2 |
| 30/06/2018 | 3 |
| 30/06/2018 | 2.7 |
| 30/06/2018 | 3.1 |
| 30/06/2018 | 3.1 |
| 30/06/2018 | 3.4 |
| 30/06/2018 | 3.5 |
| 30/06/2018 | 4.3 |
| 30/06/2018 | 5.1 |
| 30/06/2018 | 5.2 |
| 30/06/2018 | 5.4 |
| 30/06/2018 | 5.4 |
| 30/06/2018 | 5.3 |
| 30/06/2018 | 5.2 |
| 30/06/2018 | 4.8 |
| 30/06/2018 | 4.5 |
| 30/06/2018 | 5 |
| 30/06/2018 | 5.3 |
| 30/06/2018 | 5.3 |
| 30/06/2018 | 4.5 |
| 30/06/2018 | 4 |
| 30/06/2018 | 4.3 |
| 30/06/2018 | 3.7 |
| 01/07/2018 | 3.2 |
| 01/07/2018 | 3.1 |
| 01/07/2018 | 3 |
| 01/07/2018 | 2.7 |
| 01/07/2018 | 2.5 |
| 01/07/2018 | 2.8 |
| 01/07/2018 | 3.1 |
| 01/07/2018 | 3.1 |
| 01/07/2018 | 3.7 |
| 01/07/2018 | 4 |
| 01/07/2018 | 4.3 |
| 01/07/2018 | 4.8 |
| 01/07/2018 | 4.8 |
| 01/07/2018 | 4.4 |
| 01/07/2018 | 4.4 |
| 01/07/2018 | 4.6 |
| 01/07/2018 | 4.5 |
| 01/07/2018 | 4.4 |
| 01/07/2018 | 4.9 |
| 01/07/2018 | 4.8 |
| 01/07/2018 | 4.5 |
| 01/07/2018 | 4.1 |
| 01/07/2018 | 3.9 |
| 01/07/2018 | 3.7 |
| 02/07/2018 | 3.2 |
| 02/07/2018 | 3 |
| 02/07/2018 | 3.1 |
| 02/07/2018 | 3 |
| 02/07/2018 | 3 |
| 02/07/2018 | 3.3 |
| 02/07/2018 | 4.3 |
| 02/07/2018 | 5.2 |
| 02/07/2018 | 5.8 |
| 02/07/2018 | 6.2 |
| 02/07/2018 | 6.7 |
| 02/07/2018 | 6.7 |
| 02/07/2018 | 6.5 |
| 02/07/2018 | 6.7 |
| 02/07/2018 | 6.3 |
| 02/07/2018 | 6.3 |
| 02/07/2018 | 5.8 |
| 02/07/2018 | 6.3 |
| 02/07/2018 | 6.4 |
| 02/07/2018 | 6.4 |
| 02/07/2018 | 5.7 |
| 02/07/2018 | 4.8 |
| 02/07/2018 | 4.8 |
| 02/07/2018 | 3.9 |
| 03/07/2018 | 3.5 |
| 03/07/2018 | 3.2 |
| 03/07/2018 | 3.1 |
| 03/07/2018 | 3 |
| 03/07/2018 | 3 |
| 03/07/2018 | 3.3 |
| 03/07/2018 | 4.1 |
| 03/07/2018 | 5.1 |
| 03/07/2018 | 6.2 |
| 03/07/2018 | 6.5 |
| 03/07/2018 | 6.5 |
| 03/07/2018 | 7 |
| 03/07/2018 | 6.7 |
| 03/07/2018 | 6.9 |
| 03/07/2018 | 6.4 |
| 03/07/2018 | 6.5 |
| 03/07/2018 | 6.1 |
| 03/07/2018 | 6.1 |
| 03/07/2018 | 6.6 |
| 03/07/2018 | 6.6 |
| 03/07/2018 | 5.9 |
| 03/07/2018 | 5 |
| 03/07/2018 | 4.8 |
| 03/07/2018 | 4 |
| 04/07/2018 | 3.6 |
| 04/07/2018 | 3.3 |
| 04/07/2018 | 3.2 |
| 04/07/2018 | 3.1 |
| 04/07/2018 | 3.1 |
| 04/07/2018 | 3.3 |
| 04/07/2018 | 4.2 |
| 04/07/2018 | 5.2 |
| 04/07/2018 | 6.2 |
| 04/07/2018 | 6.6 |
| 04/07/2018 | 6.7 |
| 04/07/2018 | 6.6 |
| 04/07/2018 | 6.8 |
| 04/07/2018 | 6.9 |
| 04/07/2018 | 6.5 |
| 04/07/2018 | 6.5 |
| 04/07/2018 | 6.1 |
| 04/07/2018 | 6.5 |
| 04/07/2018 | 6.4 |
| 04/07/2018 | 6.4 |
| 04/07/2018 | 5.8 |
| 04/07/2018 | 4.9 |
| 04/07/2018 | 4.4 |
| 04/07/2018 | 4 |
| 05/07/2018 | 3.5 |
| 05/07/2018 | 3.2 |
| 05/07/2018 | 3.1 |
| 05/07/2018 | 2.9 |
| 05/07/2018 | 2.9 |
| 05/07/2018 | 3 |
| 05/07/2018 | 3.8 |
| 05/07/2018 | 5.2 |
| 05/07/2018 | 5.7 |
| 05/07/2018 | 6.2 |
| 05/07/2018 | 6.3 |
| 05/07/2018 | 6.3 |
| 05/07/2018 | 6.5 |
| 05/07/2018 | 6.1 |
| 05/07/2018 | 6 |
| 05/07/2018 | 5.9 |
| 05/07/2018 | 5.4 |
| 05/07/2018 | 5.6 |
| 05/07/2018 | 6.4 |
| 05/07/2018 | 6.8 |
| 05/07/2018 | 5.3 |
| 05/07/2018 | 4.3 |
| 05/07/2018 | 4.6 |
| 05/07/2018 | 4 |
| 06/07/2018 | 3.6 |
| 06/07/2018 | 3.2 |
| 06/07/2018 | 3.1 |
| 06/07/2018 | 2.9 |
| 06/07/2018 | 2.9 |
| 06/07/2018 | 3 |
| 06/07/2018 | 3.7 |
| 06/07/2018 | 5 |
| 06/07/2018 | 5.6 |
| 06/07/2018 | 6.2 |
| 06/07/2018 | 6.3 |
| 06/07/2018 | 6.2 |
| 06/07/2018 | 6.2 |
| 06/07/2018 | 6 |
| 06/07/2018 | 5.8 |
| 06/07/2018 | 5.7 |
| 06/07/2018 | 5.6 |
| 06/07/2018 | 5.6 |
| 06/07/2018 | 6.2 |
| 06/07/2018 | 6.5 |
| 06/07/2018 | 5.1 |
| 06/07/2018 | 4.3 |
| 06/07/2018 | 4.3 |
| 06/07/2018 | 4 |
| 07/07/2018 | 3.2 |
| 07/07/2018 | 3.1 |
| 07/07/2018 | 2.9 |
| 07/07/2018 | 2.6 |
| 07/07/2018 | 2.4 |
| 07/07/2018 | 2.9 |
| 07/07/2018 | 2.8 |
| 07/07/2018 | 3.2 |
| 07/07/2018 | 4.1 |
| 07/07/2018 | 4.4 |
| 07/07/2018 | 5.1 |
| 07/07/2018 | 4.8 |
| 07/07/2018 | 4.8 |
| 07/07/2018 | 4.7 |
| 07/07/2018 | 4.5 |
| 07/07/2018 | 4.6 |
| 07/07/2018 | 4.1 |
| 07/07/2018 | 4.3 |
| 07/07/2018 | 5.3 |
| 07/07/2018 | 5.1 |
| 07/07/2018 | 4.2 |
| 07/07/2018 | 3.5 |
| 07/07/2018 | 3.9 |
| 07/07/2018 | 3.5 |
| 08/07/2018 | 3.1 |
| 08/07/2018 | 3 |
| 08/07/2018 | 2.9 |
| 08/07/2018 | 2.6 |
| 08/07/2018 | 2.4 |
| 08/07/2018 | 2.6 |
| 08/07/2018 | 2.6 |
| 08/07/2018 | 2.9 |
| 08/07/2018 | 3.6 |
| 08/07/2018 | 3.9 |
| 08/07/2018 | 4.3 |
| 08/07/2018 | 4.3 |
| 08/07/2018 | 4.3 |
| 08/07/2018 | 4.3 |
| 08/07/2018 | 4.2 |
| 08/07/2018 | 3.9 |
| 08/07/2018 | 3.6 |
| 08/07/2018 | 4.2 |
| 08/07/2018 | 4.9 |
| 08/07/2018 | 4.7 |
| 08/07/2018 | 4.3 |
| 08/07/2018 | 3.6 |
| 08/07/2018 | 4 |
| 08/07/2018 | 3.5 |
| 09/07/2018 | 3.1 |
| 09/07/2018 | 2.9 |
| 09/07/2018 | 3 |
| 09/07/2018 | 2.9 |
| 09/07/2018 | 2.9 |
| 09/07/2018 | 3.1 |
| 09/07/2018 | 4 |
| 09/07/2018 | 4.7 |
| 09/07/2018 | 5.2 |
| 09/07/2018 | 5.8 |
| 09/07/2018 | 6 |
| 09/07/2018 | 6 |
| 09/07/2018 | 6.2 |
| 09/07/2018 | 5.9 |
| 09/07/2018 | 5.9 |
| 09/07/2018 | 5.8 |
| 09/07/2018 | 5.2 |
| 09/07/2018 | 5.4 |
| 09/07/2018 | 6.2 |
| 09/07/2018 | 6.7 |
| 09/07/2018 | 5.3 |
| 09/07/2018 | 4.3 |
| 09/07/2018 | 4.4 |
| 09/07/2018 | 3.7 |
| 10/07/2018 | 3.3 |
| 10/07/2018 | 3 |
| 10/07/2018 | 3 |
| 10/07/2018 | 2.9 |
| 10/07/2018 | 2.9 |
| 10/07/2018 | 3 |
| 10/07/2018 | 3.8 |
| 10/07/2018 | 4.6 |
| 10/07/2018 | 5.6 |
| 10/07/2018 | 6.1 |
| 10/07/2018 | 6.3 |
| 10/07/2018 | 6.2 |
| 10/07/2018 | 6.4 |
| 10/07/2018 | 6.1 |
| 10/07/2018 | 6 |
| 10/07/2018 | 6 |
| 10/07/2018 | 5.5 |
| 10/07/2018 | 5.6 |
| 10/07/2018 | 6.4 |
| 10/07/2018 | 6.3 |
| 10/07/2018 | 5.4 |
| 10/07/2018 | 4.5 |
| 10/07/2018 | 4.4 |
| 10/07/2018 | 3.7 |
| 11/07/2018 | 3.4 |
| 11/07/2018 | 3.1 |
| 11/07/2018 | 3 |
| 11/07/2018 | 2.9 |
| 11/07/2018 | 2.9 |
| 11/07/2018 | 3.1 |
| 11/07/2018 | 3.9 |
| 11/07/2018 | 4.6 |
| 11/07/2018 | 5.7 |
| 11/07/2018 | 5.7 |
| 11/07/2018 | 6.4 |
| 11/07/2018 | 6.4 |
| 11/07/2018 | 6.5 |
| 11/07/2018 | 6.1 |
| 11/07/2018 | 6 |
| 11/07/2018 | 6 |
| 11/07/2018 | 5.5 |
| 11/07/2018 | 5.6 |
| 11/07/2018 | 6.2 |
| 11/07/2018 | 6.1 |
| 11/07/2018 | 5.4 |
| 11/07/2018 | 4.4 |
| 11/07/2018 | 4.5 |
| 11/07/2018 | 3.8 |
| 12/07/2018 | 3.5 |
| 12/07/2018 | 3.1 |
| 12/07/2018 | 3.1 |
| 12/07/2018 | 2.9 |
| 12/07/2018 | 2.9 |
| 12/07/2018 | 3.1 |
| 12/07/2018 | 3.9 |
| 12/07/2018 | 4.6 |
| 12/07/2018 | 5.6 |
| 12/07/2018 | 6.1 |
| 12/07/2018 | 6.3 |
| 12/07/2018 | 6.2 |
| 12/07/2018 | 6.4 |
| 12/07/2018 | 6.1 |
| 12/07/2018 | 6 |
| 12/07/2018 | 5.9 |
| 12/07/2018 | 5.4 |
| 12/07/2018 | 5.6 |
| 12/07/2018 | 6.3 |
| 12/07/2018 | 6.2 |
| 12/07/2018 | 5.5 |
| 12/07/2018 | 4.5 |
| 12/07/2018 | 4.5 |
| 12/07/2018 | 3.8 |
| 13/07/2018 | 3.5 |
| 13/07/2018 | 3.2 |
| 13/07/2018 | 3.1 |
| 13/07/2018 | 3 |
| 13/07/2018 | 3 |
| 13/07/2018 | 3.1 |
| 13/07/2018 | 3.8 |
| 13/07/2018 | 5 |
| 13/07/2018 | 5.5 |
| 13/07/2018 | 5.6 |
| 13/07/2018 | 6.2 |
| 13/07/2018 | 6.2 |
| 13/07/2018 | 6.2 |
| 13/07/2018 | 6 |
| 13/07/2018 | 5.8 |
| 13/07/2018 | 5.7 |
| 13/07/2018 | 5.2 |
| 13/07/2018 | 5.6 |
| 13/07/2018 | 6 |
| 13/07/2018 | 5.9 |
| 13/07/2018 | 4.8 |
| 13/07/2018 | 4.5 |
| 13/07/2018 | 4.2 |
| 13/07/2018 | 3.9 |
| 14/07/2018 | 3.2 |
| 14/07/2018 | 3 |
| 14/07/2018 | 2.9 |
| 14/07/2018 | 2.6 |
| 14/07/2018 | 2.5 |
| 14/07/2018 | 2.4 |
| 14/07/2018 | 2.8 |
| 14/07/2018 | 3.2 |
| 14/07/2018 | 4 |
| 14/07/2018 | 4.3 |
| 14/07/2018 | 5.1 |
| 14/07/2018 | 4.8 |
| 14/07/2018 | 4.8 |
| 14/07/2018 | 4.6 |
| 14/07/2018 | 4.5 |
| 14/07/2018 | 4.6 |
| 14/07/2018 | 4.1 |
| 14/07/2018 | 4.3 |
| 14/07/2018 | 4.7 |
| 14/07/2018 | 5 |
| 14/07/2018 | 4.3 |
| 14/07/2018 | 3.6 |
| 14/07/2018 | 3.9 |
| 14/07/2018 | 3.4 |
| 15/07/2018 | 3 |
| 15/07/2018 | 3 |
| 15/07/2018 | 2.9 |
| 15/07/2018 | 2.6 |
| 15/07/2018 | 2.4 |
| 15/07/2018 | 2.6 |
| 15/07/2018 | 2.6 |
| 15/07/2018 | 2.9 |
| 15/07/2018 | 3.5 |
| 15/07/2018 | 3.9 |
| 15/07/2018 | 4.2 |
| 15/07/2018 | 4.3 |
| 15/07/2018 | 4.2 |
| 15/07/2018 | 4.3 |
| 15/07/2018 | 4.2 |
| 15/07/2018 | 3.9 |
| 15/07/2018 | 3.7 |
| 15/07/2018 | 4.2 |
| 15/07/2018 | 4.3 |
| 15/07/2018 | 4.6 |
| 15/07/2018 | 3.9 |
| 15/07/2018 | 3.8 |
| 15/07/2018 | 3.9 |
| 15/07/2018 | 3.4 |
| 16/07/2018 | 3 |
| 16/07/2018 | 2.9 |
| 16/07/2018 | 2.9 |
| 16/07/2018 | 2.9 |
| 16/07/2018 | 2.9 |
| 16/07/2018 | 3.2 |
| 16/07/2018 | 4 |
| 16/07/2018 | 4.7 |
| 16/07/2018 | 5.2 |
| 16/07/2018 | 5.8 |
| 16/07/2018 | 5.9 |
| 16/07/2018 | 5.9 |
| 16/07/2018 | 6.2 |
| 16/07/2018 | 5.9 |
| 16/07/2018 | 5.9 |
| 16/07/2018 | 5.8 |
| 16/07/2018 | 5.3 |
| 16/07/2018 | 5.4 |
| 16/07/2018 | 6 |
| 16/07/2018 | 6 |
| 16/07/2018 | 5 |
| 16/07/2018 | 4.5 |
| 16/07/2018 | 4.3 |
| 16/07/2018 | 3.6 |
| 17/07/2018 | 3.2 |
| 17/07/2018 | 3 |
| 17/07/2018 | 3 |
| 17/07/2018 | 2.9 |
| 17/07/2018 | 2.9 |
| 17/07/2018 | 3.1 |
| 17/07/2018 | 3.8 |
| 17/07/2018 | 4.5 |
| 17/07/2018 | 5.6 |
| 17/07/2018 | 5.6 |
| 17/07/2018 | 6.2 |
| 17/07/2018 | 6.2 |
| 17/07/2018 | 6.4 |
| 17/07/2018 | 6 |
| 17/07/2018 | 6 |
| 17/07/2018 | 6 |
| 17/07/2018 | 5.5 |
| 17/07/2018 | 5.6 |
| 17/07/2018 | 6.3 |
| 17/07/2018 | 6.2 |
| 17/07/2018 | 5.1 |
| 17/07/2018 | 4.6 |
| 17/07/2018 | 4.4 |
| 17/07/2018 | 3.6 |
| 18/07/2018 | 3.4 |
| 18/07/2018 | 3.1 |
| 18/07/2018 | 3 |
| 18/07/2018 | 2.9 |
| 18/07/2018 | 3 |
| 18/07/2018 | 3.2 |
| 18/07/2018 | 3.9 |
| 18/07/2018 | 4.6 |
| 18/07/2018 | 5.7 |
| 18/07/2018 | 5.7 |
| 18/07/2018 | 6.3 |
| 18/07/2018 | 6.3 |
| 18/07/2018 | 6.5 |
| 18/07/2018 | 6.1 |
| 18/07/2018 | 6 |
| 18/07/2018 | 6 |
| 18/07/2018 | 5.5 |
| 18/07/2018 | 5.6 |
| 18/07/2018 | 6.1 |
| 18/07/2018 | 6 |
| 18/07/2018 | 5 |
| 18/07/2018 | 4.6 |
| 18/07/2018 | 4.4 |
| 18/07/2018 | 3.7 |
| 19/07/2018 | 3.4 |
| 19/07/2018 | 3.1 |
| 19/07/2018 | 3 |
| 19/07/2018 | 2.9 |
| 19/07/2018 | 3 |
| 19/07/2018 | 3.2 |
| 19/07/2018 | 3.9 |
| 19/07/2018 | 4.6 |
| 19/07/2018 | 5.6 |
| 19/07/2018 | 5.6 |
| 19/07/2018 | 6.2 |
| 19/07/2018 | 6.2 |
| 19/07/2018 | 6.4 |
| 19/07/2018 | 6 |
| 19/07/2018 | 6 |
| 19/07/2018 | 5.9 |
| 19/07/2018 | 5.4 |
| 19/07/2018 | 5.6 |
| 19/07/2018 | 6.1 |
| 19/07/2018 | 6.1 |
| 19/07/2018 | 5.1 |
| 19/07/2018 | 4.7 |
| 19/07/2018 | 4.4 |
| 19/07/2018 | 3.7 |
| 20/07/2018 | 3.5 |
| 20/07/2018 | 3.2 |
| 20/07/2018 | 3.1 |
| 20/07/2018 | 3 |
| 20/07/2018 | 3 |
| 20/07/2018 | 3.2 |
| 20/07/2018 | 3.8 |
| 20/07/2018 | 4.5 |
| 20/07/2018 | 5.5 |
| 20/07/2018 | 5.5 |
| 20/07/2018 | 6.2 |
| 20/07/2018 | 6.1 |
| 20/07/2018 | 6.1 |
| 20/07/2018 | 6 |
| 20/07/2018 | 5.8 |
| 20/07/2018 | 5.7 |
| 20/07/2018 | 5.2 |
| 20/07/2018 | 5.6 |
| 20/07/2018 | 5.4 |
| 20/07/2018 | 5.7 |
| 20/07/2018 | 5 |
| 20/07/2018 | 4.1 |
| 20/07/2018 | 4.2 |
| 20/07/2018 | 3.8 |
| 21/07/2018 | 3.1 |
| 21/07/2018 | 3 |
| 21/07/2018 | 2.9 |
| 21/07/2018 | 2.6 |
| 21/07/2018 | 2.5 |
| 21/07/2018 | 2.5 |
| 21/07/2018 | 2.9 |
| 21/07/2018 | 3.2 |
| 21/07/2018 | 4 |
| 21/07/2018 | 4.3 |
| 21/07/2018 | 4.5 |
| 21/07/2018 | 4.7 |
| 21/07/2018 | 4.7 |
| 21/07/2018 | 4.6 |
| 21/07/2018 | 4.5 |
| 21/07/2018 | 4.6 |
| 21/07/2018 | 4.2 |
| 21/07/2018 | 4.2 |
| 21/07/2018 | 4.6 |
| 21/07/2018 | 4.4 |
| 21/07/2018 | 3.9 |
| 21/07/2018 | 3.8 |
| 21/07/2018 | 3.8 |
| 21/07/2018 | 3.3 |
| 22/07/2018 | 3 |
| 22/07/2018 | 2.9 |
| 22/07/2018 | 2.9 |
| 22/07/2018 | 2.6 |
| 22/07/2018 | 2.5 |
| 22/07/2018 | 2.2 |
| 22/07/2018 | 2.6 |
| 22/07/2018 | 2.9 |
| 22/07/2018 | 3.5 |
| 22/07/2018 | 3.8 |
| 22/07/2018 | 4.2 |
| 22/07/2018 | 4.2 |
| 22/07/2018 | 4.2 |
| 22/07/2018 | 4.3 |
| 22/07/2018 | 4.2 |
| 22/07/2018 | 3.9 |
| 22/07/2018 | 3.7 |
| 22/07/2018 | 3.6 |
| 22/07/2018 | 4.2 |
| 22/07/2018 | 4.5 |
| 22/07/2018 | 4 |
| 22/07/2018 | 3.9 |
| 22/07/2018 | 3.9 |
| 22/07/2018 | 3.3 |
| 23/07/2018 | 3 |
| 23/07/2018 | 2.9 |
| 23/07/2018 | 2.9 |
| 23/07/2018 | 2.9 |
| 23/07/2018 | 3 |
| 23/07/2018 | 3.3 |
| 23/07/2018 | 3.5 |
| 23/07/2018 | 4.6 |
| 23/07/2018 | 5.1 |
| 23/07/2018 | 5.7 |
| 23/07/2018 | 5.9 |
| 23/07/2018 | 5.9 |
| 23/07/2018 | 6.1 |
| 23/07/2018 | 5.9 |
| 23/07/2018 | 5.8 |
| 23/07/2018 | 5.8 |
| 23/07/2018 | 5.3 |
| 23/07/2018 | 5.3 |
| 23/07/2018 | 5.9 |
| 23/07/2018 | 5.9 |
| 23/07/2018 | 5.1 |
| 23/07/2018 | 4.6 |
| 23/07/2018 | 4.2 |
| 23/07/2018 | 3.5 |
| 24/07/2018 | 3.2 |
| 24/07/2018 | 3 |
| 24/07/2018 | 2.9 |
| 24/07/2018 | 2.9 |
| 24/07/2018 | 3 |
| 24/07/2018 | 3.2 |
| 24/07/2018 | 3.9 |
| 24/07/2018 | 4.5 |
| 24/07/2018 | 5 |
| 24/07/2018 | 5.5 |
| 24/07/2018 | 6.1 |
| 24/07/2018 | 6.1 |
| 24/07/2018 | 6.4 |
| 24/07/2018 | 6 |
| 24/07/2018 | 6 |
| 24/07/2018 | 6 |
| 24/07/2018 | 5.5 |
| 24/07/2018 | 5.6 |
| 24/07/2018 | 5.6 |
| 24/07/2018 | 5.6 |
| 24/07/2018 | 5.3 |
| 24/07/2018 | 4.8 |
| 24/07/2018 | 4.3 |
| 24/07/2018 | 3.5 |
| 25/07/2018 | 3.3 |
| 25/07/2018 | 3.1 |
| 25/07/2018 | 3 |
| 25/07/2018 | 2.9 |
| 25/07/2018 | 3 |
| 25/07/2018 | 3.3 |
| 25/07/2018 | 3.9 |
| 25/07/2018 | 4.6 |
| 25/07/2018 | 5.1 |
| 25/07/2018 | 5.6 |
| 25/07/2018 | 5.8 |
| 25/07/2018 | 6.2 |
| 25/07/2018 | 6.4 |
| 25/07/2018 | 6 |
| 25/07/2018 | 6 |
| 25/07/2018 | 6 |
| 25/07/2018 | 5.6 |
| 25/07/2018 | 5.5 |
| 25/07/2018 | 5.9 |
| 25/07/2018 | 5.9 |
| 25/07/2018 | 5.2 |
| 25/07/2018 | 4.7 |
| 25/07/2018 | 4.3 |
| 25/07/2018 | 3.6 |
| 26/07/2018 | 3.4 |
| 26/07/2018 | 3.1 |
| 26/07/2018 | 3 |
| 26/07/2018 | 3 |
| 26/07/2018 | 3 |
| 26/07/2018 | 3.3 |
| 26/07/2018 | 3.9 |
| 26/07/2018 | 4.6 |
| 26/07/2018 | 5 |
| 26/07/2018 | 5.5 |
| 26/07/2018 | 6.1 |
| 26/07/2018 | 6.1 |
| 26/07/2018 | 6.4 |
| 26/07/2018 | 6 |
| 26/07/2018 | 6 |
| 26/07/2018 | 5.9 |
| 26/07/2018 | 5.5 |
| 26/07/2018 | 5.5 |
| 26/07/2018 | 5.5 |
| 26/07/2018 | 5.4 |
| 26/07/2018 | 5.3 |
| 26/07/2018 | 4.8 |
| 26/07/2018 | 4.3 |
| 26/07/2018 | 3.6 |
| 27/07/2018 | 3.4 |
| 27/07/2018 | 3.2 |
| 27/07/2018 | 3.1 |
| 27/07/2018 | 3 |
| 27/07/2018 | 3.1 |
| 27/07/2018 | 3.3 |
| 27/07/2018 | 3.9 |
| 27/07/2018 | 4.4 |
| 27/07/2018 | 5 |
| 27/07/2018 | 5.5 |
| 27/07/2018 | 5.6 |
| 27/07/2018 | 6 |
| 27/07/2018 | 6.1 |
| 27/07/2018 | 5.9 |
| 27/07/2018 | 5.8 |
| 27/07/2018 | 5.7 |
| 27/07/2018 | 5.2 |
| 27/07/2018 | 5 |
| 27/07/2018 | 5.3 |
| 27/07/2018 | 5.1 |
| 27/07/2018 | 4.6 |
| 27/07/2018 | 4.3 |
| 27/07/2018 | 4.1 |
| 27/07/2018 | 3.7 |
| 28/07/2018 | 3.1 |
| 28/07/2018 | 3 |
| 28/07/2018 | 2.9 |
| 28/07/2018 | 2.6 |
| 28/07/2018 | 2.6 |
| 28/07/2018 | 2.6 |
| 28/07/2018 | 2.9 |
| 28/07/2018 | 3.2 |
| 28/07/2018 | 3.9 |
| 28/07/2018 | 4.2 |
| 28/07/2018 | 4.5 |
| 28/07/2018 | 4.7 |
| 28/07/2018 | 4.7 |
| 28/07/2018 | 4.6 |
| 28/07/2018 | 4.4 |
| 28/07/2018 | 4.6 |
| 28/07/2018 | 4.2 |
| 28/07/2018 | 4.2 |
| 28/07/2018 | 4.4 |
| 28/07/2018 | 4.3 |
| 28/07/2018 | 4.1 |
| 28/07/2018 | 3.9 |
| 28/07/2018 | 3.7 |
| 28/07/2018 | 3.3 |
| 29/07/2018 | 2.9 |
| 29/07/2018 | 2.9 |
| 29/07/2018 | 2.9 |
| 29/07/2018 | 2.6 |
| 29/07/2018 | 2.5 |
| 29/07/2018 | 2.3 |
| 29/07/2018 | 2.7 |
| 29/07/2018 | 2.9 |
| 29/07/2018 | 3 |
| 29/07/2018 | 3.8 |
| 29/07/2018 | 3.6 |
| 29/07/2018 | 4.2 |
| 29/07/2018 | 4.2 |
| 29/07/2018 | 4.2 |
| 29/07/2018 | 4.1 |
| 29/07/2018 | 3.9 |
| 29/07/2018 | 3.7 |
| 29/07/2018 | 3.6 |
| 29/07/2018 | 4.1 |
| 29/07/2018 | 3.9 |
| 29/07/2018 | 4.2 |
| 29/07/2018 | 4.1 |
| 29/07/2018 | 3.8 |
| 29/07/2018 | 3.2 |
| 30/07/2018 | 2.9 |
| 30/07/2018 | 2.9 |
| 30/07/2018 | 2.4 |
| 30/07/2018 | 2.9 |
| 30/07/2018 | 3 |
| 30/07/2018 | 3.4 |
| 30/07/2018 | 3.6 |
| 30/07/2018 | 4.6 |
| 30/07/2018 | 5.1 |
| 30/07/2018 | 5.7 |
| 30/07/2018 | 5.8 |
| 30/07/2018 | 5.8 |
| 30/07/2018 | 6.1 |
| 30/07/2018 | 5.8 |
| 30/07/2018 | 5.8 |
| 30/07/2018 | 5.8 |
| 30/07/2018 | 5.3 |
| 30/07/2018 | 5.3 |
| 30/07/2018 | 5.2 |
| 30/07/2018 | 5.3 |
| 30/07/2018 | 5.3 |
| 30/07/2018 | 4.8 |
| 30/07/2018 | 4.1 |
| 30/07/2018 | 3.4 |
| 31/07/2018 | 3.1 |
| 31/07/2018 | 3 |
| 31/07/2018 | 2.9 |
| 31/07/2018 | 2.9 |
| 31/07/2018 | 3 |
| 31/07/2018 | 3.3 |
| 31/07/2018 | 3.9 |
| 31/07/2018 | 4.5 |
| 31/07/2018 | 5 |
| 31/07/2018 | 5.5 |
| 31/07/2018 | 6.1 |
| 31/07/2018 | 6.1 |
| 31/07/2018 | 6.3 |
| 31/07/2018 | 6 |
| 31/07/2018 | 6 |
| 31/07/2018 | 5.5 |
| 31/07/2018 | 5.6 |
| 31/07/2018 | 5.5 |
| 31/07/2018 | 5.5 |
| 31/07/2018 | 5.4 |
| 31/07/2018 | 5 |
| 31/07/2018 | 4.9 |
| 31/07/2018 | 4.2 |
| 31/07/2018 | 3.4 |
| 01/08/2018 | 3.3 |
| 01/08/2018 | 3.1 |
| 01/08/2018 | 3 |
| 01/08/2018 | 2.9 |
| 01/08/2018 | 3.1 |
| 01/08/2018 | 3.4 |
| 01/08/2018 | 4 |
| 01/08/2018 | 4.6 |
| 01/08/2018 | 5.1 |
| 01/08/2018 | 5.6 |
| 01/08/2018 | 5.7 |
| 01/08/2018 | 6.2 |
| 01/08/2018 | 5.9 |
| 01/08/2018 | 6 |
| 01/08/2018 | 6 |
| 01/08/2018 | 6 |
| 01/08/2018 | 5.6 |
| 01/08/2018 | 5.5 |
| 01/08/2018 | 5.3 |
| 01/08/2018 | 5.3 |
| 01/08/2018 | 4.9 |
| 01/08/2018 | 4.9 |
| 01/08/2018 | 4.2 |
| 01/08/2018 | 3.5 |
| 02/08/2018 | 3.3 |
| 02/08/2018 | 3.1 |
| 02/08/2018 | 3 |
| 02/08/2018 | 3 |
| 02/08/2018 | 3.1 |
| 02/08/2018 | 3.4 |
| 02/08/2018 | 4 |
| 02/08/2018 | 4.6 |
| 02/08/2018 | 5 |
| 02/08/2018 | 5.5 |
| 02/08/2018 | 6.1 |
| 02/08/2018 | 6.1 |
| 02/08/2018 | 6.3 |
| 02/08/2018 | 6 |
| 02/08/2018 | 5.9 |
| 02/08/2018 | 5.9 |
| 02/08/2018 | 5.5 |
| 02/08/2018 | 5.5 |
| 02/08/2018 | 5.3 |
| 02/08/2018 | 5.3 |
| 02/08/2018 | 5 |
| 02/08/2018 | 5 |
| 02/08/2018 | 4.3 |
| 02/08/2018 | 3.5 |
| 03/08/2018 | 3.4 |
| 03/08/2018 | 3.1 |
| 03/08/2018 | 2.6 |
| 03/08/2018 | 3 |
| 03/08/2018 | 3.1 |
| 03/08/2018 | 3.4 |
| 03/08/2018 | 3.9 |
| 03/08/2018 | 4.4 |
| 03/08/2018 | 4.9 |
| 03/08/2018 | 5.4 |
| 03/08/2018 | 5.6 |
| 03/08/2018 | 6 |
| 03/08/2018 | 6 |
| 03/08/2018 | 5.9 |
| 03/08/2018 | 5.8 |
| 03/08/2018 | 5.7 |
| 03/08/2018 | 5.3 |
| 03/08/2018 | 5 |
| 03/08/2018 | 5.1 |
| 03/08/2018 | 5 |
| 03/08/2018 | 4.8 |
| 03/08/2018 | 4.5 |
| 03/08/2018 | 4 |
| 03/08/2018 | 3.6 |
| 04/08/2018 | 3 |
| 04/08/2018 | 3 |
| 04/08/2018 | 2.9 |
| 04/08/2018 | 2.7 |
| 04/08/2018 | 2.6 |
| 04/08/2018 | 2.7 |
| 04/08/2018 | 2.9 |
| 04/08/2018 | 3.1 |
| 04/08/2018 | 3.9 |
| 04/08/2018 | 4.2 |
| 04/08/2018 | 4.4 |
| 04/08/2018 | 4.6 |
| 04/08/2018 | 4.7 |
| 04/08/2018 | 4.6 |
| 04/08/2018 | 4.4 |
| 04/08/2018 | 4.6 |
| 04/08/2018 | 4.2 |
| 04/08/2018 | 4.2 |
| 04/08/2018 | 3.8 |
| 04/08/2018 | 4.2 |
| 04/08/2018 | 4.2 |
| 04/08/2018 | 4.1 |
| 04/08/2018 | 3.7 |
| 04/08/2018 | 3.2 |
| 05/08/2018 | 2.9 |
| 05/08/2018 | 2.9 |
| 05/08/2018 | 2.9 |
| 05/08/2018 | 2.6 |
| 05/08/2018 | 2.5 |
| 05/08/2018 | 2.4 |
| 05/08/2018 | 2.7 |
| 05/08/2018 | 2.9 |
| 05/08/2018 | 2.9 |
| 05/08/2018 | 3.7 |
| 05/08/2018 | 3.6 |
| 05/08/2018 | 4.1 |
| 05/08/2018 | 4.1 |
| 05/08/2018 | 4.2 |
| 05/08/2018 | 4.1 |
| 05/08/2018 | 3.9 |
| 05/08/2018 | 3.7 |
| 05/08/2018 | 3.6 |
| 05/08/2018 | 3.9 |
| 05/08/2018 | 3.8 |
| 05/08/2018 | 3.8 |
| 05/08/2018 | 4.2 |
| 05/08/2018 | 3.7 |
| 05/08/2018 | 3.1 |
| 06/08/2018 | 2.9 |
| 06/08/2018 | 2.9 |
| 06/08/2018 | 2.4 |
| 06/08/2018 | 2.9 |
| 06/08/2018 | 3.1 |
| 06/08/2018 | 3 |
| 06/08/2018 | 3.6 |
| 06/08/2018 | 4.1 |
| 06/08/2018 | 5.1 |
| 06/08/2018 | 5.1 |
| 06/08/2018 | 5.8 |
| 06/08/2018 | 5.8 |
| 06/08/2018 | 6.1 |
| 06/08/2018 | 5.8 |
| 06/08/2018 | 5.8 |
| 06/08/2018 | 5.8 |
| 06/08/2018 | 5.4 |
| 06/08/2018 | 5.3 |
| 06/08/2018 | 5.1 |
| 06/08/2018 | 5.1 |
| 06/08/2018 | 5 |
| 06/08/2018 | 5 |
| 06/08/2018 | 4.1 |
| 06/08/2018 | 3.3 |
| 07/08/2018 | 3.1 |
| 07/08/2018 | 3 |
| 07/08/2018 | 2.9 |
| 07/08/2018 | 2.9 |
| 07/08/2018 | 3.1 |
| 07/08/2018 | 3.4 |
| 07/08/2018 | 3.5 |
| 07/08/2018 | 4.5 |
| 07/08/2018 | 4.9 |
| 07/08/2018 | 5.4 |
| 07/08/2018 | 5.5 |
| 07/08/2018 | 6 |
| 07/08/2018 | 5.8 |
| 07/08/2018 | 6 |
| 07/08/2018 | 6 |
| 07/08/2018 | 5.5 |
| 07/08/2018 | 5.6 |
| 07/08/2018 | 5 |
| 07/08/2018 | 5.3 |
| 07/08/2018 | 4.8 |
| 07/08/2018 | 5.1 |
| 07/08/2018 | 4.6 |
| 07/08/2018 | 4.1 |
| 07/08/2018 | 3.3 |
| 08/08/2018 | 3.2 |
| 08/08/2018 | 3 |
| 08/08/2018 | 3 |
| 08/08/2018 | 2.9 |
| 08/08/2018 | 3.1 |
| 08/08/2018 | 3.5 |
| 08/08/2018 | 3.5 |
| 08/08/2018 | 4.5 |
| 08/08/2018 | 5 |
| 08/08/2018 | 5.5 |
| 08/08/2018 | 5.7 |
| 08/08/2018 | 6.1 |
| 08/08/2018 | 5.8 |
| 08/08/2018 | 6 |
| 08/08/2018 | 6 |
| 08/08/2018 | 6.1 |
| 08/08/2018 | 5.6 |
| 08/08/2018 | 5.5 |
| 08/08/2018 | 5.1 |
| 08/08/2018 | 5.1 |
| 08/08/2018 | 5.1 |
| 08/08/2018 | 5.1 |
| 08/08/2018 | 4.1 |
| 08/08/2018 | 3.4 |
| 09/08/2018 | 3.3 |
| 09/08/2018 | 3.1 |
| 09/08/2018 | 3 |
| 09/08/2018 | 3 |
| 09/08/2018 | 3.1 |
| 09/08/2018 | 3.5 |
| 09/08/2018 | 3.5 |
| 09/08/2018 | 4.6 |
| 09/08/2018 | 4.9 |
| 09/08/2018 | 5.4 |
| 09/08/2018 | 5.5 |
| 09/08/2018 | 6 |
| 09/08/2018 | 5.8 |
| 09/08/2018 | 6 |
| 09/08/2018 | 5.9 |
| 09/08/2018 | 6 |
| 09/08/2018 | 5.5 |
| 09/08/2018 | 5.5 |
| 09/08/2018 | 5.2 |
| 09/08/2018 | 4.7 |
| 09/08/2018 | 5.1 |
| 09/08/2018 | 4.6 |
| 09/08/2018 | 4.2 |
| 09/08/2018 | 3.5 |
| 10/08/2018 | 3.3 |
| 10/08/2018 | 3.1 |
| 10/08/2018 | 2.6 |
| 10/08/2018 | 3 |
| 10/08/2018 | 3.2 |
| 10/08/2018 | 3.5 |
| 10/08/2018 | 3.5 |
| 10/08/2018 | 4.4 |
| 10/08/2018 | 4.9 |
| 10/08/2018 | 5.4 |
| 10/08/2018 | 5.5 |
| 10/08/2018 | 5.9 |
| 10/08/2018 | 6 |
| 10/08/2018 | 5.9 |
| 10/08/2018 | 5.8 |
| 10/08/2018 | 5.7 |
| 10/08/2018 | 5.3 |
| 10/08/2018 | 5 |
| 10/08/2018 | 5 |
| 10/08/2018 | 4.4 |
| 10/08/2018 | 5 |
| 10/08/2018 | 4.6 |
| 10/08/2018 | 4 |
| 10/08/2018 | 3.6 |
| 11/08/2018 | 3 |
| 11/08/2018 | 3 |
| 11/08/2018 | 2.9 |
| 11/08/2018 | 2.7 |
| 11/08/2018 | 2.7 |
| 11/08/2018 | 2.8 |
| 11/08/2018 | 3 |
| 11/08/2018 | 3.1 |
| 11/08/2018 | 3.4 |
| 11/08/2018 | 4.2 |
| 11/08/2018 | 4.4 |
| 11/08/2018 | 4.6 |
| 11/08/2018 | 4.6 |
| 11/08/2018 | 4.6 |
| 11/08/2018 | 4.4 |
| 11/08/2018 | 4.6 |
| 11/08/2018 | 4.3 |
| 11/08/2018 | 4.2 |
| 11/08/2018 | 3.7 |
| 11/08/2018 | 3.6 |
| 11/08/2018 | 3.9 |
| 11/08/2018 | 4.2 |
| 11/08/2018 | 3.6 |
| 11/08/2018 | 3.1 |
| 12/08/2018 | 2.8 |
| 12/08/2018 | 2.9 |
| 12/08/2018 | 2.4 |
| 12/08/2018 | 2.6 |
| 12/08/2018 | 2.6 |
| 12/08/2018 | 2.5 |
| 12/08/2018 | 2.2 |
| 12/08/2018 | 2.8 |
| 12/08/2018 | 2.9 |
| 12/08/2018 | 3.2 |
| 12/08/2018 | 3.6 |
| 12/08/2018 | 4.1 |
| 12/08/2018 | 4.1 |
| 12/08/2018 | 4.2 |
| 12/08/2018 | 4.1 |
| 12/08/2018 | 3.9 |
| 12/08/2018 | 3.7 |
| 12/08/2018 | 3.6 |
| 12/08/2018 | 3.3 |
| 12/08/2018 | 3.2 |
| 12/08/2018 | 4 |
| 12/08/2018 | 3.8 |
| 12/08/2018 | 3.7 |
| 12/08/2018 | 3 |
| 13/08/2018 | 2.8 |
| 13/08/2018 | 2.8 |
| 13/08/2018 | 2.4 |
| 13/08/2018 | 2.9 |
| 13/08/2018 | 3.1 |
| 13/08/2018 | 3.1 |
| 13/08/2018 | 3.7 |
| 13/08/2018 | 4.1 |
| 13/08/2018 | 5 |
| 13/08/2018 | 5.1 |
| 13/08/2018 | 5.7 |
| 13/08/2018 | 5.7 |
| 13/08/2018 | 6 |
| 13/08/2018 | 5.8 |
| 13/08/2018 | 5.8 |
| 13/08/2018 | 5.8 |
| 13/08/2018 | 5.4 |
| 13/08/2018 | 5.3 |
| 13/08/2018 | 5 |
| 13/08/2018 | 4.5 |
| 13/08/2018 | 5.1 |
| 13/08/2018 | 4.6 |
| 13/08/2018 | 4 |
| 13/08/2018 | 3.2 |
| 14/08/2018 | 3 |
| 14/08/2018 | 2.9 |
| 14/08/2018 | 2.9 |
| 14/08/2018 | 2.9 |
| 14/08/2018 | 3.1 |
| 14/08/2018 | 3.5 |
| 14/08/2018 | 3.5 |
| 14/08/2018 | 4.5 |
| 14/08/2018 | 4.9 |
| 14/08/2018 | 5.4 |
| 14/08/2018 | 5.5 |
| 14/08/2018 | 6 |
| 14/08/2018 | 5.7 |
| 14/08/2018 | 5.9 |
| 14/08/2018 | 6 |
| 14/08/2018 | 5.5 |
| 14/08/2018 | 5.6 |
| 14/08/2018 | 5 |
| 14/08/2018 | 4.7 |
| 14/08/2018 | 4.7 |
| 14/08/2018 | 4.8 |
| 14/08/2018 | 4.8 |
| 14/08/2018 | 4 |
| 14/08/2018 | 3.2 |
| 15/08/2018 | 3.2 |
| 15/08/2018 | 3 |
| 15/08/2018 | 3 |
| 15/08/2018 | 3 |
| 15/08/2018 | 3.2 |
| 15/08/2018 | 3.6 |
| 15/08/2018 | 3.6 |
| 15/08/2018 | 4.5 |
| 15/08/2018 | 5 |
| 15/08/2018 | 5.5 |
| 15/08/2018 | 5.6 |
| 15/08/2018 | 6.1 |
| 15/08/2018 | 5.8 |
| 15/08/2018 | 6 |
| 15/08/2018 | 6 |
| 15/08/2018 | 6.1 |
| 15/08/2018 | 5.6 |
| 15/08/2018 | 5.4 |
| 15/08/2018 | 5 |
| 15/08/2018 | 4.5 |
| 15/08/2018 | 5.2 |
| 15/08/2018 | 4.7 |
| 15/08/2018 | 4.1 |
| 15/08/2018 | 3.3 |
| 16/08/2018 | 3.2 |
| 16/08/2018 | 3.1 |
| 16/08/2018 | 2.5 |
| 16/08/2018 | 3 |
| 16/08/2018 | 3.2 |
| 16/08/2018 | 3.6 |
| 16/08/2018 | 3.6 |
| 16/08/2018 | 4 |
| 16/08/2018 | 4.9 |
| 16/08/2018 | 5.4 |
| 16/08/2018 | 5.5 |
| 16/08/2018 | 6 |
| 16/08/2018 | 5.7 |
| 16/08/2018 | 5.9 |
| 16/08/2018 | 5.9 |
| 16/08/2018 | 6 |
| 16/08/2018 | 5.6 |
| 16/08/2018 | 5.4 |
| 16/08/2018 | 4.6 |
| 16/08/2018 | 4.6 |
| 16/08/2018 | 4.8 |
| 16/08/2018 | 4.8 |
| 16/08/2018 | 4.1 |
| 16/08/2018 | 3.4 |
| 17/08/2018 | 3.3 |
| 17/08/2018 | 3.1 |
| 17/08/2018 | 2.6 |
| 17/08/2018 | 3 |
| 17/08/2018 | 3.2 |
| 17/08/2018 | 3.6 |
| 17/08/2018 | 3.5 |
| 17/08/2018 | 4.4 |
| 17/08/2018 | 4.8 |
| 17/08/2018 | 5.3 |
| 17/08/2018 | 5.5 |
| 17/08/2018 | 5.9 |
| 17/08/2018 | 5.9 |
| 17/08/2018 | 5.9 |
| 17/08/2018 | 5.7 |
| 17/08/2018 | 5.7 |
| 17/08/2018 | 5.3 |
| 17/08/2018 | 5 |
| 17/08/2018 | 4.3 |
| 17/08/2018 | 4.2 |
| 17/08/2018 | 4.6 |
| 17/08/2018 | 4.8 |
| 17/08/2018 | 3.9 |
| 17/08/2018 | 3.5 |
| 18/08/2018 | 3 |
| 18/08/2018 | 3.1 |
| 18/08/2018 | 3 |
| 18/08/2018 | 2.8 |
| 18/08/2018 | 2.9 |
| 18/08/2018 | 3.2 |
| 18/08/2018 | 3.2 |
| 18/08/2018 | 3.4 |
| 18/08/2018 | 3.6 |
| 18/08/2018 | 4.3 |
| 18/08/2018 | 4.4 |
| 18/08/2018 | 5.1 |
| 18/08/2018 | 4.7 |
| 18/08/2018 | 4.7 |
| 18/08/2018 | 4.7 |
| 18/08/2018 | 4.9 |
| 18/08/2018 | 4.7 |
| 18/08/2018 | 4.4 |
| 18/08/2018 | 3.6 |
| 18/08/2018 | 3.1 |
| 18/08/2018 | 4.5 |
| 18/08/2018 | 4.4 |
| 18/08/2018 | 3.8 |
| 18/08/2018 | 3.1 |
| 19/08/2018 | 2.9 |
| 19/08/2018 | 3 |
| 19/08/2018 | 3 |
| 19/08/2018 | 2.8 |
| 19/08/2018 | 2.8 |
| 19/08/2018 | 2.8 |
| 19/08/2018 | 2.8 |
| 19/08/2018 | 3 |
| 19/08/2018 | 3 |
| 19/08/2018 | 3.8 |
| 19/08/2018 | 4.1 |
| 19/08/2018 | 4.1 |
| 19/08/2018 | 4.1 |
| 19/08/2018 | 4.3 |
| 19/08/2018 | 4.3 |
| 19/08/2018 | 4.1 |
| 19/08/2018 | 4.1 |
| 19/08/2018 | 3.8 |
| 19/08/2018 | 3.3 |
| 19/08/2018 | 3.3 |
| 19/08/2018 | 4.6 |
| 19/08/2018 | 4.5 |
| 19/08/2018 | 3.9 |
| 19/08/2018 | 3.1 |
| 20/08/2018 | 2.9 |
| 20/08/2018 | 2.9 |
| 20/08/2018 | 3 |
| 20/08/2018 | 3 |
| 20/08/2018 | 3.3 |
| 20/08/2018 | 3.5 |
| 20/08/2018 | 4.1 |
| 20/08/2018 | 4.7 |
| 20/08/2018 | 5 |
| 20/08/2018 | 5.4 |
| 20/08/2018 | 5.9 |
| 20/08/2018 | 5.9 |
| 20/08/2018 | 6.2 |
| 20/08/2018 | 6.1 |
| 20/08/2018 | 6.2 |
| 20/08/2018 | 6.3 |
| 20/08/2018 | 6 |
| 20/08/2018 | 5.7 |
| 20/08/2018 | 4.6 |
| 20/08/2018 | 4.3 |
| 20/08/2018 | 5.5 |
| 20/08/2018 | 5.4 |
| 20/08/2018 | 4.3 |
| 20/08/2018 | 3.2 |
| 21/08/2018 | 3.1 |
| 21/08/2018 | 3 |
| 21/08/2018 | 3 |
| 21/08/2018 | 3 |
| 21/08/2018 | 3.3 |
| 21/08/2018 | 3.5 |
| 21/08/2018 | 4 |
| 21/08/2018 | 4.6 |
| 21/08/2018 | 4.9 |
| 21/08/2018 | 5.7 |
| 21/08/2018 | 5.7 |
| 21/08/2018 | 6.1 |
| 21/08/2018 | 6.4 |
| 21/08/2018 | 6.2 |
| 21/08/2018 | 6.4 |
| 21/08/2018 | 6.5 |
| 21/08/2018 | 6.2 |
| 21/08/2018 | 5.4 |
| 21/08/2018 | 4.9 |
| 21/08/2018 | 4.6 |
| 21/08/2018 | 5.7 |
| 21/08/2018 | 5.5 |
| 21/08/2018 | 4.3 |
| 21/08/2018 | 3.3 |
| 22/08/2018 | 3.3 |
| 22/08/2018 | 3.1 |
| 22/08/2018 | 3.1 |
| 22/08/2018 | 3.1 |
| 22/08/2018 | 3.3 |
| 22/08/2018 | 3.5 |
| 22/08/2018 | 4.1 |
| 22/08/2018 | 4.7 |
| 22/08/2018 | 5 |
| 22/08/2018 | 5.3 |
| 22/08/2018 | 5.8 |
| 22/08/2018 | 6.2 |
| 22/08/2018 | 6.5 |
| 22/08/2018 | 6.3 |
| 22/08/2018 | 6.4 |
| 22/08/2018 | 6.5 |
| 22/08/2018 | 6.2 |
| 22/08/2018 | 5.9 |
| 22/08/2018 | 4.8 |
| 22/08/2018 | 4.6 |
| 22/08/2018 | 5.6 |
| 22/08/2018 | 5.5 |
| 22/08/2018 | 4.4 |
| 22/08/2018 | 3.4 |
| 23/08/2018 | 3.3 |
| 23/08/2018 | 3.1 |
| 23/08/2018 | 3.1 |
| 23/08/2018 | 3.1 |
| 23/08/2018 | 3.4 |
| 23/08/2018 | 3.5 |
| 23/08/2018 | 4.1 |
| 23/08/2018 | 4.7 |
| 23/08/2018 | 5 |
| 23/08/2018 | 5.8 |
| 23/08/2018 | 5.7 |
| 23/08/2018 | 6.1 |
| 23/08/2018 | 6.4 |
| 23/08/2018 | 6.2 |
| 23/08/2018 | 6.3 |
| 23/08/2018 | 6.4 |
| 23/08/2018 | 6.1 |
| 23/08/2018 | 5.9 |
| 23/08/2018 | 4.9 |
| 23/08/2018 | 4.7 |
| 23/08/2018 | 5.7 |
| 23/08/2018 | 5.5 |
| 23/08/2018 | 4.4 |
| 23/08/2018 | 3.5 |
| 24/08/2018 | 3.4 |
| 24/08/2018 | 3.2 |
| 24/08/2018 | 3.1 |
| 24/08/2018 | 3.1 |
| 24/08/2018 | 3.4 |
| 24/08/2018 | 3.5 |
| 24/08/2018 | 4 |
| 24/08/2018 | 4.6 |
| 24/08/2018 | 4.9 |
| 24/08/2018 | 5.7 |
| 24/08/2018 | 5.7 |
| 24/08/2018 | 6.1 |
| 24/08/2018 | 6.1 |
| 24/08/2018 | 6.1 |
| 24/08/2018 | 6.1 |
| 24/08/2018 | 6.1 |
| 24/08/2018 | 5.8 |
| 24/08/2018 | 5.4 |
| 24/08/2018 | 4.7 |
| 24/08/2018 | 4.5 |
| 24/08/2018 | 5.4 |
| 24/08/2018 | 4.9 |
| 24/08/2018 | 4.2 |
| 24/08/2018 | 3.6 |
| 25/08/2018 | 3 |
| 25/08/2018 | 3 |
| 25/08/2018 | 3 |
| 25/08/2018 | 2.8 |
| 25/08/2018 | 2.8 |
| 25/08/2018 | 3.2 |
| 25/08/2018 | 2.8 |
| 25/08/2018 | 3 |
| 25/08/2018 | 3.7 |
| 25/08/2018 | 4.4 |
| 25/08/2018 | 4.5 |
| 25/08/2018 | 4.6 |
| 25/08/2018 | 4.7 |
| 25/08/2018 | 4.7 |
| 25/08/2018 | 4.6 |
| 25/08/2018 | 4.8 |
| 25/08/2018 | 4.6 |
| 25/08/2018 | 4.4 |
| 25/08/2018 | 3.9 |
| 25/08/2018 | 3.7 |
| 25/08/2018 | 4.8 |
| 25/08/2018 | 4.4 |
| 25/08/2018 | 3.8 |
| 25/08/2018 | 3.1 |
| 26/08/2018 | 2.9 |
| 26/08/2018 | 3 |
| 26/08/2018 | 2.9 |
| 26/08/2018 | 2.7 |
| 26/08/2018 | 2.7 |
| 26/08/2018 | 2.8 |
| 26/08/2018 | 2.4 |
| 26/08/2018 | 2.6 |
| 26/08/2018 | 3.1 |
| 26/08/2018 | 3.3 |
| 26/08/2018 | 4.1 |
| 26/08/2018 | 4.1 |
| 26/08/2018 | 4.1 |
| 26/08/2018 | 4.3 |
| 26/08/2018 | 4.3 |
| 26/08/2018 | 4 |
| 26/08/2018 | 4 |
| 26/08/2018 | 3.8 |
| 26/08/2018 | 3.6 |
| 26/08/2018 | 3.3 |
| 26/08/2018 | 4.3 |
| 26/08/2018 | 4.5 |
| 26/08/2018 | 3.9 |
| 26/08/2018 | 3.1 |
| 27/08/2018 | 2.9 |
| 27/08/2018 | 2.9 |
| 27/08/2018 | 3 |
| 27/08/2018 | 3 |
| 27/08/2018 | 3.3 |
| 27/08/2018 | 3.5 |
| 27/08/2018 | 3.7 |
| 27/08/2018 | 4.3 |
| 27/08/2018 | 5.1 |
| 27/08/2018 | 5.5 |
| 27/08/2018 | 6 |
| 27/08/2018 | 5.9 |
| 27/08/2018 | 6.2 |
| 27/08/2018 | 6 |
| 27/08/2018 | 6.1 |
| 27/08/2018 | 6.2 |
| 27/08/2018 | 5.9 |
| 27/08/2018 | 5.7 |
| 27/08/2018 | 5 |
| 27/08/2018 | 5 |
| 27/08/2018 | 5.7 |
| 27/08/2018 | 5.4 |
| 27/08/2018 | 4.2 |
| 27/08/2018 | 3.3 |
| 28/08/2018 | 3.1 |
| 28/08/2018 | 3 |
| 28/08/2018 | 3 |
| 28/08/2018 | 3 |
| 28/08/2018 | 3.3 |
| 28/08/2018 | 3.4 |
| 28/08/2018 | 4.1 |
| 28/08/2018 | 4.7 |
| 28/08/2018 | 5.1 |
| 28/08/2018 | 5.3 |
| 28/08/2018 | 5.8 |
| 28/08/2018 | 6.1 |
| 28/08/2018 | 6.4 |
| 28/08/2018 | 6.2 |
| 28/08/2018 | 6.3 |
| 28/08/2018 | 6.4 |
| 28/08/2018 | 6.1 |
| 28/08/2018 | 5.4 |
| 28/08/2018 | 4.8 |
| 28/08/2018 | 4.8 |
| 28/08/2018 | 5.4 |
| 28/08/2018 | 5 |
| 28/08/2018 | 4.3 |
| 28/08/2018 | 3.3 |
| 29/08/2018 | 3.2 |
| 29/08/2018 | 3.1 |
| 29/08/2018 | 3.1 |
| 29/08/2018 | 3 |
| 29/08/2018 | 3.3 |
| 29/08/2018 | 3.5 |
| 29/08/2018 | 4.2 |
| 29/08/2018 | 4.8 |
| 29/08/2018 | 5.1 |
| 29/08/2018 | 5.4 |
| 29/08/2018 | 5.9 |
| 29/08/2018 | 6.3 |
| 29/08/2018 | 6.5 |
| 29/08/2018 | 6.2 |
| 29/08/2018 | 6.3 |
| 29/08/2018 | 6.4 |
| 29/08/2018 | 6.1 |
| 29/08/2018 | 5.9 |
| 29/08/2018 | 5.2 |
| 29/08/2018 | 4.7 |
| 29/08/2018 | 5.9 |
| 29/08/2018 | 5.4 |
| 29/08/2018 | 4.3 |
| 29/08/2018 | 3.4 |
| 30/08/2018 | 3.3 |
| 30/08/2018 | 3.1 |
| 30/08/2018 | 3.1 |
| 30/08/2018 | 3.1 |
| 30/08/2018 | 3.3 |
| 30/08/2018 | 3.5 |
| 30/08/2018 | 4.2 |
| 30/08/2018 | 4.9 |
| 30/08/2018 | 5.1 |
| 30/08/2018 | 5.4 |
| 30/08/2018 | 5.8 |
| 30/08/2018 | 6.2 |
| 30/08/2018 | 6.4 |
| 30/08/2018 | 6.2 |
| 30/08/2018 | 6.2 |
| 30/08/2018 | 6.3 |
| 30/08/2018 | 6 |
| 30/08/2018 | 5.4 |
| 30/08/2018 | 5.3 |
| 30/08/2018 | 4.9 |
| 30/08/2018 | 5.4 |
| 30/08/2018 | 5 |
| 30/08/2018 | 4.4 |
| 30/08/2018 | 3.5 |
| 31/08/2018 | 3.3 |
| 31/08/2018 | 3.2 |
| 31/08/2018 | 3.1 |
| 31/08/2018 | 3.1 |
| 31/08/2018 | 3.3 |
| 31/08/2018 | 3.5 |
| 31/08/2018 | 4.1 |
| 31/08/2018 | 4.7 |
| 31/08/2018 | 5 |
| 31/08/2018 | 5.3 |
| 31/08/2018 | 5.8 |
| 31/08/2018 | 6.1 |
| 31/08/2018 | 6.1 |
| 31/08/2018 | 6.1 |
| 31/08/2018 | 6 |
| 31/08/2018 | 6 |
| 31/08/2018 | 5.7 |
| 31/08/2018 | 5.4 |
| 31/08/2018 | 4.6 |
| 31/08/2018 | 4.6 |
| 31/08/2018 | 5.2 |
| 31/08/2018 | 4.9 |
| 31/08/2018 | 4.1 |
| 31/08/2018 | 3.6 |
| 01/09/2018 | 3 |
| 01/09/2018 | 3 |
| 01/09/2018 | 2.9 |
| 01/09/2018 | 2.7 |
| 01/09/2018 | 2.8 |
| 01/09/2018 | 3.2 |
| 01/09/2018 | 2.9 |
| 01/09/2018 | 3.1 |
| 01/09/2018 | 3.8 |
| 01/09/2018 | 4.5 |
| 01/09/2018 | 4.5 |
| 01/09/2018 | 4.6 |
| 01/09/2018 | 4.7 |
| 01/09/2018 | 4.6 |
| 01/09/2018 | 4.6 |
| 01/09/2018 | 4.7 |
| 01/09/2018 | 4.5 |
| 01/09/2018 | 4.5 |
| 01/09/2018 | 3.7 |
| 01/09/2018 | 3.7 |
| 01/09/2018 | 4.5 |
| 01/09/2018 | 4.4 |
| 01/09/2018 | 3.8 |
| 01/09/2018 | 3.1 |
| 02/09/2018 | 2.8 |
| 02/09/2018 | 2.9 |
| 02/09/2018 | 2.9 |
| 02/09/2018 | 2.7 |
| 02/09/2018 | 2.7 |
| 02/09/2018 | 2.8 |
| 02/09/2018 | 2.5 |
| 02/09/2018 | 2.7 |
| 02/09/2018 | 3.2 |
| 02/09/2018 | 3.4 |
| 02/09/2018 | 3.7 |
| 02/09/2018 | 4.1 |
| 02/09/2018 | 4.1 |
| 02/09/2018 | 4.2 |
| 02/09/2018 | 4.2 |
| 02/09/2018 | 3.9 |
| 02/09/2018 | 3.9 |
| 02/09/2018 | 3.8 |
| 02/09/2018 | 3.9 |
| 02/09/2018 | 3.8 |
| 02/09/2018 | 4.5 |
| 02/09/2018 | 4.5 |
| 02/09/2018 | 3.8 |
| 02/09/2018 | 3.1 |
| 03/09/2018 | 2.8 |
| 03/09/2018 | 2.9 |
| 03/09/2018 | 2.5 |
| 03/09/2018 | 3 |
| 03/09/2018 | 2.7 |
| 03/09/2018 | 3.5 |
| 03/09/2018 | 3.9 |
| 03/09/2018 | 4.5 |
| 03/09/2018 | 5.3 |
| 03/09/2018 | 5.6 |
| 03/09/2018 | 5.5 |
| 03/09/2018 | 5.9 |
| 03/09/2018 | 6.2 |
| 03/09/2018 | 6 |
| 03/09/2018 | 6.1 |
| 03/09/2018 | 6.1 |
| 03/09/2018 | 5.8 |
| 03/09/2018 | 5.7 |
| 03/09/2018 | 5.4 |
| 03/09/2018 | 5.2 |
| 03/09/2018 | 5.5 |
| 03/09/2018 | 5.3 |
| 03/09/2018 | 4.2 |
| 03/09/2018 | 3.3 |
| 04/09/2018 | 3.1 |
| 04/09/2018 | 3 |
| 04/09/2018 | 3 |
| 04/09/2018 | 2.9 |
| 04/09/2018 | 3.2 |
| 04/09/2018 | 3.4 |
| 04/09/2018 | 4.3 |
| 04/09/2018 | 4.9 |
| 04/09/2018 | 5.2 |
| 04/09/2018 | 5.4 |
| 04/09/2018 | 5.8 |
| 04/09/2018 | 6.2 |
| 04/09/2018 | 6.4 |
| 04/09/2018 | 6.1 |
| 04/09/2018 | 6.2 |
| 04/09/2018 | 6.3 |
| 04/09/2018 | 6 |
| 04/09/2018 | 5.5 |
| 04/09/2018 | 5.2 |
| 04/09/2018 | 5.5 |
| 04/09/2018 | 5.7 |
| 04/09/2018 | 4.9 |
| 04/09/2018 | 4.3 |
| 04/09/2018 | 3.3 |
| 05/09/2018 | 3.2 |
| 05/09/2018 | 3.1 |
| 05/09/2018 | 3 |
| 05/09/2018 | 3 |
| 05/09/2018 | 3.2 |
| 05/09/2018 | 3.5 |
| 05/09/2018 | 4.3 |
| 05/09/2018 | 4.5 |
| 05/09/2018 | 5.3 |
| 05/09/2018 | 5.6 |
| 05/09/2018 | 6 |
| 05/09/2018 | 6.3 |
| 05/09/2018 | 6.4 |
| 05/09/2018 | 6.1 |
| 05/09/2018 | 6.2 |
| 05/09/2018 | 6.3 |
| 05/09/2018 | 6 |
| 05/09/2018 | 5.4 |
| 05/09/2018 | 5.1 |
| 05/09/2018 | 5.4 |
| 05/09/2018 | 5.6 |
| 05/09/2018 | 4.9 |
| 05/09/2018 | 4.3 |
| 05/09/2018 | 3.4 |
| 06/09/2018 | 3.2 |
| 06/09/2018 | 3.1 |
| 06/09/2018 | 3 |
| 06/09/2018 | 3 |
| 06/09/2018 | 3.2 |
| 06/09/2018 | 3.5 |
| 06/09/2018 | 3.8 |
| 06/09/2018 | 4.5 |
| 06/09/2018 | 5.3 |
| 06/09/2018 | 5.5 |
| 06/09/2018 | 5.8 |
| 06/09/2018 | 6.2 |
| 06/09/2018 | 6.4 |
| 06/09/2018 | 6.1 |
| 06/09/2018 | 6.1 |
| 06/09/2018 | 6.2 |
| 06/09/2018 | 5.9 |
| 06/09/2018 | 5.5 |
| 06/09/2018 | 5.2 |
| 06/09/2018 | 5.6 |
| 06/09/2018 | 5.7 |
| 06/09/2018 | 4.9 |
| 06/09/2018 | 4.3 |
| 06/09/2018 | 3.5 |
| 07/09/2018 | 3.3 |
| 07/09/2018 | 3.1 |
| 07/09/2018 | 2.6 |
| 07/09/2018 | 3 |
| 07/09/2018 | 3.2 |
| 07/09/2018 | 3.5 |
| 07/09/2018 | 4.3 |
| 07/09/2018 | 4.9 |
| 07/09/2018 | 5.2 |
| 07/09/2018 | 5.5 |
| 07/09/2018 | 5.8 |
| 07/09/2018 | 6.1 |
| 07/09/2018 | 6.1 |
| 07/09/2018 | 6 |
| 07/09/2018 | 5.9 |
| 07/09/2018 | 5.9 |
| 07/09/2018 | 5.6 |
| 07/09/2018 | 5.4 |
| 07/09/2018 | 5 |
| 07/09/2018 | 5.3 |
| 07/09/2018 | 5.5 |
| 07/09/2018 | 4.8 |
| 07/09/2018 | 4.1 |
| 07/09/2018 | 3.6 |
| 08/09/2018 | 3 |
| 08/09/2018 | 3 |
| 08/09/2018 | 2.9 |
| 08/09/2018 | 2.7 |
| 08/09/2018 | 2.7 |
| 08/09/2018 | 2.7 |
| 08/09/2018 | 3 |
| 08/09/2018 | 3.2 |
| 08/09/2018 | 3.9 |
| 08/09/2018 | 4.1 |
| 08/09/2018 | 4.6 |
| 08/09/2018 | 4.6 |
| 08/09/2018 | 4.7 |
| 08/09/2018 | 4.6 |
| 08/09/2018 | 4.5 |
| 08/09/2018 | 4.6 |
| 08/09/2018 | 4.4 |
| 08/09/2018 | 4 |
| 08/09/2018 | 4.1 |
| 08/09/2018 | 4.3 |
| 08/09/2018 | 4.7 |
| 08/09/2018 | 4.3 |
| 08/09/2018 | 3.7 |
| 08/09/2018 | 3.1 |
| 09/09/2018 | 2.8 |
| 09/09/2018 | 2.9 |
| 09/09/2018 | 2.9 |
| 09/09/2018 | 2.7 |
| 09/09/2018 | 2.6 |
| 09/09/2018 | 2.8 |
| 09/09/2018 | 2.6 |
| 09/09/2018 | 2.8 |
| 09/09/2018 | 3.3 |
| 09/09/2018 | 3.5 |
| 09/09/2018 | 3.7 |
| 09/09/2018 | 4.1 |
| 09/09/2018 | 4.1 |
| 09/09/2018 | 4.2 |
| 09/09/2018 | 4.1 |
| 09/09/2018 | 3.9 |
| 09/09/2018 | 3.8 |
| 09/09/2018 | 3.9 |
| 09/09/2018 | 3.7 |
| 09/09/2018 | 3.9 |
| 09/09/2018 | 4.2 |
| 09/09/2018 | 4.4 |
| 09/09/2018 | 3.8 |
| 09/09/2018 | 3.1 |
| 10/09/2018 | 2.8 |
| 10/09/2018 | 2.8 |
| 10/09/2018 | 2.4 |
| 10/09/2018 | 2.9 |
| 10/09/2018 | 2.7 |
| 10/09/2018 | 3.5 |
| 10/09/2018 | 4 |
| 10/09/2018 | 4.6 |
| 10/09/2018 | 5.4 |
| 10/09/2018 | 5.7 |
| 10/09/2018 | 5.6 |
| 10/09/2018 | 5.9 |
| 10/09/2018 | 6.2 |
| 10/09/2018 | 5.9 |
| 10/09/2018 | 6 |
| 10/09/2018 | 6 |
| 10/09/2018 | 5.6 |
| 10/09/2018 | 5.3 |
| 10/09/2018 | 5.3 |
| 10/09/2018 | 5.4 |
| 10/09/2018 | 5.8 |
| 10/09/2018 | 4.8 |
| 10/09/2018 | 4.2 |
| 10/09/2018 | 3.3 |
| 11/09/2018 | 3.1 |
| 11/09/2018 | 2.9 |
| 11/09/2018 | 2.9 |
| 11/09/2018 | 2.9 |
| 11/09/2018 | 3.1 |
| 11/09/2018 | 3.4 |
| 11/09/2018 | 3.9 |
| 11/09/2018 | 4.5 |
| 11/09/2018 | 5.3 |
| 11/09/2018 | 5.6 |
| 11/09/2018 | 5.9 |
| 11/09/2018 | 6.2 |
| 11/09/2018 | 6.4 |
| 11/09/2018 | 6.1 |
| 11/09/2018 | 6.1 |
| 11/09/2018 | 5.7 |
| 11/09/2018 | 5.9 |
| 11/09/2018 | 5.5 |
| 11/09/2018 | 5.6 |
| 11/09/2018 | 5.6 |
| 11/09/2018 | 5.5 |
| 11/09/2018 | 4.9 |
| 11/09/2018 | 4.2 |
| 11/09/2018 | 3.3 |
| 12/09/2018 | 3.2 |
| 12/09/2018 | 3 |
| 12/09/2018 | 3 |
| 12/09/2018 | 3 |
| 12/09/2018 | 3.2 |
| 12/09/2018 | 3.5 |
| 12/09/2018 | 4 |
| 12/09/2018 | 4.6 |
| 12/09/2018 | 5.4 |
| 12/09/2018 | 5.7 |
| 12/09/2018 | 6 |
| 12/09/2018 | 6.3 |
| 12/09/2018 | 5.9 |
| 12/09/2018 | 6.1 |
| 12/09/2018 | 6.1 |
| 12/09/2018 | 6.2 |
| 12/09/2018 | 5.8 |
| 12/09/2018 | 5.5 |
| 12/09/2018 | 5.5 |
| 12/09/2018 | 5.6 |
| 12/09/2018 | 5.9 |
| 12/09/2018 | 4.8 |
| 12/09/2018 | 4.3 |
| 12/09/2018 | 3.4 |
| 13/09/2018 | 3.2 |
| 13/09/2018 | 3.1 |
| 13/09/2018 | 3 |
| 13/09/2018 | 3 |
| 13/09/2018 | 3.2 |
| 13/09/2018 | 3.5 |
| 13/09/2018 | 4 |
| 13/09/2018 | 4.7 |
| 13/09/2018 | 5.4 |
| 13/09/2018 | 5.6 |
| 13/09/2018 | 5.9 |
| 13/09/2018 | 6.2 |
| 13/09/2018 | 6.4 |
| 13/09/2018 | 6.1 |
| 13/09/2018 | 6 |
| 13/09/2018 | 6.1 |
| 13/09/2018 | 5.7 |
| 13/09/2018 | 5.5 |
| 13/09/2018 | 5.6 |
| 13/09/2018 | 5.8 |
| 13/09/2018 | 5.5 |
| 13/09/2018 | 4.9 |
| 13/09/2018 | 4.3 |
| 13/09/2018 | 3.5 |
| 14/09/2018 | 3.3 |
| 14/09/2018 | 3.1 |
| 14/09/2018 | 2.5 |
| 14/09/2018 | 3 |
| 14/09/2018 | 3.2 |
| 14/09/2018 | 3.4 |
| 14/09/2018 | 3.9 |
| 14/09/2018 | 4.5 |
| 14/09/2018 | 5.3 |
| 14/09/2018 | 5.6 |
| 14/09/2018 | 5.9 |
| 14/09/2018 | 6.1 |
| 14/09/2018 | 6.1 |
| 14/09/2018 | 6 |
| 14/09/2018 | 5.8 |
| 14/09/2018 | 5.8 |
| 14/09/2018 | 5.5 |
| 14/09/2018 | 5.5 |
| 14/09/2018 | 5.4 |
| 14/09/2018 | 5.4 |
| 14/09/2018 | 5.2 |
| 14/09/2018 | 4.8 |
| 14/09/2018 | 4.1 |
| 14/09/2018 | 3.6 |
| 15/09/2018 | 3 |
| 15/09/2018 | 2.9 |
| 15/09/2018 | 2.9 |
| 15/09/2018 | 2.7 |
| 15/09/2018 | 2.7 |
| 15/09/2018 | 2.6 |
| 15/09/2018 | 3.1 |
| 15/09/2018 | 3.3 |
| 15/09/2018 | 4 |
| 15/09/2018 | 4.2 |
| 15/09/2018 | 4.6 |
| 15/09/2018 | 4.7 |
| 15/09/2018 | 4.7 |
| 15/09/2018 | 4.6 |
| 15/09/2018 | 4.4 |
| 15/09/2018 | 4.6 |
| 15/09/2018 | 4.3 |
| 15/09/2018 | 4 |
| 15/09/2018 | 4.4 |
| 15/09/2018 | 4.9 |
| 15/09/2018 | 4.5 |
| 15/09/2018 | 4.3 |
| 15/09/2018 | 3.7 |
| 15/09/2018 | 3.1 |
| 16/09/2018 | 2.8 |
| 16/09/2018 | 2.9 |
| 16/09/2018 | 2.3 |
| 16/09/2018 | 2.6 |
| 16/09/2018 | 2.6 |
| 16/09/2018 | 2.8 |
| 16/09/2018 | 2.7 |
| 16/09/2018 | 2.9 |
| 16/09/2018 | 3.4 |
| 16/09/2018 | 3.6 |
| 16/09/2018 | 3.7 |
| 16/09/2018 | 4.1 |
| 16/09/2018 | 4.1 |
| 16/09/2018 | 4.2 |
| 16/09/2018 | 4.1 |
| 16/09/2018 | 3.8 |
| 16/09/2018 | 3.7 |
| 16/09/2018 | 3.9 |
| 16/09/2018 | 4 |
| 16/09/2018 | 4.4 |
| 16/09/2018 | 4.5 |
| 16/09/2018 | 3.9 |
| 16/09/2018 | 3.8 |
| 16/09/2018 | 3.1 |
| 17/09/2018 | 2.8 |
| 17/09/2018 | 2.8 |
| 17/09/2018 | 2.4 |
| 17/09/2018 | 2.4 |
| 17/09/2018 | 2.6 |
| 17/09/2018 | 3.5 |
| 17/09/2018 | 4.1 |
| 17/09/2018 | 4.8 |
| 17/09/2018 | 5 |
| 17/09/2018 | 5.3 |
| 17/09/2018 | 5.7 |
| 17/09/2018 | 5.9 |
| 17/09/2018 | 6.1 |
| 17/09/2018 | 5.9 |
| 17/09/2018 | 5.9 |
| 17/09/2018 | 5.9 |
| 17/09/2018 | 5.5 |
| 17/09/2018 | 5.3 |
| 17/09/2018 | 5.7 |
| 17/09/2018 | 6 |
| 17/09/2018 | 5.6 |
| 17/09/2018 | 4.7 |
| 17/09/2018 | 4.1 |
| 17/09/2018 | 3.3 |
| 18/09/2018 | 3 |
| 18/09/2018 | 2.9 |
| 18/09/2018 | 2.9 |
| 18/09/2018 | 2.9 |
| 18/09/2018 | 3.1 |
| 18/09/2018 | 3.4 |
| 18/09/2018 | 4 |
| 18/09/2018 | 4.7 |
| 18/09/2018 | 5.5 |
| 18/09/2018 | 5.7 |
| 18/09/2018 | 5.9 |
| 18/09/2018 | 6.2 |
| 18/09/2018 | 5.9 |
| 18/09/2018 | 6 |
| 18/09/2018 | 6 |
| 18/09/2018 | 5.6 |
| 18/09/2018 | 5.7 |
| 18/09/2018 | 5.6 |
| 18/09/2018 | 5.5 |
| 18/09/2018 | 6.3 |
| 18/09/2018 | 5.7 |
| 18/09/2018 | 4.9 |
| 18/09/2018 | 4.2 |
| 18/09/2018 | 3.3 |
| 19/09/2018 | 3.2 |
| 19/09/2018 | 3 |
| 19/09/2018 | 3 |
| 19/09/2018 | 2.9 |
| 19/09/2018 | 3.1 |
| 19/09/2018 | 3.5 |
| 19/09/2018 | 4.1 |
| 19/09/2018 | 4.8 |
| 19/09/2018 | 5.6 |
| 19/09/2018 | 5.8 |
| 19/09/2018 | 6.1 |
| 19/09/2018 | 6.3 |
| 19/09/2018 | 5.9 |
| 19/09/2018 | 6 |
| 19/09/2018 | 6 |
| 19/09/2018 | 6.1 |
| 19/09/2018 | 5.7 |
| 19/09/2018 | 5.5 |
| 19/09/2018 | 5.9 |
| 19/09/2018 | 6.3 |
| 19/09/2018 | 5.7 |
| 19/09/2018 | 4.8 |
| 19/09/2018 | 4.2 |
| 19/09/2018 | 3.4 |
| 20/09/2018 | 3.2 |
| 20/09/2018 | 3 |
| 20/09/2018 | 2.5 |
| 20/09/2018 | 2.9 |
| 20/09/2018 | 2.6 |
| 20/09/2018 | 3.4 |
| 20/09/2018 | 4.1 |
| 20/09/2018 | 4.8 |
| 20/09/2018 | 5.5 |
| 20/09/2018 | 5.7 |
| 20/09/2018 | 6 |
| 20/09/2018 | 6.2 |
| 20/09/2018 | 6.4 |
| 20/09/2018 | 6 |
| 20/09/2018 | 6 |
| 20/09/2018 | 6 |
| 20/09/2018 | 5.6 |
| 20/09/2018 | 5.5 |
| 20/09/2018 | 6 |
| 20/09/2018 | 6.5 |
| 20/09/2018 | 5.8 |
| 20/09/2018 | 4.8 |
| 20/09/2018 | 4.3 |
| 20/09/2018 | 3.5 |
| 21/09/2018 | 3.3 |
| 21/09/2018 | 3.1 |
| 21/09/2018 | 2.5 |
| 21/09/2018 | 2.9 |
| 21/09/2018 | 2.6 |
| 21/09/2018 | 3.4 |
| 21/09/2018 | 4 |
| 21/09/2018 | 4.7 |
| 21/09/2018 | 5.5 |
| 21/09/2018 | 5.7 |
| 21/09/2018 | 6 |
| 21/09/2018 | 6.1 |
| 21/09/2018 | 6.1 |
| 21/09/2018 | 5.9 |
| 21/09/2018 | 5.8 |
| 21/09/2018 | 5.7 |
| 21/09/2018 | 5.3 |
| 21/09/2018 | 5.5 |
| 21/09/2018 | 5.3 |
| 21/09/2018 | 6.1 |
| 21/09/2018 | 5.5 |
| 21/09/2018 | 4.7 |
| 21/09/2018 | 4 |
| 21/09/2018 | 3.6 |
| 22/09/2018 | 2.9 |
| 22/09/2018 | 2.9 |
| 22/09/2018 | 2.8 |
| 22/09/2018 | 2.6 |
| 22/09/2018 | 2.6 |
| 22/09/2018 | 2.6 |
| 22/09/2018 | 3.2 |
| 22/09/2018 | 3.4 |
| 22/09/2018 | 4.1 |
| 22/09/2018 | 4.2 |
| 22/09/2018 | 4.7 |
| 22/09/2018 | 4.7 |
| 22/09/2018 | 4.7 |
| 22/09/2018 | 4.5 |
| 22/09/2018 | 4.4 |
| 22/09/2018 | 4.5 |
| 22/09/2018 | 4.2 |
| 22/09/2018 | 4.1 |
| 22/09/2018 | 4.8 |
| 22/09/2018 | 5 |
| 22/09/2018 | 4.7 |
| 22/09/2018 | 4.2 |
| 22/09/2018 | 3.7 |
| 22/09/2018 | 3.1 |
| 23/09/2018 | 2.8 |
| 23/09/2018 | 2.8 |
| 23/09/2018 | 2.3 |
| 23/09/2018 | 2.6 |
| 23/09/2018 | 2.5 |
| 23/09/2018 | 2.8 |
| 23/09/2018 | 2.8 |
| 23/09/2018 | 3 |
| 23/09/2018 | 3.5 |
| 23/09/2018 | 3.6 |
| 23/09/2018 | 3.8 |
| 23/09/2018 | 4.1 |
| 23/09/2018 | 4.1 |
| 23/09/2018 | 4.1 |
| 23/09/2018 | 4 |
| 23/09/2018 | 3.7 |
| 23/09/2018 | 3.6 |
| 23/09/2018 | 3.9 |
| 23/09/2018 | 4.4 |
| 23/09/2018 | 5 |
| 23/09/2018 | 4.7 |
| 23/09/2018 | 3.8 |
| 23/09/2018 | 3.8 |
| 23/09/2018 | 3.1 |
| 24/09/2018 | 2.8 |
| 24/09/2018 | 2.8 |
| 24/09/2018 | 2.4 |
| 24/09/2018 | 2.3 |
| 24/09/2018 | 2.6 |
| 24/09/2018 | 2.9 |
| 24/09/2018 | 4.3 |
| 24/09/2018 | 4.9 |
| 24/09/2018 | 5.2 |
| 24/09/2018 | 5.4 |
| 24/09/2018 | 5.7 |
| 24/09/2018 | 5.9 |
| 24/09/2018 | 6.1 |
| 24/09/2018 | 5.8 |
| 24/09/2018 | 5.8 |
| 24/09/2018 | 5.8 |
| 24/09/2018 | 5.4 |
| 24/09/2018 | 5.4 |
| 24/09/2018 | 6.1 |
| 24/09/2018 | 6.3 |
| 24/09/2018 | 5.8 |
| 24/09/2018 | 4.7 |
| 24/09/2018 | 4.1 |
| 24/09/2018 | 3.3 |
| 25/09/2018 | 3 |
| 25/09/2018 | 2.9 |
| 25/09/2018 | 2.9 |
| 25/09/2018 | 2.8 |
| 25/09/2018 | 3 |
| 25/09/2018 | 3.4 |
| 25/09/2018 | 4.2 |
| 25/09/2018 | 4.8 |
| 25/09/2018 | 5.1 |
| 25/09/2018 | 5.8 |
| 25/09/2018 | 6 |
| 25/09/2018 | 6.2 |
| 25/09/2018 | 5.9 |
| 25/09/2018 | 6 |
| 25/09/2018 | 6 |
| 25/09/2018 | 5.5 |
| 25/09/2018 | 5.6 |
| 25/09/2018 | 5.6 |
| 25/09/2018 | 5.9 |
| 25/09/2018 | 6.6 |
| 25/09/2018 | 6 |
| 25/09/2018 | 4.8 |
| 25/09/2018 | 4.2 |
| 25/09/2018 | 3.3 |
| 26/09/2018 | 3.1 |
| 26/09/2018 | 3 |
| 26/09/2018 | 2.9 |
| 26/09/2018 | 2.9 |
| 26/09/2018 | 2.6 |
| 26/09/2018 | 3.4 |
| 26/09/2018 | 4.2 |
| 26/09/2018 | 4.9 |
| 26/09/2018 | 5.2 |
| 26/09/2018 | 5.9 |
| 26/09/2018 | 6.2 |
| 26/09/2018 | 5.8 |
| 26/09/2018 | 5.9 |
| 26/09/2018 | 6 |
| 26/09/2018 | 6 |
| 26/09/2018 | 6 |
| 26/09/2018 | 5.6 |
| 26/09/2018 | 5.6 |
| 26/09/2018 | 5.8 |
| 26/09/2018 | 6.5 |
| 26/09/2018 | 6 |
| 26/09/2018 | 4.7 |
| 26/09/2018 | 4.2 |
| 26/09/2018 | 3.4 |
| 27/09/2018 | 3.2 |
| 27/09/2018 | 3 |
| 27/09/2018 | 2.4 |
| 27/09/2018 | 2.9 |
| 27/09/2018 | 2.6 |
| 27/09/2018 | 3.4 |
| 27/09/2018 | 4.2 |
| 27/09/2018 | 5 |
| 27/09/2018 | 5.2 |
| 27/09/2018 | 5.8 |
| 27/09/2018 | 6 |
| 27/09/2018 | 6.2 |
| 27/09/2018 | 5.9 |
| 27/09/2018 | 6 |
| 27/09/2018 | 5.9 |
| 27/09/2018 | 5.9 |
| 27/09/2018 | 5.5 |
| 27/09/2018 | 5.6 |
| 27/09/2018 | 5.9 |
| 27/09/2018 | 6.7 |
| 27/09/2018 | 5.6 |
| 27/09/2018 | 4.8 |
| 27/09/2018 | 4.2 |
| 27/09/2018 | 3.5 |
| 28/09/2018 | 3.3 |
| 28/09/2018 | 3 |
| 28/09/2018 | 2.5 |
| 28/09/2018 | 2.9 |
| 28/09/2018 | 2.6 |
| 28/09/2018 | 3.4 |
| 28/09/2018 | 4.2 |
| 28/09/2018 | 4.8 |
| 28/09/2018 | 5.6 |
| 28/09/2018 | 5.8 |
| 28/09/2018 | 6 |
| 28/09/2018 | 5.6 |
| 28/09/2018 | 6.1 |
| 28/09/2018 | 5.9 |
| 28/09/2018 | 5.7 |
| 28/09/2018 | 5.6 |
| 28/09/2018 | 5.2 |
| 28/09/2018 | 5.1 |
| 28/09/2018 | 5.7 |
| 28/09/2018 | 6.3 |
| 28/09/2018 | 5.3 |
| 28/09/2018 | 4.2 |
| 28/09/2018 | 4 |
| 28/09/2018 | 3.6 |
| 29/09/2018 | 2.9 |
| 29/09/2018 | 2.9 |
| 29/09/2018 | 2.8 |
| 29/09/2018 | 2.6 |
| 29/09/2018 | 2.6 |
| 29/09/2018 | 2.6 |
| 29/09/2018 | 3.3 |
| 29/09/2018 | 3.5 |
| 29/09/2018 | 3.7 |
| 29/09/2018 | 4.3 |
| 29/09/2018 | 4.8 |
| 29/09/2018 | 4.7 |
| 29/09/2018 | 4.7 |
| 29/09/2018 | 4.5 |
| 29/09/2018 | 4.3 |
| 29/09/2018 | 4.4 |
| 29/09/2018 | 4.1 |
| 29/09/2018 | 4.1 |
| 29/09/2018 | 4.6 |
| 29/09/2018 | 5.6 |
| 29/09/2018 | 5 |
| 29/09/2018 | 3.7 |
| 29/09/2018 | 3.7 |
| 29/09/2018 | 3.1 |
| 30/09/2018 | 2.8 |
| 30/09/2018 | 2.8 |
| 30/09/2018 | 2.3 |
| 30/09/2018 | 2.5 |
| 30/09/2018 | 2.5 |
| 30/09/2018 | 2.2 |
| 30/09/2018 | 2.8 |
| 30/09/2018 | 3.1 |
| 30/09/2018 | 3.6 |
| 30/09/2018 | 3.7 |
| 30/09/2018 | 3.8 |
| 30/09/2018 | 4.1 |
| 30/09/2018 | 4.1 |
| 30/09/2018 | 4.1 |
| 30/09/2018 | 4 |
| 30/09/2018 | 3.7 |
| 30/09/2018 | 3.5 |
| 30/09/2018 | 4 |
| 30/09/2018 | 4.7 |
| 30/09/2018 | 5.1 |
| 30/09/2018 | 4.4 |
| 30/09/2018 | 3.8 |
| 30/09/2018 | 3.7 |
| 30/09/2018 | 3.1 |
| 01/10/2018 | 2.8 |
| 01/10/2018 | 2.8 |
| 01/10/2018 | 2.3 |
| 01/10/2018 | 2.3 |
| 01/10/2018 | 2.5 |
| 01/10/2018 | 2.9 |
| 01/10/2018 | 3.9 |
| 01/10/2018 | 4.6 |
| 01/10/2018 | 5.3 |
| 01/10/2018 | 5.6 |
| 01/10/2018 | 5.8 |
| 01/10/2018 | 5.9 |
| 01/10/2018 | 5.6 |
| 01/10/2018 | 5.8 |
| 01/10/2018 | 5.7 |
| 01/10/2018 | 5.2 |
| 01/10/2018 | 5.3 |
| 01/10/2018 | 5.4 |
| 01/10/2018 | 6 |
| 01/10/2018 | 7 |
| 01/10/2018 | 5.6 |
| 01/10/2018 | 4.6 |
| 01/10/2018 | 4.1 |
| 01/10/2018 | 3.3 |
| 02/10/2018 | 3 |
| 02/10/2018 | 2.9 |
| 02/10/2018 | 2.8 |
| 02/10/2018 | 2.8 |
| 02/10/2018 | 2.5 |
| 02/10/2018 | 3.4 |
| 02/10/2018 | 4.3 |
| 02/10/2018 | 5 |
| 02/10/2018 | 5.3 |
| 02/10/2018 | 5.9 |
| 02/10/2018 | 6.1 |
| 02/10/2018 | 6.2 |
| 02/10/2018 | 5.9 |
| 02/10/2018 | 5.9 |
| 02/10/2018 | 5.9 |
| 02/10/2018 | 5.4 |
| 02/10/2018 | 5.5 |
| 02/10/2018 | 5.2 |
| 02/10/2018 | 6.3 |
| 02/10/2018 | 6.8 |
| 02/10/2018 | 5.8 |
| 02/10/2018 | 4.8 |
| 02/10/2018 | 4.1 |
| 02/10/2018 | 3.4 |
| 03/10/2018 | 2.6 |
| 03/10/2018 | 2.7 |
| 03/10/2018 | 2.6 |
| 03/10/2018 | 2.4 |
| 03/10/2018 | 2.3 |
| 03/10/2018 | 2.6 |
| 03/10/2018 | 2.8 |
| 03/10/2018 | 2.7 |
| 03/10/2018 | 3.5 |
| 03/10/2018 | 3.7 |
| 03/10/2018 | 3.8 |
| 03/10/2018 | 3.9 |
| 03/10/2018 | 4 |
| 03/10/2018 | 3.9 |
| 03/10/2018 | 3.6 |
| 03/10/2018 | 3.8 |
| 03/10/2018 | 3.6 |
| 03/10/2018 | 3.6 |
| 03/10/2018 | 4.6 |
| 03/10/2018 | 5.5 |
| 03/10/2018 | 4.6 |
| 03/10/2018 | 3.8 |
| 03/10/2018 | 3.8 |
| 03/10/2018 | 3 |
| 04/10/2018 | 3.3 |
| 04/10/2018 | 3 |
| 04/10/2018 | 2.5 |
| 04/10/2018 | 2.9 |
| 04/10/2018 | 2.6 |
| 04/10/2018 | 3.5 |
| 04/10/2018 | 4.4 |
| 04/10/2018 | 5.2 |
| 04/10/2018 | 5.4 |
| 04/10/2018 | 6 |
| 04/10/2018 | 6.2 |
| 04/10/2018 | 5.9 |
| 04/10/2018 | 6 |
| 04/10/2018 | 6.1 |
| 04/10/2018 | 6 |
| 04/10/2018 | 5.5 |
| 04/10/2018 | 5.7 |
| 04/10/2018 | 5.9 |
| 04/10/2018 | 6.5 |
| 04/10/2018 | 7.2 |
| 04/10/2018 | 5.8 |
| 04/10/2018 | 4.9 |
| 04/10/2018 | 4.3 |
| 04/10/2018 | 3.6 |
| 05/10/2018 | 3.4 |
| 05/10/2018 | 2.6 |
| 05/10/2018 | 2.5 |
| 05/10/2018 | 2.5 |
| 05/10/2018 | 2.6 |
| 05/10/2018 | 3.5 |
| 05/10/2018 | 4.3 |
| 05/10/2018 | 5.1 |
| 05/10/2018 | 5.4 |
| 05/10/2018 | 6.1 |
| 05/10/2018 | 5.8 |
| 05/10/2018 | 5.9 |
| 05/10/2018 | 5.8 |
| 05/10/2018 | 6.1 |
| 05/10/2018 | 5.9 |
| 05/10/2018 | 5.4 |
| 05/10/2018 | 5.6 |
| 05/10/2018 | 5.5 |
| 05/10/2018 | 6.3 |
| 05/10/2018 | 6.8 |
| 05/10/2018 | 5.5 |
| 05/10/2018 | 4.3 |
| 05/10/2018 | 4.1 |
| 05/10/2018 | 3.8 |
| 06/10/2018 | 3.1 |
| 06/10/2018 | 3 |
| 06/10/2018 | 2.9 |
| 06/10/2018 | 2.7 |
| 06/10/2018 | 2.6 |
| 06/10/2018 | 2.7 |
| 06/10/2018 | 3.4 |
| 06/10/2018 | 3.8 |
| 06/10/2018 | 4 |
| 06/10/2018 | 4.6 |
| 06/10/2018 | 5 |
| 06/10/2018 | 5 |
| 06/10/2018 | 4.9 |
| 06/10/2018 | 4.7 |
| 06/10/2018 | 4.6 |
| 06/10/2018 | 4.2 |
| 06/10/2018 | 4 |
| 06/10/2018 | 4.6 |
| 06/10/2018 | 5.2 |
| 06/10/2018 | 5.5 |
| 06/10/2018 | 4.7 |
| 06/10/2018 | 3.9 |
| 06/10/2018 | 3.8 |
| 06/10/2018 | 3.3 |
| 07/10/2018 | 2.9 |
| 07/10/2018 | 3 |
| 07/10/2018 | 2.4 |
| 07/10/2018 | 2.6 |
| 07/10/2018 | 2.6 |
| 07/10/2018 | 2.3 |
| 07/10/2018 | 3 |
| 07/10/2018 | 3.3 |
| 07/10/2018 | 3.3 |
| 07/10/2018 | 4 |
| 07/10/2018 | 4.1 |
| 07/10/2018 | 4.4 |
| 07/10/2018 | 4.4 |
| 07/10/2018 | 4.4 |
| 07/10/2018 | 4.3 |
| 07/10/2018 | 4 |
| 07/10/2018 | 4 |
| 07/10/2018 | 4 |
| 07/10/2018 | 4.7 |
| 07/10/2018 | 5.4 |
| 07/10/2018 | 4.7 |
| 07/10/2018 | 4 |
| 07/10/2018 | 3.9 |
| 07/10/2018 | 3.4 |
| 08/10/2018 | 3 |
| 08/10/2018 | 2.9 |
| 08/10/2018 | 2.5 |
| 08/10/2018 | 2.4 |
| 08/10/2018 | 2.7 |
| 08/10/2018 | 3.1 |
| 08/10/2018 | 4.1 |
| 08/10/2018 | 5 |
| 08/10/2018 | 5.7 |
| 08/10/2018 | 6 |
| 08/10/2018 | 6.2 |
| 08/10/2018 | 5.9 |
| 08/10/2018 | 6.1 |
| 08/10/2018 | 6.2 |
| 08/10/2018 | 5.7 |
| 08/10/2018 | 5.8 |
| 08/10/2018 | 5.5 |
| 08/10/2018 | 5.8 |
| 08/10/2018 | 6.7 |
| 08/10/2018 | 7.2 |
| 08/10/2018 | 5.9 |
| 08/10/2018 | 5 |
| 08/10/2018 | 4.3 |
| 08/10/2018 | 3.6 |
| 09/10/2018 | 3.3 |
| 09/10/2018 | 3.1 |
| 09/10/2018 | 3 |
| 09/10/2018 | 3 |
| 09/10/2018 | 2.7 |
| 09/10/2018 | 3.5 |
| 09/10/2018 | 4.5 |
| 09/10/2018 | 5.4 |
| 09/10/2018 | 5.7 |
| 09/10/2018 | 5.9 |
| 09/10/2018 | 6.1 |
| 09/10/2018 | 6.3 |
| 09/10/2018 | 6.4 |
| 09/10/2018 | 6.5 |
| 09/10/2018 | 6 |
| 09/10/2018 | 6.1 |
| 09/10/2018 | 5.9 |
| 09/10/2018 | 6.2 |
| 09/10/2018 | 7.1 |
| 09/10/2018 | 7.4 |
| 09/10/2018 | 6.1 |
| 09/10/2018 | 4.6 |
| 09/10/2018 | 4.5 |
| 09/10/2018 | 3.7 |
| 10/10/2018 | 3.5 |
| 10/10/2018 | 3.2 |
| 10/10/2018 | 2.6 |
| 10/10/2018 | 3 |
| 10/10/2018 | 2.7 |
| 10/10/2018 | 3.6 |
| 10/10/2018 | 4.6 |
| 10/10/2018 | 5.1 |
| 10/10/2018 | 5.8 |
| 10/10/2018 | 6 |
| 10/10/2018 | 6.3 |
| 10/10/2018 | 6.5 |
| 10/10/2018 | 6.6 |
| 10/10/2018 | 6.6 |
| 10/10/2018 | 6.1 |
| 10/10/2018 | 6.2 |
| 10/10/2018 | 6.1 |
| 10/10/2018 | 6.2 |
| 10/10/2018 | 7 |
| 10/10/2018 | 7.3 |
| 10/10/2018 | 6 |
| 10/10/2018 | 5.1 |
| 10/10/2018 | 4.1 |
| 10/10/2018 | 3.8 |
| 11/10/2018 | 3.5 |
| 11/10/2018 | 3.2 |
| 11/10/2018 | 2.7 |
| 11/10/2018 | 2.6 |
| 11/10/2018 | 2.8 |
| 11/10/2018 | 3.6 |
| 11/10/2018 | 4.6 |
| 11/10/2018 | 5.1 |
| 11/10/2018 | 5.8 |
| 11/10/2018 | 6 |
| 11/10/2018 | 6.3 |
| 11/10/2018 | 6.4 |
| 11/10/2018 | 6.6 |
| 11/10/2018 | 6.7 |
| 11/10/2018 | 6.1 |
| 11/10/2018 | 6.2 |
| 11/10/2018 | 6.1 |
| 11/10/2018 | 6.4 |
| 11/10/2018 | 7.2 |
| 11/10/2018 | 7.4 |
| 11/10/2018 | 6.1 |
| 11/10/2018 | 4.7 |
| 11/10/2018 | 4.1 |
| 11/10/2018 | 3.9 |
| 12/10/2018 | 3.1 |
| 12/10/2018 | 2.8 |
| 12/10/2018 | 2.7 |
| 12/10/2018 | 2.6 |
| 12/10/2018 | 2.8 |
| 12/10/2018 | 3.6 |
| 12/10/2018 | 4.6 |
| 12/10/2018 | 5.5 |
| 12/10/2018 | 5.8 |
| 12/10/2018 | 6 |
| 12/10/2018 | 6.3 |
| 12/10/2018 | 6.4 |
| 12/10/2018 | 6.4 |
| 12/10/2018 | 6.1 |
| 12/10/2018 | 6 |
| 12/10/2018 | 6 |
| 12/10/2018 | 5.9 |
| 12/10/2018 | 6 |
| 12/10/2018 | 7 |
| 12/10/2018 | 6.9 |
| 12/10/2018 | 5.8 |
| 12/10/2018 | 4.7 |
| 12/10/2018 | 4 |
| 12/10/2018 | 3.6 |
| 13/10/2018 | 3.4 |
| 13/10/2018 | 3.2 |
| 13/10/2018 | 3.1 |
| 13/10/2018 | 2.8 |
| 13/10/2018 | 2.8 |
| 13/10/2018 | 2.8 |
| 13/10/2018 | 3.6 |
| 13/10/2018 | 4.1 |
| 13/10/2018 | 4.3 |
| 13/10/2018 | 5 |
| 13/10/2018 | 5 |
| 13/10/2018 | 5.4 |
| 13/10/2018 | 5.4 |
| 13/10/2018 | 5.2 |
| 13/10/2018 | 5 |
| 13/10/2018 | 4.8 |
| 13/10/2018 | 4.8 |
| 13/10/2018 | 4.9 |
| 13/10/2018 | 5.8 |
| 13/10/2018 | 6.1 |
| 13/10/2018 | 4.9 |
| 13/10/2018 | 4.2 |
| 13/10/2018 | 4.1 |
| 13/10/2018 | 3.6 |
| 14/10/2018 | 3.2 |
| 14/10/2018 | 3.2 |
| 14/10/2018 | 2.6 |
| 14/10/2018 | 2.8 |
| 14/10/2018 | 2.7 |
| 14/10/2018 | 2.5 |
| 14/10/2018 | 3.1 |
| 14/10/2018 | 3.6 |
| 14/10/2018 | 3.6 |
| 14/10/2018 | 4.3 |
| 14/10/2018 | 4.5 |
| 14/10/2018 | 4.4 |
| 14/10/2018 | 4.8 |
| 14/10/2018 | 4.3 |
| 14/10/2018 | 4.2 |
| 14/10/2018 | 4.5 |
| 14/10/2018 | 4.2 |
| 14/10/2018 | 4.8 |
| 14/10/2018 | 5.4 |
| 14/10/2018 | 5.5 |
| 14/10/2018 | 4.9 |
| 14/10/2018 | 4.3 |
| 14/10/2018 | 3.8 |
| 14/10/2018 | 3.7 |
| 15/10/2018 | 3.3 |
| 15/10/2018 | 3.1 |
| 15/10/2018 | 2.6 |
| 15/10/2018 | 2.6 |
| 15/10/2018 | 2.8 |
| 15/10/2018 | 3.2 |
| 15/10/2018 | 4.3 |
| 15/10/2018 | 5.4 |
| 15/10/2018 | 6.1 |
| 15/10/2018 | 6.4 |
| 15/10/2018 | 6.3 |
| 15/10/2018 | 6.5 |
| 15/10/2018 | 6.6 |
| 15/10/2018 | 6.3 |
| 15/10/2018 | 6.3 |
| 15/10/2018 | 6.4 |
| 15/10/2018 | 5.9 |
| 15/10/2018 | 6.7 |
| 15/10/2018 | 7.5 |
| 15/10/2018 | 7.4 |
| 15/10/2018 | 6.1 |
| 15/10/2018 | 4.8 |
| 15/10/2018 | 4.2 |
| 15/10/2018 | 3.9 |
| 16/10/2018 | 3.5 |
| 16/10/2018 | 3.3 |
| 16/10/2018 | 2.7 |
| 16/10/2018 | 3.1 |
| 16/10/2018 | 2.8 |
| 16/10/2018 | 3.7 |
| 16/10/2018 | 4.7 |
| 16/10/2018 | 5.3 |
| 16/10/2018 | 6.1 |
| 16/10/2018 | 6.3 |
| 16/10/2018 | 6.6 |
| 16/10/2018 | 6.8 |
| 16/10/2018 | 6.9 |
| 16/10/2018 | 6.5 |
| 16/10/2018 | 6.5 |
| 16/10/2018 | 6.2 |
| 16/10/2018 | 6.3 |
| 16/10/2018 | 6.6 |
| 16/10/2018 | 7.4 |
| 16/10/2018 | 7.6 |
| 16/10/2018 | 6.3 |
| 16/10/2018 | 5 |
| 16/10/2018 | 4.3 |
| 16/10/2018 | 4 |
| 17/10/2018 | 3.7 |
| 17/10/2018 | 3.4 |
| 17/10/2018 | 2.8 |
| 17/10/2018 | 2.7 |
| 17/10/2018 | 2.9 |
| 17/10/2018 | 3.8 |
| 17/10/2018 | 4.8 |
| 17/10/2018 | 5.5 |
| 17/10/2018 | 6.3 |
| 17/10/2018 | 6.5 |
| 17/10/2018 | 6.8 |
| 17/10/2018 | 7 |
| 17/10/2018 | 7.1 |
| 17/10/2018 | 6.7 |
| 17/10/2018 | 6.6 |
| 17/10/2018 | 6.4 |
| 17/10/2018 | 6.5 |
| 17/10/2018 | 6.7 |
| 17/10/2018 | 7.8 |
| 17/10/2018 | 7.4 |
| 17/10/2018 | 6.2 |
| 17/10/2018 | 5 |
| 17/10/2018 | 4.4 |
| 17/10/2018 | 4.1 |
| 18/10/2018 | 3.8 |
| 18/10/2018 | 3 |
| 18/10/2018 | 2.8 |
| 18/10/2018 | 2.7 |
| 18/10/2018 | 2.9 |
| 18/10/2018 | 3.8 |
| 18/10/2018 | 4.8 |
| 18/10/2018 | 5.6 |
| 18/10/2018 | 6.3 |
| 18/10/2018 | 6.5 |
| 18/10/2018 | 6.8 |
| 18/10/2018 | 7 |
| 18/10/2018 | 7.1 |
| 18/10/2018 | 6.7 |
| 18/10/2018 | 6.7 |
| 18/10/2018 | 6.4 |
| 18/10/2018 | 6.5 |
| 18/10/2018 | 6.9 |
| 18/10/2018 | 8 |
| 18/10/2018 | 7.6 |
| 18/10/2018 | 6.3 |
| 18/10/2018 | 5.1 |
| 18/10/2018 | 4.5 |
| 18/10/2018 | 4.3 |
| 19/10/2018 | 3.4 |
| 19/10/2018 | 3 |
| 19/10/2018 | 2.9 |
| 19/10/2018 | 2.8 |
| 19/10/2018 | 3 |
| 19/10/2018 | 3.8 |
| 19/10/2018 | 4.8 |
| 19/10/2018 | 5.4 |
| 19/10/2018 | 6.2 |
| 19/10/2018 | 6.5 |
| 19/10/2018 | 6.8 |
| 19/10/2018 | 7 |
| 19/10/2018 | 6.9 |
| 19/10/2018 | 6.7 |
| 19/10/2018 | 6.5 |
| 19/10/2018 | 6.1 |
| 19/10/2018 | 6.3 |
| 19/10/2018 | 6.9 |
| 19/10/2018 | 7.3 |
| 19/10/2018 | 7.1 |
| 19/10/2018 | 6 |
| 19/10/2018 | 5 |
| 19/10/2018 | 4.3 |
| 19/10/2018 | 3.9 |
| 20/10/2018 | 3.6 |
| 20/10/2018 | 3.4 |
| 20/10/2018 | 3.3 |
| 20/10/2018 | 3 |
| 20/10/2018 | 2.9 |
| 20/10/2018 | 3 |
| 20/10/2018 | 3.7 |
| 20/10/2018 | 3.9 |
| 20/10/2018 | 4.6 |
| 20/10/2018 | 5.4 |
| 20/10/2018 | 5.4 |
| 20/10/2018 | 5.4 |
| 20/10/2018 | 5.4 |
| 20/10/2018 | 5.2 |
| 20/10/2018 | 5 |
| 20/10/2018 | 5.3 |
| 20/10/2018 | 5 |
| 20/10/2018 | 5.3 |
| 20/10/2018 | 6.5 |
| 20/10/2018 | 6.3 |
| 20/10/2018 | 5.1 |
| 20/10/2018 | 4.5 |
| 20/10/2018 | 3.9 |
| 20/10/2018 | 4 |
| 21/10/2018 | 3.5 |
| 21/10/2018 | 3.4 |
| 21/10/2018 | 2.7 |
| 21/10/2018 | 2.9 |
| 21/10/2018 | 2.9 |
| 21/10/2018 | 2.6 |
| 21/10/2018 | 3.3 |
| 21/10/2018 | 3.3 |
| 21/10/2018 | 3.9 |
| 21/10/2018 | 4.1 |
| 21/10/2018 | 4.9 |
| 21/10/2018 | 4.8 |
| 21/10/2018 | 4.7 |
| 21/10/2018 | 4.7 |
| 21/10/2018 | 4.6 |
| 21/10/2018 | 4.5 |
| 21/10/2018 | 4.4 |
| 21/10/2018 | 5.1 |
| 21/10/2018 | 6 |
| 21/10/2018 | 5.6 |
| 21/10/2018 | 5.1 |
| 21/10/2018 | 4.6 |
| 21/10/2018 | 4.1 |
| 21/10/2018 | 4 |
| 22/10/2018 | 3.4 |
| 22/10/2018 | 2.7 |
| 22/10/2018 | 2.7 |
| 22/10/2018 | 2.6 |
| 22/10/2018 | 2.8 |
| 22/10/2018 | 3 |
| 22/10/2018 | 4.1 |
| 22/10/2018 | 5.2 |
| 22/10/2018 | 6 |
| 22/10/2018 | 6.5 |
| 22/10/2018 | 6.6 |
| 22/10/2018 | 6.3 |
| 22/10/2018 | 6.5 |
| 22/10/2018 | 6.5 |
| 22/10/2018 | 5.9 |
| 22/10/2018 | 6.1 |
| 22/10/2018 | 5.7 |
| 22/10/2018 | 6.8 |
| 22/10/2018 | 8.2 |
| 22/10/2018 | 7.8 |
| 22/10/2018 | 5.7 |
| 22/10/2018 | 4.9 |
| 22/10/2018 | 4.2 |
| 22/10/2018 | 4.1 |
| 23/10/2018 | 3.2 |
| 23/10/2018 | 2.9 |
| 23/10/2018 | 2.7 |
| 23/10/2018 | 2.6 |
| 23/10/2018 | 2.8 |
| 23/10/2018 | 3.4 |
| 23/10/2018 | 4.5 |
| 23/10/2018 | 5.6 |
| 23/10/2018 | 6 |
| 23/10/2018 | 6.4 |
| 23/10/2018 | 6.9 |
| 23/10/2018 | 6.7 |
| 23/10/2018 | 6.8 |
| 23/10/2018 | 6.7 |
| 23/10/2018 | 6.2 |
| 23/10/2018 | 6.4 |
| 23/10/2018 | 6 |
| 23/10/2018 | 6.7 |
| 23/10/2018 | 8.1 |
| 23/10/2018 | 7.5 |
| 23/10/2018 | 5.9 |
| 23/10/2018 | 4.6 |
| 23/10/2018 | 4.3 |
| 23/10/2018 | 4.2 |
| 24/10/2018 | 3.4 |
| 24/10/2018 | 3 |
| 24/10/2018 | 2.8 |
| 24/10/2018 | 2.7 |
| 24/10/2018 | 2.9 |
| 24/10/2018 | 3.5 |
| 24/10/2018 | 4.6 |
| 24/10/2018 | 5.8 |
| 24/10/2018 | 6.2 |
| 24/10/2018 | 6.6 |
| 24/10/2018 | 6.6 |
| 24/10/2018 | 6.9 |
| 24/10/2018 | 6.9 |
| 24/10/2018 | 6.9 |
| 24/10/2018 | 6.3 |
| 24/10/2018 | 6.5 |
| 24/10/2018 | 6.2 |
| 24/10/2018 | 6.8 |
| 24/10/2018 | 8.5 |
| 24/10/2018 | 7.9 |
| 24/10/2018 | 5.8 |
| 24/10/2018 | 5.1 |
| 24/10/2018 | 4.4 |
| 24/10/2018 | 4.3 |
| 25/10/2018 | 3.5 |
| 25/10/2018 | 3.1 |
| 25/10/2018 | 2.9 |
| 25/10/2018 | 2.8 |
| 25/10/2018 | 2.9 |
| 25/10/2018 | 3.5 |
| 25/10/2018 | 4.6 |
| 25/10/2018 | 5.8 |
| 25/10/2018 | 6.2 |
| 25/10/2018 | 6.6 |
| 25/10/2018 | 7.1 |
| 25/10/2018 | 6.8 |
| 25/10/2018 | 6.9 |
| 25/10/2018 | 6.9 |
| 25/10/2018 | 6.3 |
| 25/10/2018 | 6.5 |
| 25/10/2018 | 6.2 |
| 25/10/2018 | 6.9 |
| 25/10/2018 | 8.7 |
| 25/10/2018 | 8 |
| 25/10/2018 | 5.9 |
| 25/10/2018 | 4.7 |
| 25/10/2018 | 4.5 |
| 25/10/2018 | 4 |
| 26/10/2018 | 3.6 |
| 26/10/2018 | 3.1 |
| 26/10/2018 | 3 |
| 26/10/2018 | 2.8 |
| 26/10/2018 | 2.9 |
| 26/10/2018 | 3.5 |
| 26/10/2018 | 4.6 |
| 26/10/2018 | 5.7 |
| 26/10/2018 | 6.1 |
| 26/10/2018 | 6.6 |
| 26/10/2018 | 6.6 |
| 26/10/2018 | 6.8 |
| 26/10/2018 | 6.7 |
| 26/10/2018 | 6.4 |
| 26/10/2018 | 6.2 |
| 26/10/2018 | 6.3 |
| 26/10/2018 | 6.1 |
| 26/10/2018 | 7 |
| 26/10/2018 | 7.9 |
| 26/10/2018 | 7.5 |
| 26/10/2018 | 5.6 |
| 26/10/2018 | 4.7 |
| 26/10/2018 | 4.3 |
| 26/10/2018 | 4.1 |
| 27/10/2018 | 3.8 |
| 27/10/2018 | 3 |
| 27/10/2018 | 2.8 |
| 27/10/2018 | 3 |
| 27/10/2018 | 2.9 |
| 27/10/2018 | 2.7 |
| 27/10/2018 | 3.2 |
| 27/10/2018 | 3.9 |
| 27/10/2018 | 4.7 |
| 27/10/2018 | 5 |
| 27/10/2018 | 5.8 |
| 27/10/2018 | 5.8 |
| 27/10/2018 | 5.7 |
| 27/10/2018 | 5.4 |
| 27/10/2018 | 5.2 |
| 27/10/2018 | 5 |
| 27/10/2018 | 4.8 |
| 27/10/2018 | 5.8 |
| 27/10/2018 | 7.1 |
| 27/10/2018 | 6.3 |
| 27/10/2018 | 4.8 |
| 27/10/2018 | 4.2 |
| 27/10/2018 | 3.9 |
| 27/10/2018 | 4.1 |
| 28/10/2018 | 2.9 |
| 28/10/2018 | 2.9 |
| 28/10/2018 | 2.8 |
| 28/10/2018 | 2.8 |
| 28/10/2018 | 2.5 |
| 28/10/2018 | 2.4 |
| 28/10/2018 | 2.6 |
| 28/10/2018 | 2.9 |
| 28/10/2018 | 3.3 |
| 28/10/2018 | 3.4 |
| 28/10/2018 | 3.7 |
| 28/10/2018 | 3.8 |
| 28/10/2018 | 4.3 |
| 28/10/2018 | 4.1 |
| 28/10/2018 | 4 |
| 28/10/2018 | 4 |
| 28/10/2018 | 3.9 |
| 28/10/2018 | 4.4 |
| 28/10/2018 | 5.1 |
| 28/10/2018 | 5.1 |
| 28/10/2018 | 5.3 |
| 28/10/2018 | 4.2 |
| 28/10/2018 | 4 |
| 28/10/2018 | 4 |
| 28/10/2018 | 3.3 |
| 29/10/2018 | 3 |
| 29/10/2018 | 2.8 |
| 29/10/2018 | 2.4 |
| 29/10/2018 | 2.8 |
| 29/10/2018 | 2.5 |
| 29/10/2018 | 3.3 |
| 29/10/2018 | 4 |
| 29/10/2018 | 5 |
| 29/10/2018 | 5.4 |
| 29/10/2018 | 5.7 |
| 29/10/2018 | 6 |
| 29/10/2018 | 6.4 |
| 29/10/2018 | 5.9 |
| 29/10/2018 | 5.9 |
| 29/10/2018 | 6 |
| 29/10/2018 | 5.8 |
| 29/10/2018 | 6.4 |
| 29/10/2018 | 7.1 |
| 29/10/2018 | 7.2 |
| 29/10/2018 | 6.9 |
| 29/10/2018 | 5.3 |
| 29/10/2018 | 4.4 |
| 29/10/2018 | 4.4 |
| 29/10/2018 | 3.5 |
| 30/10/2018 | 3.3 |
| 30/10/2018 | 3 |
| 30/10/2018 | 2.9 |
| 30/10/2018 | 2.8 |
| 30/10/2018 | 3 |
| 30/10/2018 | 3.3 |
| 30/10/2018 | 4 |
| 30/10/2018 | 5 |
| 30/10/2018 | 5.9 |
| 30/10/2018 | 6.1 |
| 30/10/2018 | 6.4 |
| 30/10/2018 | 6.2 |
| 30/10/2018 | 6.2 |
| 30/10/2018 | 6.1 |
| 30/10/2018 | 6.2 |
| 30/10/2018 | 6.1 |
| 30/10/2018 | 6.2 |
| 30/10/2018 | 7 |
| 30/10/2018 | 7.1 |
| 30/10/2018 | 7.1 |
| 30/10/2018 | 5.5 |
| 30/10/2018 | 4.6 |
| 30/10/2018 | 4.6 |
| 30/10/2018 | 3.7 |
| 31/10/2018 | 3.4 |
| 31/10/2018 | 3.1 |
| 31/10/2018 | 3 |
| 31/10/2018 | 2.9 |
| 31/10/2018 | 3.1 |
| 31/10/2018 | 3.4 |
| 31/10/2018 | 4 |
| 31/10/2018 | 5.1 |
| 31/10/2018 | 6 |
| 31/10/2018 | 6.3 |
| 31/10/2018 | 6.1 |
| 31/10/2018 | 6.4 |
| 31/10/2018 | 6.3 |
| 31/10/2018 | 6.3 |
| 31/10/2018 | 6.3 |
| 31/10/2018 | 6.2 |
| 31/10/2018 | 6.9 |
| 31/10/2018 | 7.1 |
| 31/10/2018 | 7.5 |
| 31/10/2018 | 6.9 |
| 31/10/2018 | 5.5 |
| 31/10/2018 | 4.6 |
| 31/10/2018 | 4.1 |
| 31/10/2018 | 3.8 |
| 01/11/2018 | 3.5 |
| 01/11/2018 | 3.2 |
| 01/11/2018 | 2.6 |
| 01/11/2018 | 3 |
| 01/11/2018 | 3.2 |
| 01/11/2018 | 3.4 |
| 01/11/2018 | 4.1 |
| 01/11/2018 | 5.2 |
| 01/11/2018 | 6 |
| 01/11/2018 | 6.2 |
| 01/11/2018 | 6.6 |
| 01/11/2018 | 6.4 |
| 01/11/2018 | 6.3 |
| 01/11/2018 | 6.3 |
| 01/11/2018 | 6.4 |
| 01/11/2018 | 6.2 |
| 01/11/2018 | 6.9 |
| 01/11/2018 | 7.2 |
| 01/11/2018 | 7.2 |
| 01/11/2018 | 7.1 |
| 01/11/2018 | 5.5 |
| 01/11/2018 | 4.7 |
| 01/11/2018 | 4.2 |
| 01/11/2018 | 3.9 |
| 02/11/2018 | 3.1 |
| 02/11/2018 | 2.8 |
| 02/11/2018 | 2.6 |
| 02/11/2018 | 3 |
| 02/11/2018 | 2.7 |
| 02/11/2018 | 3.4 |
| 02/11/2018 | 4.5 |
| 02/11/2018 | 5.1 |
| 02/11/2018 | 6 |
| 02/11/2018 | 6.3 |
| 02/11/2018 | 6.1 |
| 02/11/2018 | 6.4 |
| 02/11/2018 | 6.1 |
| 02/11/2018 | 6.3 |
| 02/11/2018 | 6.2 |
| 02/11/2018 | 6 |
| 02/11/2018 | 6.7 |
| 02/11/2018 | 7.2 |
| 02/11/2018 | 7.4 |
| 02/11/2018 | 6.5 |
| 02/11/2018 | 5.3 |
| 02/11/2018 | 4.6 |
| 02/11/2018 | 4 |
| 02/11/2018 | 3.6 |
| 03/11/2018 | 3.5 |
| 03/11/2018 | 3.3 |
| 03/11/2018 | 3.1 |
| 03/11/2018 | 2.8 |
| 03/11/2018 | 2.8 |
| 03/11/2018 | 2.9 |
| 03/11/2018 | 3.8 |
| 03/11/2018 | 4 |
| 03/11/2018 | 4.8 |
| 03/11/2018 | 4.9 |
| 03/11/2018 | 5.4 |
| 03/11/2018 | 5.4 |
| 03/11/2018 | 5.7 |
| 03/11/2018 | 5.6 |
| 03/11/2018 | 5.1 |
| 03/11/2018 | 5.1 |
| 03/11/2018 | 5.9 |
| 03/11/2018 | 6.2 |
| 03/11/2018 | 6 |
| 03/11/2018 | 5.8 |
| 03/11/2018 | 5 |
| 03/11/2018 | 4.3 |
| 03/11/2018 | 4 |
| 03/11/2018 | 3.7 |
| 04/11/2018 | 3.3 |
| 04/11/2018 | 3.2 |
| 04/11/2018 | 3.1 |
| 04/11/2018 | 2.8 |
| 04/11/2018 | 2.8 |
| 04/11/2018 | 3 |
| 04/11/2018 | 3.2 |
| 04/11/2018 | 3.3 |
| 04/11/2018 | 3.9 |
| 04/11/2018 | 4.1 |
| 04/11/2018 | 4.8 |
| 04/11/2018 | 4.7 |
| 04/11/2018 | 5.1 |
| 04/11/2018 | 4.6 |
| 04/11/2018 | 4.7 |
| 04/11/2018 | 4.7 |
| 04/11/2018 | 5.2 |
| 04/11/2018 | 5.8 |
| 04/11/2018 | 5.8 |
| 04/11/2018 | 5.1 |
| 04/11/2018 | 4.9 |
| 04/11/2018 | 4.4 |
| 04/11/2018 | 4.1 |
| 04/11/2018 | 3.7 |
| 05/11/2018 | 3.3 |
| 05/11/2018 | 3.2 |
| 05/11/2018 | 3.2 |
| 05/11/2018 | 3.1 |
| 05/11/2018 | 2.9 |
| 05/11/2018 | 3.4 |
| 05/11/2018 | 4.7 |
| 05/11/2018 | 5.6 |
| 05/11/2018 | 6.4 |
| 05/11/2018 | 6.5 |
| 05/11/2018 | 6.8 |
| 05/11/2018 | 7.1 |
| 05/11/2018 | 7.1 |
| 05/11/2018 | 6.8 |
| 05/11/2018 | 6.6 |
| 05/11/2018 | 7 |
| 05/11/2018 | 7.6 |
| 05/11/2018 | 8.2 |
| 05/11/2018 | 7.6 |
| 05/11/2018 | 6.8 |
| 05/11/2018 | 6.3 |
| 05/11/2018 | 5.5 |
| 05/11/2018 | 4.6 |
| 05/11/2018 | 4 |
| 06/11/2018 | 3.7 |
| 06/11/2018 | 3.3 |
| 06/11/2018 | 3.2 |
| 06/11/2018 | 3.2 |
| 06/11/2018 | 3.4 |
| 06/11/2018 | 3.9 |
| 06/11/2018 | 4.6 |
| 06/11/2018 | 6 |
| 06/11/2018 | 6.4 |
| 06/11/2018 | 6.9 |
| 06/11/2018 | 7.2 |
| 06/11/2018 | 7 |
| 06/11/2018 | 6.9 |
| 06/11/2018 | 7.1 |
| 06/11/2018 | 6.8 |
| 06/11/2018 | 6.8 |
| 06/11/2018 | 7.5 |
| 06/11/2018 | 8.1 |
| 06/11/2018 | 8.1 |
| 06/11/2018 | 7 |
| 06/11/2018 | 6.5 |
| 06/11/2018 | 5.7 |
| 06/11/2018 | 4.7 |
| 06/11/2018 | 4.1 |
| 07/11/2018 | 3.9 |
| 07/11/2018 | 3.5 |
| 07/11/2018 | 3.3 |
| 07/11/2018 | 3.3 |
| 07/11/2018 | 3.5 |
| 07/11/2018 | 4 |
| 07/11/2018 | 4.7 |
| 07/11/2018 | 5.7 |
| 07/11/2018 | 6.5 |
| 07/11/2018 | 6.6 |
| 07/11/2018 | 6.9 |
| 07/11/2018 | 7.2 |
| 07/11/2018 | 7.1 |
| 07/11/2018 | 7.2 |
| 07/11/2018 | 6.9 |
| 07/11/2018 | 7.5 |
| 07/11/2018 | 8.1 |
| 07/11/2018 | 8.7 |
| 07/11/2018 | 8 |
| 07/11/2018 | 6.9 |
| 07/11/2018 | 6.4 |
| 07/11/2018 | 5.7 |
| 07/11/2018 | 4.8 |
| 07/11/2018 | 4.3 |
| 08/11/2018 | 3.9 |
| 08/11/2018 | 3.5 |
| 08/11/2018 | 3.4 |
| 08/11/2018 | 3.3 |
| 08/11/2018 | 3.5 |
| 08/11/2018 | 4 |
| 08/11/2018 | 4.8 |
| 08/11/2018 | 5.8 |
| 08/11/2018 | 6.5 |
| 08/11/2018 | 6.6 |
| 08/11/2018 | 7.3 |
| 08/11/2018 | 7.1 |
| 08/11/2018 | 7.1 |
| 08/11/2018 | 7.2 |
| 08/11/2018 | 7.4 |
| 08/11/2018 | 7.5 |
| 08/11/2018 | 8.2 |
| 08/11/2018 | 8.9 |
| 08/11/2018 | 8.2 |
| 08/11/2018 | 7 |
| 08/11/2018 | 6.5 |
| 08/11/2018 | 5.8 |
| 08/11/2018 | 4.9 |
| 08/11/2018 | 4.4 |
| 09/11/2018 | 3.6 |
| 09/11/2018 | 3.6 |
| 09/11/2018 | 3 |
| 09/11/2018 | 3.3 |
| 09/11/2018 | 3.6 |
| 09/11/2018 | 4 |
| 09/11/2018 | 4.7 |
| 09/11/2018 | 6.1 |
| 09/11/2018 | 6.5 |
| 09/11/2018 | 6.6 |
| 09/11/2018 | 6.9 |
| 09/11/2018 | 7.1 |
| 09/11/2018 | 7.4 |
| 09/11/2018 | 7.2 |
| 09/11/2018 | 6.8 |
| 09/11/2018 | 7.2 |
| 09/11/2018 | 8 |
| 09/11/2018 | 8.3 |
| 09/11/2018 | 7.8 |
| 09/11/2018 | 7 |
| 09/11/2018 | 6.2 |
| 09/11/2018 | 5.2 |
| 09/11/2018 | 4.7 |
| 09/11/2018 | 4 |
| 10/11/2018 | 3.7 |
| 10/11/2018 | 3.5 |
| 10/11/2018 | 3.3 |
| 10/11/2018 | 3 |
| 10/11/2018 | 3 |
| 10/11/2018 | 3.1 |
| 10/11/2018 | 3.9 |
| 10/11/2018 | 4.3 |
| 10/11/2018 | 5.1 |
| 10/11/2018 | 5.3 |
| 10/11/2018 | 5.8 |
| 10/11/2018 | 5.9 |
| 10/11/2018 | 5.7 |
| 10/11/2018 | 5.6 |
| 10/11/2018 | 5.6 |
| 10/11/2018 | 5.7 |
| 10/11/2018 | 6.2 |
| 10/11/2018 | 7.1 |
| 10/11/2018 | 6.7 |
| 10/11/2018 | 6 |
| 10/11/2018 | 5.2 |
| 10/11/2018 | 4.6 |
| 10/11/2018 | 4.3 |
| 10/11/2018 | 4 |
| 11/11/2018 | 3.6 |
| 11/11/2018 | 3.4 |
| 11/11/2018 | 3.3 |
| 11/11/2018 | 3 |
| 11/11/2018 | 2.9 |
| 11/11/2018 | 3.1 |
| 11/11/2018 | 3.4 |
| 11/11/2018 | 3.6 |
| 11/11/2018 | 4.2 |
| 11/11/2018 | 4.5 |
| 11/11/2018 | 4.7 |
| 11/11/2018 | 5.2 |
| 11/11/2018 | 5 |
| 11/11/2018 | 5 |
| 11/11/2018 | 5.1 |
| 11/11/2018 | 5.3 |
| 11/11/2018 | 5.9 |
| 11/11/2018 | 6.7 |
| 11/11/2018 | 6.5 |
| 11/11/2018 | 5.2 |
| 11/11/2018 | 5.2 |
| 11/11/2018 | 4.8 |
| 11/11/2018 | 4.4 |
| 11/11/2018 | 4.1 |
| 12/11/2018 | 3.6 |
| 12/11/2018 | 3.4 |
| 12/11/2018 | 3.3 |
| 12/11/2018 | 3.3 |
| 12/11/2018 | 3 |
| 12/11/2018 | 3.6 |
| 12/11/2018 | 5 |
| 12/11/2018 | 6 |
| 12/11/2018 | 6.8 |
| 12/11/2018 | 7 |
| 12/11/2018 | 7.3 |
| 12/11/2018 | 7.2 |
| 12/11/2018 | 7.2 |
| 12/11/2018 | 7.4 |
| 12/11/2018 | 7.2 |
| 12/11/2018 | 7.2 |
| 12/11/2018 | 8.1 |
| 12/11/2018 | 8.8 |
| 12/11/2018 | 8.5 |
| 12/11/2018 | 7 |
| 12/11/2018 | 6.6 |
| 12/11/2018 | 5.9 |
| 12/11/2018 | 5 |
| 12/11/2018 | 4.4 |
| 13/11/2018 | 4 |
| 13/11/2018 | 3.6 |
| 13/11/2018 | 3.4 |
| 13/11/2018 | 3.3 |
| 13/11/2018 | 3.6 |
| 13/11/2018 | 4 |
| 13/11/2018 | 4.9 |
| 13/11/2018 | 6 |
| 13/11/2018 | 6.8 |
| 13/11/2018 | 6.9 |
| 13/11/2018 | 7.2 |
| 13/11/2018 | 7.5 |
| 13/11/2018 | 7.5 |
| 13/11/2018 | 7.6 |
| 13/11/2018 | 7.4 |
| 13/11/2018 | 7.5 |
| 13/11/2018 | 8.5 |
| 13/11/2018 | 9.2 |
| 13/11/2018 | 8.4 |
| 13/11/2018 | 7.2 |
| 13/11/2018 | 6.3 |
| 13/11/2018 | 5.5 |
| 13/11/2018 | 5.1 |
| 13/11/2018 | 4.5 |
| 14/11/2018 | 4.1 |
| 14/11/2018 | 3.7 |
| 14/11/2018 | 3.5 |
| 14/11/2018 | 3.4 |
| 14/11/2018 | 3.7 |
| 14/11/2018 | 4.1 |
| 14/11/2018 | 5 |
| 14/11/2018 | 6.1 |
| 14/11/2018 | 7 |
| 14/11/2018 | 7.1 |
| 14/11/2018 | 7.5 |
| 14/11/2018 | 7.7 |
| 14/11/2018 | 7.7 |
| 14/11/2018 | 7.8 |
| 14/11/2018 | 7.5 |
| 14/11/2018 | 7.7 |
| 14/11/2018 | 8.6 |
| 14/11/2018 | 9.3 |
| 14/11/2018 | 8.8 |
| 14/11/2018 | 7.6 |
| 14/11/2018 | 6.7 |
| 14/11/2018 | 5.5 |
| 14/11/2018 | 5.2 |
| 14/11/2018 | 4.6 |
| 15/11/2018 | 3.7 |
| 15/11/2018 | 3.8 |
| 15/11/2018 | 3.6 |
| 15/11/2018 | 3.5 |
| 15/11/2018 | 3.7 |
| 15/11/2018 | 4.2 |
| 15/11/2018 | 5 |
| 15/11/2018 | 6.2 |
| 15/11/2018 | 7 |
| 15/11/2018 | 7.1 |
| 15/11/2018 | 7.4 |
| 15/11/2018 | 7.7 |
| 15/11/2018 | 7.7 |
| 15/11/2018 | 7.8 |
| 15/11/2018 | 7.5 |
| 15/11/2018 | 7.7 |
| 15/11/2018 | 8.7 |
| 15/11/2018 | 9.5 |
| 15/11/2018 | 9.1 |
| 15/11/2018 | 7.2 |
| 15/11/2018 | 6.3 |
| 15/11/2018 | 5.6 |
| 15/11/2018 | 5.3 |
| 15/11/2018 | 4.3 |
| 16/11/2018 | 3.9 |
| 16/11/2018 | 3.4 |
| 16/11/2018 | 3.1 |
| 16/11/2018 | 3.5 |
| 16/11/2018 | 3.7 |
| 16/11/2018 | 4.2 |
| 16/11/2018 | 4.9 |
| 16/11/2018 | 6.1 |
| 16/11/2018 | 6.9 |
| 16/11/2018 | 7.1 |
| 16/11/2018 | 7.4 |
| 16/11/2018 | 7.7 |
| 16/11/2018 | 7.5 |
| 16/11/2018 | 7.3 |
| 16/11/2018 | 7.4 |
| 16/11/2018 | 7.4 |
| 16/11/2018 | 8.5 |
| 16/11/2018 | 8.9 |
| 16/11/2018 | 8.7 |
| 16/11/2018 | 7.1 |
| 16/11/2018 | 6.4 |
| 16/11/2018 | 5.5 |
| 16/11/2018 | 5.1 |
| 16/11/2018 | 4.4 |
| 17/11/2018 | 4 |
| 17/11/2018 | 3.7 |
| 17/11/2018 | 3.5 |
| 17/11/2018 | 3.2 |
| 17/11/2018 | 3.1 |
| 17/11/2018 | 3.2 |
| 17/11/2018 | 4.1 |
| 17/11/2018 | 4.6 |
| 17/11/2018 | 4.9 |
| 17/11/2018 | 5.6 |
| 17/11/2018 | 6.3 |
| 17/11/2018 | 6.3 |
| 17/11/2018 | 6.2 |
| 17/11/2018 | 6 |
| 17/11/2018 | 6.1 |
| 17/11/2018 | 6.2 |
| 17/11/2018 | 6.5 |
| 17/11/2018 | 7.5 |
| 17/11/2018 | 7.3 |
| 17/11/2018 | 6.1 |
| 17/11/2018 | 5.4 |
| 17/11/2018 | 4.9 |
| 17/11/2018 | 4.6 |
| 17/11/2018 | 4.3 |
| 18/11/2018 | 3.8 |
| 18/11/2018 | 3.6 |
| 18/11/2018 | 3.4 |
| 18/11/2018 | 3.1 |
| 18/11/2018 | 3 |
| 18/11/2018 | 3.2 |
| 18/11/2018 | 3.5 |
| 18/11/2018 | 3.8 |
| 18/11/2018 | 4.5 |
| 18/11/2018 | 4.7 |
| 18/11/2018 | 5 |
| 18/11/2018 | 5.5 |
| 18/11/2018 | 5.3 |
| 18/11/2018 | 5.4 |
| 18/11/2018 | 5.5 |
| 18/11/2018 | 5.2 |
| 18/11/2018 | 6.1 |
| 18/11/2018 | 6.9 |
| 18/11/2018 | 6.5 |
| 18/11/2018 | 5.3 |
| 18/11/2018 | 5.3 |
| 18/11/2018 | 5 |
| 18/11/2018 | 4.7 |
| 18/11/2018 | 4.3 |
| 19/11/2018 | 3.8 |
| 19/11/2018 | 3.5 |
| 19/11/2018 | 2.9 |
| 19/11/2018 | 3.4 |
| 19/11/2018 | 3.1 |
| 19/11/2018 | 3.6 |
| 19/11/2018 | 5 |
| 19/11/2018 | 6.2 |
| 19/11/2018 | 6.5 |
| 19/11/2018 | 7.3 |
| 19/11/2018 | 7.1 |
| 19/11/2018 | 7.5 |
| 19/11/2018 | 7.5 |
| 19/11/2018 | 7.2 |
| 19/11/2018 | 7.5 |
| 19/11/2018 | 7.6 |
| 19/11/2018 | 8.2 |
| 19/11/2018 | 8.9 |
| 19/11/2018 | 8.9 |
| 19/11/2018 | 7.6 |
| 19/11/2018 | 6.7 |
| 19/11/2018 | 5.6 |
| 19/11/2018 | 5.2 |
| 19/11/2018 | 4.6 |
| 20/11/2018 | 4.1 |
| 20/11/2018 | 3.6 |
| 20/11/2018 | 3.5 |
| 20/11/2018 | 3.4 |
| 20/11/2018 | 3.6 |
| 20/11/2018 | 4.1 |
| 20/11/2018 | 4.9 |
| 20/11/2018 | 6.1 |
| 20/11/2018 | 7 |
| 20/11/2018 | 7.1 |
| 20/11/2018 | 7.4 |
| 20/11/2018 | 7.7 |
| 20/11/2018 | 7.7 |
| 20/11/2018 | 7.4 |
| 20/11/2018 | 7.6 |
| 20/11/2018 | 7.4 |
| 20/11/2018 | 8.5 |
| 20/11/2018 | 9.1 |
| 20/11/2018 | 8.7 |
| 20/11/2018 | 7.3 |
| 20/11/2018 | 6.4 |
| 20/11/2018 | 5.7 |
| 20/11/2018 | 5.3 |
| 20/11/2018 | 4.7 |
| 21/11/2018 | 3.7 |
| 21/11/2018 | 3.7 |
| 21/11/2018 | 3.6 |
| 21/11/2018 | 3.4 |
| 21/11/2018 | 3.7 |
| 21/11/2018 | 4.1 |
| 21/11/2018 | 4.9 |
| 21/11/2018 | 6.2 |
| 21/11/2018 | 7 |
| 21/11/2018 | 7.2 |
| 21/11/2018 | 7.6 |
| 21/11/2018 | 7.3 |
| 21/11/2018 | 7.8 |
| 21/11/2018 | 7.4 |
| 21/11/2018 | 7.6 |
| 21/11/2018 | 7.4 |
| 21/11/2018 | 8.5 |
| 21/11/2018 | 9.1 |
| 21/11/2018 | 8.9 |
| 21/11/2018 | 7.6 |
| 21/11/2018 | 6.8 |
| 21/11/2018 | 5.6 |
| 21/11/2018 | 4.8 |
| 21/11/2018 | 4.2 |
| 22/11/2018 | 3.7 |
| 22/11/2018 | 3.3 |
| 22/11/2018 | 3.1 |
| 22/11/2018 | 3.5 |
| 22/11/2018 | 3.7 |
| 22/11/2018 | 4.1 |
| 22/11/2018 | 4.9 |
| 22/11/2018 | 6.2 |
| 22/11/2018 | 6.9 |
| 22/11/2018 | 7.1 |
| 22/11/2018 | 7.4 |
| 22/11/2018 | 7.7 |
| 22/11/2018 | 7.7 |
| 22/11/2018 | 7.3 |
| 22/11/2018 | 7.6 |
| 22/11/2018 | 7.8 |
| 22/11/2018 | 8.5 |
| 22/11/2018 | 9 |
| 22/11/2018 | 8.5 |
| 22/11/2018 | 7.2 |
| 22/11/2018 | 6.3 |
| 22/11/2018 | 5.7 |
| 22/11/2018 | 4.9 |
| 22/11/2018 | 4.3 |
| 23/11/2018 | 3.8 |
| 23/11/2018 | 3.3 |
| 23/11/2018 | 3.1 |
| 23/11/2018 | 3.5 |
| 23/11/2018 | 3.7 |
| 23/11/2018 | 4.1 |
| 23/11/2018 | 4.8 |
| 23/11/2018 | 6 |
| 23/11/2018 | 6.8 |
| 23/11/2018 | 7 |
| 23/11/2018 | 7.4 |
| 23/11/2018 | 7.1 |
| 23/11/2018 | 7.4 |
| 23/11/2018 | 7.2 |
| 23/11/2018 | 7.3 |
| 23/11/2018 | 7.4 |
| 23/11/2018 | 8.1 |
| 23/11/2018 | 8.8 |
| 23/11/2018 | 7.9 |
| 23/11/2018 | 7.1 |
| 23/11/2018 | 6 |
| 23/11/2018 | 5.5 |
| 23/11/2018 | 5.1 |
| 23/11/2018 | 4.4 |
| 24/11/2018 | 4 |
| 24/11/2018 | 3.6 |
| 24/11/2018 | 3.4 |
| 24/11/2018 | 3.1 |
| 24/11/2018 | 3.1 |
| 24/11/2018 | 3.1 |
| 24/11/2018 | 3.9 |
| 24/11/2018 | 4.5 |
| 24/11/2018 | 4.8 |
| 24/11/2018 | 5.5 |
| 24/11/2018 | 5.7 |
| 24/11/2018 | 5.7 |
| 24/11/2018 | 6.1 |
| 24/11/2018 | 5.9 |
| 24/11/2018 | 5.4 |
| 24/11/2018 | 5.7 |
| 24/11/2018 | 6.1 |
| 24/11/2018 | 6.8 |
| 24/11/2018 | 6.6 |
| 24/11/2018 | 6 |
| 24/11/2018 | 5.5 |
| 24/11/2018 | 4.9 |
| 24/11/2018 | 4.6 |
| 24/11/2018 | 4.3 |
| 25/11/2018 | 3.7 |
| 25/11/2018 | 3.5 |
| 25/11/2018 | 2.8 |
| 25/11/2018 | 3 |
| 25/11/2018 | 2.9 |
| 25/11/2018 | 3.1 |
| 25/11/2018 | 3.4 |
| 25/11/2018 | 3.7 |
| 25/11/2018 | 4.4 |
| 25/11/2018 | 4.6 |
| 25/11/2018 | 4.9 |
| 25/11/2018 | 4.9 |
| 25/11/2018 | 5.2 |
| 25/11/2018 | 5.3 |
| 25/11/2018 | 4.9 |
| 25/11/2018 | 5.1 |
| 25/11/2018 | 5.6 |
| 25/11/2018 | 6.2 |
| 25/11/2018 | 6.3 |
| 25/11/2018 | 5.8 |
| 25/11/2018 | 5.3 |
| 25/11/2018 | 5 |
| 25/11/2018 | 4.7 |
| 25/11/2018 | 3.8 |
| 26/11/2018 | 3.7 |
| 26/11/2018 | 3.4 |
| 26/11/2018 | 2.9 |
| 26/11/2018 | 3.3 |
| 26/11/2018 | 3 |
| 26/11/2018 | 3.5 |
| 26/11/2018 | 4.9 |
| 26/11/2018 | 6 |
| 26/11/2018 | 6.4 |
| 26/11/2018 | 6.6 |
| 26/11/2018 | 7 |
| 26/11/2018 | 7.4 |
| 26/11/2018 | 7.4 |
| 26/11/2018 | 7.1 |
| 26/11/2018 | 6.9 |
| 26/11/2018 | 7.1 |
| 26/11/2018 | 7.8 |
| 26/11/2018 | 8.7 |
| 26/11/2018 | 8.1 |
| 26/11/2018 | 7.5 |
| 26/11/2018 | 6.2 |
| 26/11/2018 | 5.6 |
| 26/11/2018 | 4.7 |
| 26/11/2018 | 4 |
| 27/11/2018 | 3.5 |
| 27/11/2018 | 3.6 |
| 27/11/2018 | 3.4 |
| 27/11/2018 | 3.3 |
| 27/11/2018 | 3.5 |
| 27/11/2018 | 4 |
| 27/11/2018 | 4.7 |
| 27/11/2018 | 6 |
| 27/11/2018 | 6.3 |
| 27/11/2018 | 7 |
| 27/11/2018 | 7.3 |
| 27/11/2018 | 7.1 |
| 27/11/2018 | 7.1 |
| 27/11/2018 | 7.2 |
| 27/11/2018 | 7 |
| 27/11/2018 | 7.3 |
| 27/11/2018 | 8.1 |
| 27/11/2018 | 8.4 |
| 27/11/2018 | 8.3 |
| 27/11/2018 | 7.2 |
| 27/11/2018 | 6.4 |
| 27/11/2018 | 5.7 |
| 27/11/2018 | 4.8 |
| 27/11/2018 | 4.1 |
| 28/11/2018 | 3.7 |
| 28/11/2018 | 3.2 |
| 28/11/2018 | 3 |
| 28/11/2018 | 3.4 |
| 28/11/2018 | 3.6 |
| 28/11/2018 | 4 |
| 28/11/2018 | 4.8 |
| 28/11/2018 | 6 |
| 28/11/2018 | 6.4 |
| 28/11/2018 | 7.1 |
| 28/11/2018 | 7.4 |
| 28/11/2018 | 7.2 |
| 28/11/2018 | 7.2 |
| 28/11/2018 | 7.2 |
| 28/11/2018 | 7 |
| 28/11/2018 | 7.3 |
| 28/11/2018 | 8.1 |
| 28/11/2018 | 8.3 |
| 28/11/2018 | 8.1 |
| 28/11/2018 | 7.5 |
| 28/11/2018 | 6.3 |
| 28/11/2018 | 5.6 |
| 28/11/2018 | 4.8 |
| 28/11/2018 | 4.2 |
| 29/11/2018 | 3.7 |
| 29/11/2018 | 3.2 |
| 29/11/2018 | 3 |
| 29/11/2018 | 3.4 |
| 29/11/2018 | 3.6 |
| 29/11/2018 | 4 |
| 29/11/2018 | 4.7 |
| 29/11/2018 | 6 |
| 29/11/2018 | 6.3 |
| 29/11/2018 | 6.9 |
| 29/11/2018 | 7.3 |
| 29/11/2018 | 7.1 |
| 29/11/2018 | 7.1 |
| 29/11/2018 | 7.2 |
| 29/11/2018 | 6.9 |
| 29/11/2018 | 7.2 |
| 29/11/2018 | 8 |
| 29/11/2018 | 8.3 |
| 29/11/2018 | 8.1 |
| 29/11/2018 | 7.1 |
| 29/11/2018 | 6.3 |
| 29/11/2018 | 5.7 |
| 29/11/2018 | 4.9 |
| 29/11/2018 | 4.3 |
| 30/11/2018 | 3.8 |
| 30/11/2018 | 3.2 |
| 30/11/2018 | 3 |
| 30/11/2018 | 3.4 |
| 30/11/2018 | 3.6 |
| 30/11/2018 | 4 |
| 30/11/2018 | 4.6 |
| 30/11/2018 | 5.8 |
| 30/11/2018 | 6.2 |
| 30/11/2018 | 6.9 |
| 30/11/2018 | 6.7 |
| 30/11/2018 | 7 |
| 30/11/2018 | 7.3 |
| 30/11/2018 | 7.1 |
| 30/11/2018 | 6.7 |
| 30/11/2018 | 6.9 |
| 30/11/2018 | 7.7 |
| 30/11/2018 | 8 |
| 30/11/2018 | 7.6 |
| 30/11/2018 | 7 |
| 30/11/2018 | 6 |
| 30/11/2018 | 5.5 |
| 30/11/2018 | 4.6 |
| 30/11/2018 | 4.4 |
| 01/12/2018 | 3.9 |
| 01/12/2018 | 3.6 |
| 01/12/2018 | 3.3 |
| 01/12/2018 | 3 |
| 01/12/2018 | 3 |
| 01/12/2018 | 3 |
| 01/12/2018 | 3.8 |
| 01/12/2018 | 4.3 |
| 01/12/2018 | 4.7 |
| 01/12/2018 | 5.4 |
| 01/12/2018 | 5.5 |
| 01/12/2018 | 5.6 |
| 01/12/2018 | 5.5 |
| 01/12/2018 | 5.3 |
| 01/12/2018 | 5.3 |
| 01/12/2018 | 5.6 |
| 01/12/2018 | 6.2 |
| 01/12/2018 | 6.6 |
| 01/12/2018 | 6.3 |
| 01/12/2018 | 6 |
| 01/12/2018 | 5.5 |
| 01/12/2018 | 4.9 |
| 01/12/2018 | 4.6 |
| 01/12/2018 | 3.8 |
| 02/12/2018 | 3.7 |
| 02/12/2018 | 3.4 |
| 02/12/2018 | 2.8 |
| 02/12/2018 | 3 |
| 02/12/2018 | 2.9 |
| 02/12/2018 | 3 |
| 02/12/2018 | 3.3 |
| 02/12/2018 | 3.6 |
| 02/12/2018 | 3.8 |
| 02/12/2018 | 4.5 |
| 02/12/2018 | 4.8 |
| 02/12/2018 | 4.8 |
| 02/12/2018 | 5.2 |
| 02/12/2018 | 4.7 |
| 02/12/2018 | 4.8 |
| 02/12/2018 | 4.6 |
| 02/12/2018 | 5.2 |
| 02/12/2018 | 6 |
| 02/12/2018 | 6 |
| 02/12/2018 | 5.7 |
| 02/12/2018 | 5.4 |
| 02/12/2018 | 4.5 |
| 02/12/2018 | 4.2 |
| 02/12/2018 | 3.8 |
| 03/12/2018 | 3.7 |
| 03/12/2018 | 3.4 |
| 03/12/2018 | 2.8 |
| 03/12/2018 | 3.2 |
| 03/12/2018 | 3 |
| 03/12/2018 | 3.4 |
| 03/12/2018 | 4.7 |
| 03/12/2018 | 5.4 |
| 03/12/2018 | 6.2 |
| 03/12/2018 | 6.5 |
| 03/12/2018 | 6.9 |
| 03/12/2018 | 6.7 |
| 03/12/2018 | 6.8 |
| 03/12/2018 | 7 |
| 03/12/2018 | 6.7 |
| 03/12/2018 | 7 |
| 03/12/2018 | 7.4 |
| 03/12/2018 | 7.9 |
| 03/12/2018 | 7.7 |
| 03/12/2018 | 7.4 |
| 03/12/2018 | 6.2 |
| 03/12/2018 | 5.6 |
| 03/12/2018 | 4.7 |
| 03/12/2018 | 4 |
| 04/12/2018 | 3.5 |
| 04/12/2018 | 3 |
| 04/12/2018 | 2.9 |
| 04/12/2018 | 3.3 |
| 04/12/2018 | 3.5 |
| 04/12/2018 | 3.9 |
| 04/12/2018 | 4.6 |
| 04/12/2018 | 5.8 |
| 04/12/2018 | 6.2 |
| 04/12/2018 | 6.8 |
| 04/12/2018 | 6.7 |
| 04/12/2018 | 7 |
| 04/12/2018 | 7 |
| 04/12/2018 | 7.1 |
| 04/12/2018 | 6.9 |
| 04/12/2018 | 6.8 |
| 04/12/2018 | 7.7 |
| 04/12/2018 | 7.7 |
| 04/12/2018 | 8 |
| 04/12/2018 | 7.1 |
| 04/12/2018 | 6.4 |
| 04/12/2018 | 5.7 |
| 04/12/2018 | 4.8 |
| 04/12/2018 | 4.1 |
| 05/12/2018 | 3.6 |
| 05/12/2018 | 3.1 |
| 05/12/2018 | 2.9 |
| 05/12/2018 | 3.3 |
| 05/12/2018 | 3.5 |
| 05/12/2018 | 3.9 |
| 05/12/2018 | 4.6 |
| 05/12/2018 | 5.9 |
| 05/12/2018 | 6.2 |
| 05/12/2018 | 6.4 |
| 05/12/2018 | 6.8 |
| 05/12/2018 | 7.1 |
| 05/12/2018 | 7.1 |
| 05/12/2018 | 7.1 |
| 05/12/2018 | 6.9 |
| 05/12/2018 | 6.8 |
| 05/12/2018 | 7.7 |
| 05/12/2018 | 8.1 |
| 05/12/2018 | 7.7 |
| 05/12/2018 | 7.4 |
| 05/12/2018 | 6.3 |
| 05/12/2018 | 5.6 |
| 05/12/2018 | 4.8 |
| 05/12/2018 | 4.2 |
| 06/12/2018 | 3.6 |
| 06/12/2018 | 3.1 |
| 06/12/2018 | 2.9 |
| 06/12/2018 | 3.3 |
| 06/12/2018 | 3 |
| 06/12/2018 | 3.9 |
| 06/12/2018 | 4.6 |
| 06/12/2018 | 5.8 |
| 06/12/2018 | 6.1 |
| 06/12/2018 | 6.3 |
| 06/12/2018 | 6.6 |
| 06/12/2018 | 7 |
| 06/12/2018 | 7 |
| 06/12/2018 | 7.1 |
| 06/12/2018 | 6.8 |
| 06/12/2018 | 6.7 |
| 06/12/2018 | 7.6 |
| 06/12/2018 | 7.5 |
| 06/12/2018 | 7.8 |
| 06/12/2018 | 7 |
| 06/12/2018 | 6.4 |
| 06/12/2018 | 5.7 |
| 06/12/2018 | 4.8 |
| 06/12/2018 | 4.3 |
| 07/12/2018 | 3.7 |
| 07/12/2018 | 3.2 |
| 07/12/2018 | 3 |
| 07/12/2018 | 3.3 |
| 07/12/2018 | 3 |
| 07/12/2018 | 3.9 |
| 07/12/2018 | 4.4 |
| 07/12/2018 | 5.6 |
| 07/12/2018 | 6 |
| 07/12/2018 | 6.3 |
| 07/12/2018 | 6.6 |
| 07/12/2018 | 6.9 |
| 07/12/2018 | 6.7 |
| 07/12/2018 | 6.4 |
| 07/12/2018 | 6.6 |
| 07/12/2018 | 6.8 |
| 07/12/2018 | 7.2 |
| 07/12/2018 | 7.3 |
| 07/12/2018 | 7.3 |
| 07/12/2018 | 6.9 |
| 07/12/2018 | 6 |
| 07/12/2018 | 5 |
| 07/12/2018 | 4.6 |
| 07/12/2018 | 3.8 |
| 08/12/2018 | 3.3 |
| 08/12/2018 | 3.5 |
| 08/12/2018 | 3.3 |
| 08/12/2018 | 3 |
| 08/12/2018 | 2.9 |
| 08/12/2018 | 2.9 |
| 08/12/2018 | 3.7 |
| 08/12/2018 | 3.7 |
| 08/12/2018 | 4.6 |
| 08/12/2018 | 4.8 |
| 08/12/2018 | 5.4 |
| 08/12/2018 | 5.5 |
| 08/12/2018 | 5.4 |
| 08/12/2018 | 5.2 |
| 08/12/2018 | 5.2 |
| 08/12/2018 | 5.1 |
| 08/12/2018 | 5.7 |
| 08/12/2018 | 5.9 |
| 08/12/2018 | 6 |
| 08/12/2018 | 5.9 |
| 08/12/2018 | 5.5 |
| 08/12/2018 | 4.4 |
| 08/12/2018 | 4.1 |
| 08/12/2018 | 3.8 |
| 09/12/2018 | 3.6 |
| 09/12/2018 | 2.9 |
| 09/12/2018 | 2.7 |
| 09/12/2018 | 2.9 |
| 09/12/2018 | 2.8 |
| 09/12/2018 | 3 |
| 09/12/2018 | 3.1 |
| 09/12/2018 | 3.5 |
| 09/12/2018 | 3.6 |
| 09/12/2018 | 4.4 |
| 09/12/2018 | 4.7 |
| 09/12/2018 | 4.7 |
| 09/12/2018 | 4.6 |
| 09/12/2018 | 4.6 |
| 09/12/2018 | 4.7 |
| 09/12/2018 | 4.6 |
| 09/12/2018 | 5.3 |
| 09/12/2018 | 5.3 |
| 09/12/2018 | 5.7 |
| 09/12/2018 | 5.6 |
| 09/12/2018 | 4.9 |
| 09/12/2018 | 4.5 |
| 09/12/2018 | 4.2 |
| 09/12/2018 | 3.7 |
| 10/12/2018 | 3.6 |
| 10/12/2018 | 3.3 |
| 10/12/2018 | 2.7 |
| 10/12/2018 | 2.7 |
| 10/12/2018 | 2.9 |
| 10/12/2018 | 3.3 |
| 10/12/2018 | 4.5 |
| 10/12/2018 | 5.2 |
| 10/12/2018 | 6.1 |
| 10/12/2018 | 6.4 |
| 10/12/2018 | 6.8 |
| 10/12/2018 | 6.6 |
| 10/12/2018 | 6.7 |
| 10/12/2018 | 6.3 |
| 10/12/2018 | 6.6 |
| 10/12/2018 | 6.5 |
| 10/12/2018 | 7 |
| 10/12/2018 | 7.2 |
| 10/12/2018 | 7.4 |
| 10/12/2018 | 7.3 |
| 10/12/2018 | 6.3 |
| 10/12/2018 | 5.6 |
| 10/12/2018 | 4.7 |
| 10/12/2018 | 4 |
| 11/12/2018 | 3.4 |
| 11/12/2018 | 2.9 |
| 11/12/2018 | 2.8 |
| 11/12/2018 | 3.2 |
| 11/12/2018 | 3.4 |
| 11/12/2018 | 3.7 |
| 11/12/2018 | 4.4 |
| 11/12/2018 | 5.6 |
| 11/12/2018 | 6 |
| 11/12/2018 | 6.2 |
| 11/12/2018 | 6.5 |
| 11/12/2018 | 6.9 |
| 11/12/2018 | 6.9 |
| 11/12/2018 | 6.5 |
| 11/12/2018 | 6.8 |
| 11/12/2018 | 6.7 |
| 11/12/2018 | 7.3 |
| 11/12/2018 | 6.9 |
| 11/12/2018 | 7.2 |
| 11/12/2018 | 7 |
| 11/12/2018 | 6.4 |
| 11/12/2018 | 5.2 |
| 11/12/2018 | 4.8 |
| 11/12/2018 | 4.1 |
| 12/12/2018 | 3.5 |
| 12/12/2018 | 3 |
| 12/12/2018 | 2.9 |
| 12/12/2018 | 3.2 |
| 12/12/2018 | 3.4 |
| 12/12/2018 | 3.8 |
| 12/12/2018 | 4.4 |
| 12/12/2018 | 5.2 |
| 12/12/2018 | 6.1 |
| 12/12/2018 | 6.3 |
| 12/12/2018 | 6.7 |
| 12/12/2018 | 7 |
| 12/12/2018 | 7 |
| 12/12/2018 | 6.5 |
| 12/12/2018 | 6.8 |
| 12/12/2018 | 6.7 |
| 12/12/2018 | 7.3 |
| 12/12/2018 | 7.3 |
| 12/12/2018 | 7.4 |
| 12/12/2018 | 7.3 |
| 12/12/2018 | 6.3 |
| 12/12/2018 | 5.6 |
| 12/12/2018 | 4.8 |
| 12/12/2018 | 4.1 |
| 13/12/2018 | 3.6 |
| 13/12/2018 | 3.1 |
| 13/12/2018 | 2.9 |
| 13/12/2018 | 2.8 |
| 13/12/2018 | 2.9 |
| 13/12/2018 | 3.8 |
| 13/12/2018 | 4.4 |
| 13/12/2018 | 5.2 |
| 13/12/2018 | 6 |
| 13/12/2018 | 6.2 |
| 13/12/2018 | 6.5 |
| 13/12/2018 | 6.9 |
| 13/12/2018 | 6.9 |
| 13/12/2018 | 6.4 |
| 13/12/2018 | 6.7 |
| 13/12/2018 | 6.6 |
| 13/12/2018 | 7.2 |
| 13/12/2018 | 7.3 |
| 13/12/2018 | 7.5 |
| 13/12/2018 | 7.4 |
| 13/12/2018 | 6.4 |
| 13/12/2018 | 5.2 |
| 13/12/2018 | 4.8 |
| 13/12/2018 | 4.2 |
| 14/12/2018 | 3.7 |
| 14/12/2018 | 3.1 |
| 14/12/2018 | 2.9 |
| 14/12/2018 | 2.8 |
| 14/12/2018 | 2.9 |
| 14/12/2018 | 3.7 |
| 14/12/2018 | 4.3 |
| 14/12/2018 | 5.5 |
| 14/12/2018 | 5.9 |
| 14/12/2018 | 6.1 |
| 14/12/2018 | 6.5 |
| 14/12/2018 | 6.3 |
| 14/12/2018 | 6.6 |
| 14/12/2018 | 6.3 |
| 14/12/2018 | 6.4 |
| 14/12/2018 | 6.3 |
| 14/12/2018 | 6.8 |
| 14/12/2018 | 6.6 |
| 14/12/2018 | 6.9 |
| 14/12/2018 | 6.8 |
| 14/12/2018 | 6 |
| 14/12/2018 | 5 |
| 14/12/2018 | 4.6 |
| 14/12/2018 | 3.8 |
| 15/12/2018 | 3.3 |
| 15/12/2018 | 2.9 |
| 15/12/2018 | 3.2 |
| 15/12/2018 | 2.9 |
| 15/12/2018 | 2.8 |
| 15/12/2018 | 2.8 |
| 15/12/2018 | 3.6 |
| 15/12/2018 | 3.6 |
| 15/12/2018 | 4.5 |
| 15/12/2018 | 4.7 |
| 15/12/2018 | 5.3 |
| 15/12/2018 | 5.4 |
| 15/12/2018 | 5.3 |
| 15/12/2018 | 5.1 |
| 15/12/2018 | 4.6 |
| 15/12/2018 | 5 |
| 15/12/2018 | 5.3 |
| 15/12/2018 | 5.2 |
| 15/12/2018 | 5.7 |
| 15/12/2018 | 5.8 |
| 15/12/2018 | 5.5 |
| 15/12/2018 | 4.4 |
| 15/12/2018 | 4.1 |
| 15/12/2018 | 3.7 |
| 16/12/2018 | 3.1 |
| 16/12/2018 | 2.8 |
| 16/12/2018 | 2.6 |
| 16/12/2018 | 2.8 |
| 16/12/2018 | 2.7 |
| 16/12/2018 | 2.9 |
| 16/12/2018 | 3 |
| 16/12/2018 | 3.4 |
| 16/12/2018 | 3.5 |
| 16/12/2018 | 3.9 |
| 16/12/2018 | 4.1 |
| 16/12/2018 | 4.6 |
| 16/12/2018 | 4.5 |
| 16/12/2018 | 4.5 |
| 16/12/2018 | 4.1 |
| 16/12/2018 | 4.5 |
| 16/12/2018 | 4.8 |
| 16/12/2018 | 4.6 |
| 16/12/2018 | 5.4 |
| 16/12/2018 | 5.6 |
| 16/12/2018 | 4.9 |
| 16/12/2018 | 4.5 |
| 16/12/2018 | 4.2 |
| 16/12/2018 | 3.7 |
| 17/12/2018 | 3.1 |
| 17/12/2018 | 2.7 |
| 17/12/2018 | 2.7 |
| 17/12/2018 | 2.6 |
| 17/12/2018 | 2.8 |
| 17/12/2018 | 3.7 |
| 17/12/2018 | 4.4 |
| 17/12/2018 | 5.1 |
| 17/12/2018 | 5.4 |
| 17/12/2018 | 6.3 |
| 17/12/2018 | 6.1 |
| 17/12/2018 | 6.5 |
| 17/12/2018 | 6.6 |
| 17/12/2018 | 6.2 |
| 17/12/2018 | 6 |
| 17/12/2018 | 6.4 |
| 17/12/2018 | 6.6 |
| 17/12/2018 | 6.4 |
| 17/12/2018 | 7.1 |
| 17/12/2018 | 7.3 |
| 17/12/2018 | 6.3 |
| 17/12/2018 | 5.1 |
| 17/12/2018 | 4.7 |
| 17/12/2018 | 4 |
| 18/12/2018 | 3.3 |
| 18/12/2018 | 2.9 |
| 18/12/2018 | 2.7 |
| 18/12/2018 | 3.1 |
| 18/12/2018 | 3.3 |
| 18/12/2018 | 3.6 |
| 18/12/2018 | 4.2 |
| 18/12/2018 | 5 |
| 18/12/2018 | 5.9 |
| 18/12/2018 | 6.1 |
| 18/12/2018 | 6.4 |
| 18/12/2018 | 6.3 |
| 18/12/2018 | 6.3 |
| 18/12/2018 | 6.3 |
| 18/12/2018 | 6.1 |
| 18/12/2018 | 6.2 |
| 18/12/2018 | 6.8 |
| 18/12/2018 | 6.7 |
| 18/12/2018 | 6.8 |
| 18/12/2018 | 7 |
| 18/12/2018 | 6.4 |
| 18/12/2018 | 5.2 |
| 18/12/2018 | 4.8 |
| 18/12/2018 | 4 |
| 19/12/2018 | 3.5 |
| 19/12/2018 | 3 |
| 19/12/2018 | 2.8 |
| 19/12/2018 | 3.2 |
| 19/12/2018 | 3.4 |
| 19/12/2018 | 3.7 |
| 19/12/2018 | 4.3 |
| 19/12/2018 | 5 |
| 19/12/2018 | 5.9 |
| 19/12/2018 | 6.2 |
| 19/12/2018 | 6.5 |
| 19/12/2018 | 6.4 |
| 19/12/2018 | 6.4 |
| 19/12/2018 | 6.4 |
| 19/12/2018 | 6.1 |
| 19/12/2018 | 6.2 |
| 19/12/2018 | 6.9 |
| 19/12/2018 | 6.6 |
| 19/12/2018 | 7.1 |
| 19/12/2018 | 7.3 |
| 19/12/2018 | 6.3 |
| 19/12/2018 | 5.1 |
| 19/12/2018 | 4.3 |
| 19/12/2018 | 4.1 |
| 20/12/2018 | 3.5 |
| 20/12/2018 | 3 |
| 20/12/2018 | 2.8 |
| 20/12/2018 | 2.7 |
| 20/12/2018 | 2.9 |
| 20/12/2018 | 3.7 |
| 20/12/2018 | 4.2 |
| 20/12/2018 | 5 |
| 20/12/2018 | 5.9 |
| 20/12/2018 | 6.1 |
| 20/12/2018 | 6.4 |
| 20/12/2018 | 6.3 |
| 20/12/2018 | 6.3 |
| 20/12/2018 | 6.3 |
| 20/12/2018 | 6.1 |
| 20/12/2018 | 6.1 |
| 20/12/2018 | 6.8 |
| 20/12/2018 | 6.6 |
| 20/12/2018 | 6.6 |
| 20/12/2018 | 7.3 |
| 20/12/2018 | 6.4 |
| 20/12/2018 | 5.2 |
| 20/12/2018 | 4.3 |
| 20/12/2018 | 3.7 |
| 21/12/2018 | 3.6 |
| 21/12/2018 | 3 |
| 21/12/2018 | 2.8 |
| 21/12/2018 | 2.7 |
| 21/12/2018 | 2.9 |
| 21/12/2018 | 3.6 |
| 21/12/2018 | 4.1 |
| 21/12/2018 | 4.8 |
| 21/12/2018 | 5.7 |
| 21/12/2018 | 6 |
| 21/12/2018 | 6.3 |
| 21/12/2018 | 6.2 |
| 21/12/2018 | 6.5 |
| 21/12/2018 | 6.2 |
| 21/12/2018 | 5.8 |
| 21/12/2018 | 6.2 |
| 21/12/2018 | 6.4 |
| 21/12/2018 | 5.8 |
| 21/12/2018 | 6.6 |
| 21/12/2018 | 6.8 |
| 21/12/2018 | 6 |
| 21/12/2018 | 5 |
| 21/12/2018 | 4.6 |
| 21/12/2018 | 3.8 |
| 22/12/2018 | 3.2 |
| 22/12/2018 | 2.9 |
| 22/12/2018 | 2.7 |
| 22/12/2018 | 2.9 |
| 22/12/2018 | 2.8 |
| 22/12/2018 | 2.7 |
| 22/12/2018 | 2.9 |
| 22/12/2018 | 3.5 |
| 22/12/2018 | 3.9 |
| 22/12/2018 | 4.6 |
| 22/12/2018 | 4.7 |
| 22/12/2018 | 4.8 |
| 22/12/2018 | 4.7 |
| 22/12/2018 | 5 |
| 22/12/2018 | 4.5 |
| 22/12/2018 | 4.5 |
| 22/12/2018 | 4.9 |
| 22/12/2018 | 5 |
| 22/12/2018 | 5.4 |
| 22/12/2018 | 5.8 |
| 22/12/2018 | 5 |
| 22/12/2018 | 4.4 |
| 22/12/2018 | 4.1 |
| 22/12/2018 | 3.7 |
| 23/12/2018 | 3 |
| 23/12/2018 | 2.7 |
| 23/12/2018 | 2.6 |
| 23/12/2018 | 2.8 |
| 23/12/2018 | 2.7 |
| 23/12/2018 | 2.8 |
| 23/12/2018 | 2.9 |
| 23/12/2018 | 2.8 |
| 23/12/2018 | 3.5 |
| 23/12/2018 | 3.8 |
| 23/12/2018 | 4 |
| 23/12/2018 | 4 |
| 23/12/2018 | 4.4 |
| 23/12/2018 | 4.4 |
| 23/12/2018 | 4 |
| 23/12/2018 | 4 |
| 23/12/2018 | 4.4 |
| 23/12/2018 | 4.4 |
| 23/12/2018 | 4.7 |
| 23/12/2018 | 5.5 |
| 23/12/2018 | 4.9 |
| 23/12/2018 | 4.5 |
| 23/12/2018 | 4.2 |
| 23/12/2018 | 3.7 |
| 24/12/2018 | 3.4 |
| 24/12/2018 | 2.8 |
| 24/12/2018 | 2.8 |
| 24/12/2018 | 3 |
| 24/12/2018 | 2.6 |
| 24/12/2018 | 2.7 |
| 24/12/2018 | 3.4 |
| 24/12/2018 | 3.7 |
| 24/12/2018 | 4.2 |
| 24/12/2018 | 4.9 |
| 24/12/2018 | 5.2 |
| 24/12/2018 | 5.2 |
| 24/12/2018 | 5.4 |
| 24/12/2018 | 4.8 |
| 24/12/2018 | 4.4 |
| 24/12/2018 | 4.5 |
| 24/12/2018 | 4.9 |
| 24/12/2018 | 4.6 |
| 24/12/2018 | 4.8 |
| 24/12/2018 | 4.2 |
| 24/12/2018 | 3.9 |
| 24/12/2018 | 4 |
| 24/12/2018 | 3.6 |
| 24/12/2018 | 3.4 |
| 25/12/2018 | 3.2 |
| 25/12/2018 | 2.8 |
| 25/12/2018 | 2.6 |
| 25/12/2018 | 2.4 |
| 25/12/2018 | 2.5 |
| 25/12/2018 | 2.7 |
| 25/12/2018 | 2.7 |
| 25/12/2018 | 3 |
| 25/12/2018 | 3.3 |
| 25/12/2018 | 3.6 |
| 25/12/2018 | 4.4 |
| 25/12/2018 | 4.5 |
| 25/12/2018 | 4.6 |
| 25/12/2018 | 4.4 |
| 25/12/2018 | 4.3 |
| 25/12/2018 | 3.8 |
| 25/12/2018 | 4.3 |
| 25/12/2018 | 4.5 |
| 25/12/2018 | 4.6 |
| 25/12/2018 | 4.4 |
| 25/12/2018 | 4.3 |
| 25/12/2018 | 3.7 |
| 25/12/2018 | 3.6 |
| 25/12/2018 | 3.3 |
| 26/12/2018 | 3.2 |
| 26/12/2018 | 2.8 |
| 26/12/2018 | 2.6 |
| 26/12/2018 | 2.4 |
| 26/12/2018 | 2.5 |
| 26/12/2018 | 2.7 |
| 26/12/2018 | 2.7 |
| 26/12/2018 | 3 |
| 26/12/2018 | 3.3 |
| 26/12/2018 | 3.6 |
| 26/12/2018 | 4.3 |
| 26/12/2018 | 4.5 |
| 26/12/2018 | 4.6 |
| 26/12/2018 | 4.4 |
| 26/12/2018 | 3.8 |
| 26/12/2018 | 3.8 |
| 26/12/2018 | 4.3 |
| 26/12/2018 | 4.4 |
| 26/12/2018 | 4.6 |
| 26/12/2018 | 4.4 |
| 26/12/2018 | 4.3 |
| 26/12/2018 | 3.7 |
| 26/12/2018 | 3.6 |
| 26/12/2018 | 3.3 |
| 27/12/2018 | 3.2 |
| 27/12/2018 | 2.8 |
| 27/12/2018 | 2.7 |
| 27/12/2018 | 3 |
| 27/12/2018 | 3 |
| 27/12/2018 | 3.1 |
| 27/12/2018 | 3.7 |
| 27/12/2018 | 4.3 |
| 27/12/2018 | 5.1 |
| 27/12/2018 | 5.4 |
| 27/12/2018 | 5.5 |
| 27/12/2018 | 5.9 |
| 27/12/2018 | 5.8 |
| 27/12/2018 | 5.7 |
| 27/12/2018 | 5.4 |
| 27/12/2018 | 5.8 |
| 27/12/2018 | 5.8 |
| 27/12/2018 | 6.4 |
| 27/12/2018 | 6.3 |
| 27/12/2018 | 6.3 |
| 27/12/2018 | 5.6 |
| 27/12/2018 | 5 |
| 27/12/2018 | 4.6 |
| 27/12/2018 | 4 |
| 28/12/2018 | 3.2 |
| 28/12/2018 | 2.8 |
| 28/12/2018 | 2.7 |
| 28/12/2018 | 3 |
| 28/12/2018 | 2.9 |
| 28/12/2018 | 3.1 |
| 28/12/2018 | 3.7 |
| 28/12/2018 | 4.3 |
| 28/12/2018 | 5.1 |
| 28/12/2018 | 5.4 |
| 28/12/2018 | 5.4 |
| 28/12/2018 | 5.9 |
| 28/12/2018 | 5.8 |
| 28/12/2018 | 5.7 |
| 28/12/2018 | 5.4 |
| 28/12/2018 | 5.8 |
| 28/12/2018 | 5.8 |
| 28/12/2018 | 6.3 |
| 28/12/2018 | 6.3 |
| 28/12/2018 | 6.3 |
| 28/12/2018 | 5.6 |
| 28/12/2018 | 5 |
| 28/12/2018 | 4.6 |
| 28/12/2018 | 4 |
| 29/12/2018 | 3.2 |
| 29/12/2018 | 2.8 |
| 29/12/2018 | 2.7 |
| 29/12/2018 | 3 |
| 29/12/2018 | 2.9 |
| 29/12/2018 | 3.1 |
| 29/12/2018 | 3.7 |
| 29/12/2018 | 4.3 |
| 29/12/2018 | 5.1 |
| 29/12/2018 | 5.4 |
| 29/12/2018 | 5.4 |
| 29/12/2018 | 5.4 |
| 29/12/2018 | 5.8 |
| 29/12/2018 | 5.7 |
| 29/12/2018 | 5.4 |
| 29/12/2018 | 5.8 |
| 29/12/2018 | 5.9 |
| 29/12/2018 | 5.8 |
| 29/12/2018 | 6.2 |
| 29/12/2018 | 6.3 |
| 29/12/2018 | 5.6 |
| 29/12/2018 | 5 |
| 29/12/2018 | 4.6 |
| 29/12/2018 | 4 |
| 30/12/2018 | 2.8 |
| 30/12/2018 | 2.6 |
| 30/12/2018 | 2.4 |
| 30/12/2018 | 2.6 |
| 30/12/2018 | 2.4 |
| 30/12/2018 | 2.4 |
| 30/12/2018 | 2.2 |
| 30/12/2018 | 2.5 |
| 30/12/2018 | 3.1 |
| 30/12/2018 | 3.6 |
| 30/12/2018 | 3.4 |
| 30/12/2018 | 3.9 |
| 30/12/2018 | 3.8 |
| 30/12/2018 | 3.6 |
| 30/12/2018 | 3.1 |
| 30/12/2018 | 3.1 |
| 30/12/2018 | 3.4 |
| 30/12/2018 | 3.4 |
| 30/12/2018 | 4.4 |
| 30/12/2018 | 5.3 |
| 30/12/2018 | 4.4 |
| 30/12/2018 | 3.8 |
| 30/12/2018 | 3.8 |
| 30/12/2018 | 3 |
| 31/12/2018 | 3.3 |
| 31/12/2018 | 3.4 |
| 31/12/2018 | 3 |
| 31/12/2018 | 3.1 |
| 31/12/2018 | 3.1 |
| 31/12/2018 | 3.2 |
| 31/12/2018 | 3.3 |
| 31/12/2018 | 3.9 |
| 31/12/2018 | 4.4 |
| 31/12/2018 | 4.7 |
| 31/12/2018 | 5.1 |
| 31/12/2018 | 5.4 |
| 31/12/2018 | 5.5 |
| 31/12/2018 | 5 |
| 31/12/2018 | 5.1 |
| 31/12/2018 | 5.2 |
| 31/12/2018 | 6 |
| 31/12/2018 | 5.8 |
| 31/12/2018 | 5.7 |
| 31/12/2018 | 5.4 |
| 31/12/2018 | 4.6 |
| 31/12/2018 | 4.3 |
| 31/12/2018 | 4.2 |
| 31/12/2018 | 3.9 |